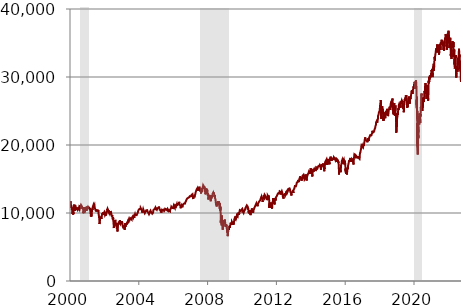
| Category | Series 0 |
|---|---|
| 2000-01-03 | 11357.51 |
| 2000-01-04 | 10997.93 |
| 2000-01-05 | 11122.65 |
| 2000-01-06 | 11253.26 |
| 2000-01-07 | 11522.56 |
| 2000-01-10 | 11572.2 |
| 2000-01-11 | 11511.08 |
| 2000-01-12 | 11551.1 |
| 2000-01-13 | 11582.43 |
| 2000-01-14 | 11722.98 |
| 2000-01-18 | 11560.72 |
| 2000-01-19 | 11489.36 |
| 2000-01-20 | 11351.3 |
| 2000-01-21 | 11251.71 |
| 2000-01-24 | 11008.17 |
| 2000-01-25 | 11029.89 |
| 2000-01-26 | 11032.99 |
| 2000-01-27 | 11028.02 |
| 2000-01-28 | 10738.87 |
| 2000-01-31 | 10940.53 |
| 2000-02-01 | 11041.05 |
| 2000-02-02 | 11003.2 |
| 2000-02-03 | 11013.44 |
| 2000-02-04 | 10963.8 |
| 2000-02-07 | 10905.79 |
| 2000-02-08 | 10957.6 |
| 2000-02-09 | 10699.16 |
| 2000-02-10 | 10643.63 |
| 2000-02-11 | 10425.21 |
| 2000-02-14 | 10519.84 |
| 2000-02-15 | 10718.09 |
| 2000-02-16 | 10561.41 |
| 2000-02-17 | 10514.57 |
| 2000-02-18 | 10219.52 |
| 2000-02-22 | 10304.84 |
| 2000-02-23 | 10225.73 |
| 2000-02-24 | 10092.63 |
| 2000-02-25 | 9862.12 |
| 2000-02-28 | 10038.65 |
| 2000-02-29 | 10128.31 |
| 2000-03-01 | 10137.93 |
| 2000-03-02 | 10164.92 |
| 2000-03-03 | 10367.2 |
| 2000-03-06 | 10170.5 |
| 2000-03-07 | 9796.03 |
| 2000-03-08 | 9856.53 |
| 2000-03-09 | 10010.73 |
| 2000-03-10 | 9928.82 |
| 2000-03-13 | 9947.13 |
| 2000-03-14 | 9811.24 |
| 2000-03-15 | 10131.41 |
| 2000-03-16 | 10630.6 |
| 2000-03-17 | 10595.23 |
| 2000-03-20 | 10680.24 |
| 2000-03-21 | 10907.34 |
| 2000-03-22 | 10866.7 |
| 2000-03-23 | 11119.86 |
| 2000-03-24 | 11112.72 |
| 2000-03-27 | 11025.85 |
| 2000-03-28 | 10936.11 |
| 2000-03-29 | 11018.72 |
| 2000-03-30 | 10980.25 |
| 2000-03-31 | 10921.92 |
| 2000-04-03 | 11221.93 |
| 2000-04-04 | 11164.84 |
| 2000-04-05 | 11033.92 |
| 2000-04-06 | 11114.27 |
| 2000-04-07 | 11111.48 |
| 2000-04-10 | 11186.56 |
| 2000-04-11 | 11287.08 |
| 2000-04-12 | 11125.13 |
| 2000-04-13 | 10923.55 |
| 2000-04-14 | 10305.77 |
| 2000-04-17 | 10582.51 |
| 2000-04-18 | 10767.42 |
| 2000-04-19 | 10674.96 |
| 2000-04-20 | 10844.05 |
| 2000-04-24 | 10906.1 |
| 2000-04-25 | 11124.82 |
| 2000-04-26 | 10945.5 |
| 2000-04-27 | 10888.1 |
| 2000-04-28 | 10733.91 |
| 2000-05-01 | 10811.78 |
| 2000-05-02 | 10731.12 |
| 2000-05-03 | 10480.13 |
| 2000-05-04 | 10412.49 |
| 2000-05-05 | 10577.86 |
| 2000-05-08 | 10603.63 |
| 2000-05-09 | 10536.75 |
| 2000-05-10 | 10367.78 |
| 2000-05-11 | 10545.97 |
| 2000-05-12 | 10609.37 |
| 2000-05-15 | 10807.78 |
| 2000-05-16 | 10934.57 |
| 2000-05-17 | 10769.74 |
| 2000-05-18 | 10777.28 |
| 2000-05-19 | 10626.85 |
| 2000-05-22 | 10542.55 |
| 2000-05-23 | 10422.27 |
| 2000-05-24 | 10535.35 |
| 2000-05-25 | 10323.92 |
| 2000-05-26 | 10299.24 |
| 2000-05-30 | 10527.13 |
| 2000-05-31 | 10522.33 |
| 2000-06-01 | 10652.2 |
| 2000-06-02 | 10794.76 |
| 2000-06-05 | 10815.3 |
| 2000-06-06 | 10735.57 |
| 2000-06-07 | 10812.86 |
| 2000-06-08 | 10668.72 |
| 2000-06-09 | 10614.06 |
| 2000-06-12 | 10564.21 |
| 2000-06-13 | 10621.84 |
| 2000-06-14 | 10687.95 |
| 2000-06-15 | 10714.82 |
| 2000-06-16 | 10449.3 |
| 2000-06-19 | 10557.84 |
| 2000-06-20 | 10435.16 |
| 2000-06-21 | 10497.74 |
| 2000-06-22 | 10376.12 |
| 2000-06-23 | 10404.75 |
| 2000-06-26 | 10542.99 |
| 2000-06-27 | 10504.46 |
| 2000-06-28 | 10527.79 |
| 2000-06-29 | 10398.04 |
| 2000-06-30 | 10447.89 |
| 2000-07-03 | 10560.67 |
| 2000-07-05 | 10483.6 |
| 2000-07-06 | 10481.47 |
| 2000-07-07 | 10635.98 |
| 2000-07-10 | 10646.58 |
| 2000-07-11 | 10727.19 |
| 2000-07-12 | 10783.76 |
| 2000-07-13 | 10788.71 |
| 2000-07-14 | 10812.75 |
| 2000-07-17 | 10804.27 |
| 2000-07-18 | 10739.92 |
| 2000-07-19 | 10696.08 |
| 2000-07-20 | 10843.87 |
| 2000-07-21 | 10733.56 |
| 2000-07-24 | 10682.12 |
| 2000-07-25 | 10699.97 |
| 2000-07-26 | 10516.48 |
| 2000-07-27 | 10586.13 |
| 2000-07-28 | 10511.17 |
| 2000-07-31 | 10521.98 |
| 2000-08-01 | 10606.95 |
| 2000-08-02 | 10687.53 |
| 2000-08-03 | 10706.58 |
| 2000-08-04 | 10767.75 |
| 2000-08-07 | 10867.01 |
| 2000-08-08 | 10976.89 |
| 2000-08-09 | 10905.83 |
| 2000-08-10 | 10908.76 |
| 2000-08-11 | 11027.8 |
| 2000-08-14 | 11176.14 |
| 2000-08-15 | 11067 |
| 2000-08-16 | 11008.39 |
| 2000-08-17 | 11055.64 |
| 2000-08-18 | 11046.48 |
| 2000-08-21 | 11079.81 |
| 2000-08-22 | 11139.15 |
| 2000-08-23 | 11144.65 |
| 2000-08-24 | 11182.74 |
| 2000-08-25 | 11192.63 |
| 2000-08-28 | 11252.84 |
| 2000-08-29 | 11215.1 |
| 2000-08-30 | 11103.01 |
| 2000-08-31 | 11215.1 |
| 2000-09-01 | 11238.78 |
| 2000-09-05 | 11260.61 |
| 2000-09-06 | 11310.64 |
| 2000-09-07 | 11259.87 |
| 2000-09-08 | 11220.65 |
| 2000-09-11 | 11195.49 |
| 2000-09-12 | 11233.23 |
| 2000-09-13 | 11182.18 |
| 2000-09-14 | 11087.47 |
| 2000-09-15 | 10927.06 |
| 2000-09-18 | 10808.52 |
| 2000-09-19 | 10789.29 |
| 2000-09-20 | 10687.92 |
| 2000-09-21 | 10765.52 |
| 2000-09-22 | 10847.37 |
| 2000-09-25 | 10808.15 |
| 2000-09-26 | 10631.32 |
| 2000-09-27 | 10628.36 |
| 2000-09-28 | 10824.06 |
| 2000-09-29 | 10650.92 |
| 2000-10-02 | 10700.13 |
| 2000-10-03 | 10719.74 |
| 2000-10-04 | 10784.48 |
| 2000-10-05 | 10724.92 |
| 2000-10-06 | 10596.54 |
| 2000-10-09 | 10568.43 |
| 2000-10-10 | 10524.4 |
| 2000-10-11 | 10413.79 |
| 2000-10-12 | 10034.58 |
| 2000-10-13 | 10192.18 |
| 2000-10-16 | 10238.8 |
| 2000-10-17 | 10089.71 |
| 2000-10-18 | 9975.02 |
| 2000-10-19 | 10142.98 |
| 2000-10-20 | 10226.59 |
| 2000-10-23 | 10271.72 |
| 2000-10-24 | 10393.07 |
| 2000-10-25 | 10326.48 |
| 2000-10-26 | 10380.12 |
| 2000-10-27 | 10590.62 |
| 2000-10-30 | 10835.77 |
| 2000-10-31 | 10971.14 |
| 2000-11-01 | 10899.47 |
| 2000-11-02 | 10880.51 |
| 2000-11-03 | 10817.95 |
| 2000-11-06 | 10977.21 |
| 2000-11-07 | 10952.18 |
| 2000-11-08 | 10907.06 |
| 2000-11-09 | 10834.25 |
| 2000-11-10 | 10602.95 |
| 2000-11-13 | 10517.25 |
| 2000-11-14 | 10681.06 |
| 2000-11-15 | 10707.6 |
| 2000-11-16 | 10656.03 |
| 2000-11-17 | 10629.87 |
| 2000-11-20 | 10462.65 |
| 2000-11-21 | 10494.5 |
| 2000-11-22 | 10399.32 |
| 2000-11-24 | 10470.23 |
| 2000-11-27 | 10546.07 |
| 2000-11-28 | 10507.58 |
| 2000-11-29 | 10629.11 |
| 2000-11-30 | 10414.49 |
| 2000-12-01 | 10373.54 |
| 2000-12-04 | 10560.1 |
| 2000-12-05 | 10898.72 |
| 2000-12-06 | 10664.38 |
| 2000-12-07 | 10617.36 |
| 2000-12-08 | 10712.91 |
| 2000-12-11 | 10725.8 |
| 2000-12-12 | 10768.27 |
| 2000-12-13 | 10794.44 |
| 2000-12-14 | 10674.99 |
| 2000-12-15 | 10434.96 |
| 2000-12-18 | 10645.42 |
| 2000-12-19 | 10584.37 |
| 2000-12-20 | 10318.93 |
| 2000-12-21 | 10487.29 |
| 2000-12-22 | 10635.56 |
| 2000-12-26 | 10692.44 |
| 2000-12-27 | 10803.16 |
| 2000-12-28 | 10868.76 |
| 2000-12-29 | 10786.85 |
| 2001-01-02 | 10646.15 |
| 2001-01-03 | 10945.75 |
| 2001-01-04 | 10912.41 |
| 2001-01-05 | 10662.01 |
| 2001-01-08 | 10621.35 |
| 2001-01-09 | 10572.55 |
| 2001-01-10 | 10604.27 |
| 2001-01-11 | 10609.55 |
| 2001-01-12 | 10525.38 |
| 2001-01-16 | 10652.66 |
| 2001-01-17 | 10584.34 |
| 2001-01-18 | 10678.28 |
| 2001-01-19 | 10587.59 |
| 2001-01-22 | 10578.24 |
| 2001-01-23 | 10649.81 |
| 2001-01-24 | 10646.97 |
| 2001-01-25 | 10729.52 |
| 2001-01-26 | 10659.98 |
| 2001-01-29 | 10702.19 |
| 2001-01-30 | 10881.2 |
| 2001-01-31 | 10887.36 |
| 2001-02-01 | 10983.63 |
| 2001-02-02 | 10864.1 |
| 2001-02-05 | 10965.85 |
| 2001-02-06 | 10957.42 |
| 2001-02-07 | 10946.72 |
| 2001-02-08 | 10880.55 |
| 2001-02-09 | 10781.45 |
| 2001-02-12 | 10946.77 |
| 2001-02-13 | 10903.32 |
| 2001-02-14 | 10795.41 |
| 2001-02-15 | 10891.02 |
| 2001-02-16 | 10799.82 |
| 2001-02-20 | 10730.88 |
| 2001-02-21 | 10526.58 |
| 2001-02-22 | 10526.81 |
| 2001-02-23 | 10441.9 |
| 2001-02-26 | 10642.53 |
| 2001-02-27 | 10636.88 |
| 2001-02-28 | 10495.28 |
| 2001-03-01 | 10450.14 |
| 2001-03-02 | 10466.31 |
| 2001-03-05 | 10562.3 |
| 2001-03-06 | 10591.22 |
| 2001-03-07 | 10729.6 |
| 2001-03-08 | 10858.25 |
| 2001-03-09 | 10644.62 |
| 2001-03-12 | 10208.25 |
| 2001-03-13 | 10290.8 |
| 2001-03-14 | 9973.46 |
| 2001-03-15 | 10031.28 |
| 2001-03-16 | 9823.41 |
| 2001-03-19 | 9959.11 |
| 2001-03-20 | 9720.76 |
| 2001-03-21 | 9487 |
| 2001-03-22 | 9389.48 |
| 2001-03-23 | 9504.78 |
| 2001-03-26 | 9687.53 |
| 2001-03-27 | 9947.54 |
| 2001-03-28 | 9785.35 |
| 2001-03-29 | 9799.06 |
| 2001-03-30 | 9878.78 |
| 2001-04-02 | 9777.93 |
| 2001-04-03 | 9485.71 |
| 2001-04-04 | 9515.42 |
| 2001-04-05 | 9918.05 |
| 2001-04-06 | 9791.09 |
| 2001-04-09 | 9845.15 |
| 2001-04-10 | 10102.74 |
| 2001-04-11 | 10013.47 |
| 2001-04-12 | 10126.94 |
| 2001-04-16 | 10158.56 |
| 2001-04-17 | 10216.73 |
| 2001-04-18 | 10615.83 |
| 2001-04-19 | 10693.71 |
| 2001-04-20 | 10579.85 |
| 2001-04-23 | 10532.23 |
| 2001-04-24 | 10454.34 |
| 2001-04-25 | 10625.2 |
| 2001-04-26 | 10692.35 |
| 2001-04-27 | 10810.05 |
| 2001-04-30 | 10734.97 |
| 2001-05-01 | 10898.34 |
| 2001-05-02 | 10876.68 |
| 2001-05-03 | 10796.65 |
| 2001-05-04 | 10951.24 |
| 2001-05-07 | 10935.17 |
| 2001-05-08 | 10883.51 |
| 2001-05-09 | 10866.98 |
| 2001-05-10 | 10910.44 |
| 2001-05-11 | 10821.31 |
| 2001-05-14 | 10877.33 |
| 2001-05-15 | 10872.97 |
| 2001-05-16 | 11215.92 |
| 2001-05-17 | 11248.58 |
| 2001-05-18 | 11301.74 |
| 2001-05-21 | 11337.92 |
| 2001-05-22 | 11257.24 |
| 2001-05-23 | 11105.51 |
| 2001-05-24 | 11122.42 |
| 2001-05-25 | 11005.37 |
| 2001-05-29 | 11039.14 |
| 2001-05-30 | 10872.64 |
| 2001-05-31 | 10911.94 |
| 2001-06-01 | 10990.41 |
| 2001-06-04 | 11061.52 |
| 2001-06-05 | 11175.84 |
| 2001-06-06 | 11070.24 |
| 2001-06-07 | 11090.74 |
| 2001-06-08 | 10977 |
| 2001-06-11 | 10922.09 |
| 2001-06-12 | 10948.38 |
| 2001-06-13 | 10871.62 |
| 2001-06-14 | 10690.13 |
| 2001-06-15 | 10623.64 |
| 2001-06-18 | 10645.38 |
| 2001-06-19 | 10596.67 |
| 2001-06-20 | 10647.33 |
| 2001-06-21 | 10715.43 |
| 2001-06-22 | 10604.59 |
| 2001-06-25 | 10504.22 |
| 2001-06-26 | 10472.48 |
| 2001-06-27 | 10434.84 |
| 2001-06-28 | 10566.21 |
| 2001-06-29 | 10502.4 |
| 2001-07-02 | 10593.72 |
| 2001-07-03 | 10571.11 |
| 2001-07-05 | 10479.86 |
| 2001-07-06 | 10252.68 |
| 2001-07-09 | 10299.4 |
| 2001-07-10 | 10175.64 |
| 2001-07-11 | 10241.02 |
| 2001-07-12 | 10478.99 |
| 2001-07-13 | 10539.06 |
| 2001-07-16 | 10472.12 |
| 2001-07-17 | 10606.39 |
| 2001-07-18 | 10569.83 |
| 2001-07-19 | 10610 |
| 2001-07-20 | 10576.65 |
| 2001-07-23 | 10424.42 |
| 2001-07-24 | 10241.12 |
| 2001-07-25 | 10405.67 |
| 2001-07-26 | 10455.63 |
| 2001-07-27 | 10416.67 |
| 2001-07-30 | 10401.72 |
| 2001-07-31 | 10522.81 |
| 2001-08-01 | 10510.01 |
| 2001-08-02 | 10551.18 |
| 2001-08-03 | 10512.78 |
| 2001-08-06 | 10401.31 |
| 2001-08-07 | 10458.74 |
| 2001-08-08 | 10293.5 |
| 2001-08-09 | 10298.56 |
| 2001-08-10 | 10416.25 |
| 2001-08-13 | 10415.91 |
| 2001-08-14 | 10412.17 |
| 2001-08-15 | 10345.95 |
| 2001-08-16 | 10392.52 |
| 2001-08-17 | 10240.78 |
| 2001-08-20 | 10320.07 |
| 2001-08-21 | 10174.14 |
| 2001-08-22 | 10276.9 |
| 2001-08-23 | 10229.15 |
| 2001-08-24 | 10423.17 |
| 2001-08-27 | 10382.35 |
| 2001-08-28 | 10222.03 |
| 2001-08-29 | 10090.9 |
| 2001-08-30 | 9919.58 |
| 2001-08-31 | 9949.75 |
| 2001-09-04 | 9997.49 |
| 2001-09-05 | 10033.27 |
| 2001-09-06 | 9840.84 |
| 2001-09-07 | 9605.85 |
| 2001-09-10 | 9605.51 |
| 2001-09-17 | 8920.7 |
| 2001-09-18 | 8903.4 |
| 2001-09-19 | 8759.13 |
| 2001-09-20 | 8376.21 |
| 2001-09-21 | 8235.81 |
| 2001-09-24 | 8603.86 |
| 2001-09-25 | 8659.97 |
| 2001-09-26 | 8567.39 |
| 2001-09-27 | 8681.42 |
| 2001-09-28 | 8847.56 |
| 2001-10-01 | 8836.83 |
| 2001-10-02 | 8950.59 |
| 2001-10-03 | 9123.78 |
| 2001-10-04 | 9060.88 |
| 2001-10-05 | 9119.77 |
| 2001-10-08 | 9067.94 |
| 2001-10-09 | 9052.44 |
| 2001-10-10 | 9240.86 |
| 2001-10-11 | 9410.45 |
| 2001-10-12 | 9344.16 |
| 2001-10-15 | 9347.62 |
| 2001-10-16 | 9384.23 |
| 2001-10-17 | 9232.97 |
| 2001-10-18 | 9163.22 |
| 2001-10-19 | 9204.11 |
| 2001-10-22 | 9377.03 |
| 2001-10-23 | 9340.08 |
| 2001-10-24 | 9345.62 |
| 2001-10-25 | 9462.9 |
| 2001-10-26 | 9545.17 |
| 2001-10-29 | 9269.5 |
| 2001-10-30 | 9121.98 |
| 2001-10-31 | 9075.14 |
| 2001-11-01 | 9263.9 |
| 2001-11-02 | 9323.54 |
| 2001-11-05 | 9441.03 |
| 2001-11-06 | 9591.12 |
| 2001-11-07 | 9554.37 |
| 2001-11-08 | 9587.52 |
| 2001-11-09 | 9608 |
| 2001-11-12 | 9554.37 |
| 2001-11-13 | 9750.95 |
| 2001-11-14 | 9823.61 |
| 2001-11-15 | 9872.39 |
| 2001-11-16 | 9866.99 |
| 2001-11-19 | 9976.46 |
| 2001-11-20 | 9901.38 |
| 2001-11-21 | 9834.68 |
| 2001-11-23 | 9959.71 |
| 2001-11-26 | 9982.75 |
| 2001-11-27 | 9872.6 |
| 2001-11-28 | 9711.86 |
| 2001-11-29 | 9829.42 |
| 2001-11-30 | 9851.56 |
| 2001-12-03 | 9763.96 |
| 2001-12-04 | 9893.84 |
| 2001-12-05 | 10114.29 |
| 2001-12-06 | 10099.14 |
| 2001-12-07 | 10049.46 |
| 2001-12-10 | 9921.45 |
| 2001-12-11 | 9888.37 |
| 2001-12-12 | 9894.81 |
| 2001-12-13 | 9766.45 |
| 2001-12-14 | 9811.15 |
| 2001-12-17 | 9891.97 |
| 2001-12-18 | 9998.39 |
| 2001-12-19 | 10070.49 |
| 2001-12-20 | 9985.18 |
| 2001-12-21 | 10035.34 |
| 2001-12-24 | 10035.34 |
| 2001-12-26 | 10088.14 |
| 2001-12-27 | 10131.31 |
| 2001-12-28 | 10136.99 |
| 2001-12-31 | 10021.5 |
| 2002-01-02 | 10073.4 |
| 2002-01-03 | 10172.14 |
| 2002-01-04 | 10259.74 |
| 2002-01-07 | 10197.05 |
| 2002-01-08 | 10150.55 |
| 2002-01-09 | 10094.09 |
| 2002-01-10 | 10067.86 |
| 2002-01-11 | 9987.53 |
| 2002-01-14 | 9891.42 |
| 2002-01-15 | 9924.15 |
| 2002-01-16 | 9712.27 |
| 2002-01-17 | 9850.04 |
| 2002-01-18 | 9771.85 |
| 2002-01-22 | 9713.8 |
| 2002-01-23 | 9730.96 |
| 2002-01-24 | 9796.07 |
| 2002-01-25 | 9840.08 |
| 2002-01-28 | 9865.75 |
| 2002-01-29 | 9618.24 |
| 2002-01-30 | 9762.86 |
| 2002-01-31 | 9920 |
| 2002-02-01 | 9907.26 |
| 2002-02-04 | 9687.09 |
| 2002-02-05 | 9685.43 |
| 2002-02-06 | 9653.39 |
| 2002-02-07 | 9625.44 |
| 2002-02-08 | 9744.24 |
| 2002-02-11 | 9884.78 |
| 2002-02-12 | 9863.74 |
| 2002-02-13 | 9989.67 |
| 2002-02-14 | 10001.99 |
| 2002-02-15 | 9903.04 |
| 2002-02-19 | 9745.14 |
| 2002-02-20 | 9941.17 |
| 2002-02-21 | 9834.68 |
| 2002-02-22 | 9968.15 |
| 2002-02-25 | 10145.71 |
| 2002-02-26 | 10115.26 |
| 2002-02-27 | 10127.58 |
| 2002-02-28 | 10106.13 |
| 2002-03-01 | 10368.86 |
| 2002-03-04 | 10586.82 |
| 2002-03-05 | 10433.41 |
| 2002-03-06 | 10574.29 |
| 2002-03-07 | 10525.37 |
| 2002-03-08 | 10572.49 |
| 2002-03-11 | 10611.24 |
| 2002-03-12 | 10632.35 |
| 2002-03-13 | 10501.85 |
| 2002-03-14 | 10517.14 |
| 2002-03-15 | 10607.23 |
| 2002-03-18 | 10577.75 |
| 2002-03-19 | 10635.25 |
| 2002-03-20 | 10501.57 |
| 2002-03-21 | 10479.84 |
| 2002-03-22 | 10427.67 |
| 2002-03-25 | 10281.67 |
| 2002-03-26 | 10353.36 |
| 2002-03-27 | 10426.91 |
| 2002-03-28 | 10403.94 |
| 2002-04-01 | 10362.7 |
| 2002-04-02 | 10313.71 |
| 2002-04-03 | 10198.29 |
| 2002-04-04 | 10235.17 |
| 2002-04-05 | 10271.64 |
| 2002-04-08 | 10249.08 |
| 2002-04-09 | 10208.67 |
| 2002-04-10 | 10381.73 |
| 2002-04-11 | 10176.08 |
| 2002-04-12 | 10190.82 |
| 2002-04-15 | 10093.67 |
| 2002-04-16 | 10301.32 |
| 2002-04-17 | 10220.78 |
| 2002-04-18 | 10205.28 |
| 2002-04-19 | 10257.11 |
| 2002-04-22 | 10136.43 |
| 2002-04-23 | 10089.24 |
| 2002-04-24 | 10030.43 |
| 2002-04-25 | 10035.06 |
| 2002-04-26 | 9910.72 |
| 2002-04-29 | 9819.87 |
| 2002-04-30 | 9946.22 |
| 2002-05-01 | 10059.63 |
| 2002-05-02 | 10091.87 |
| 2002-05-03 | 10006.63 |
| 2002-05-06 | 9808.04 |
| 2002-05-07 | 9836.55 |
| 2002-05-08 | 10141.83 |
| 2002-05-09 | 10037.42 |
| 2002-05-10 | 9939.92 |
| 2002-05-13 | 10109.66 |
| 2002-05-14 | 10298.14 |
| 2002-05-15 | 10243.68 |
| 2002-05-16 | 10289.21 |
| 2002-05-17 | 10353.08 |
| 2002-05-20 | 10229.5 |
| 2002-05-21 | 10105.71 |
| 2002-05-22 | 10157.88 |
| 2002-05-23 | 10216.08 |
| 2002-05-24 | 10104.26 |
| 2002-05-28 | 9981.58 |
| 2002-05-29 | 9923.04 |
| 2002-05-30 | 9911.69 |
| 2002-05-31 | 9925.25 |
| 2002-06-03 | 9709.79 |
| 2002-06-04 | 9687.84 |
| 2002-06-05 | 9796.8 |
| 2002-06-06 | 9624.64 |
| 2002-06-07 | 9589.67 |
| 2002-06-10 | 9645.4 |
| 2002-06-11 | 9517.26 |
| 2002-06-12 | 9617.71 |
| 2002-06-13 | 9502.8 |
| 2002-06-14 | 9474.21 |
| 2002-06-17 | 9687.42 |
| 2002-06-18 | 9706.12 |
| 2002-06-19 | 9561.57 |
| 2002-06-20 | 9431.77 |
| 2002-06-21 | 9253.79 |
| 2002-06-24 | 9281.82 |
| 2002-06-25 | 9126.82 |
| 2002-06-26 | 9120.11 |
| 2002-06-27 | 9269.92 |
| 2002-06-28 | 9243.26 |
| 2002-07-01 | 9109.79 |
| 2002-07-02 | 9007.75 |
| 2002-07-03 | 9054.97 |
| 2002-07-05 | 9379.5 |
| 2002-07-08 | 9274.9 |
| 2002-07-09 | 9096.09 |
| 2002-07-10 | 8813.5 |
| 2002-07-11 | 8801.53 |
| 2002-07-12 | 8684.53 |
| 2002-07-15 | 8639.19 |
| 2002-07-16 | 8473.11 |
| 2002-07-17 | 8542.48 |
| 2002-07-18 | 8409.49 |
| 2002-07-19 | 8019.26 |
| 2002-07-22 | 7784.58 |
| 2002-07-23 | 7702.34 |
| 2002-07-24 | 8191.29 |
| 2002-07-25 | 8186.31 |
| 2002-07-26 | 8264.39 |
| 2002-07-29 | 8711.88 |
| 2002-07-30 | 8680.03 |
| 2002-07-31 | 8736.59 |
| 2002-08-01 | 8506.62 |
| 2002-08-02 | 8313.13 |
| 2002-08-05 | 8043.63 |
| 2002-08-06 | 8274.09 |
| 2002-08-07 | 8456.15 |
| 2002-08-08 | 8712.02 |
| 2002-08-09 | 8745.45 |
| 2002-08-12 | 8688.89 |
| 2002-08-13 | 8482.39 |
| 2002-08-14 | 8743.31 |
| 2002-08-15 | 8818.14 |
| 2002-08-16 | 8778.06 |
| 2002-08-19 | 8990.79 |
| 2002-08-20 | 8872.07 |
| 2002-08-21 | 8957.23 |
| 2002-08-22 | 9053.64 |
| 2002-08-23 | 8872.96 |
| 2002-08-26 | 8919.01 |
| 2002-08-27 | 8824.41 |
| 2002-08-28 | 8694.09 |
| 2002-08-29 | 8670.99 |
| 2002-08-30 | 8663.5 |
| 2002-09-03 | 8308.05 |
| 2002-09-04 | 8425.12 |
| 2002-09-05 | 8283.7 |
| 2002-09-06 | 8427.2 |
| 2002-09-09 | 8519.38 |
| 2002-09-10 | 8602.61 |
| 2002-09-11 | 8581.17 |
| 2002-09-12 | 8379.41 |
| 2002-09-13 | 8312.69 |
| 2002-09-16 | 8380.18 |
| 2002-09-17 | 8207.55 |
| 2002-09-18 | 8172.45 |
| 2002-09-19 | 7942.39 |
| 2002-09-20 | 7986.02 |
| 2002-09-23 | 7872.15 |
| 2002-09-24 | 7683.13 |
| 2002-09-25 | 7841.82 |
| 2002-09-26 | 7997.12 |
| 2002-09-27 | 7701.45 |
| 2002-09-30 | 7591.93 |
| 2002-10-01 | 7938.79 |
| 2002-10-02 | 7755.61 |
| 2002-10-03 | 7717.19 |
| 2002-10-04 | 7528.4 |
| 2002-10-07 | 7422.84 |
| 2002-10-08 | 7501.49 |
| 2002-10-09 | 7286.27 |
| 2002-10-10 | 7533.95 |
| 2002-10-11 | 7850.29 |
| 2002-10-14 | 7877.4 |
| 2002-10-15 | 8255.68 |
| 2002-10-16 | 8036.03 |
| 2002-10-17 | 8275.04 |
| 2002-10-18 | 8322.4 |
| 2002-10-21 | 8538.24 |
| 2002-10-22 | 8450.16 |
| 2002-10-23 | 8494.27 |
| 2002-10-24 | 8317.34 |
| 2002-10-25 | 8443.99 |
| 2002-10-28 | 8368.04 |
| 2002-10-29 | 8368.94 |
| 2002-10-30 | 8427.41 |
| 2002-10-31 | 8397.03 |
| 2002-11-01 | 8517.64 |
| 2002-11-04 | 8571.6 |
| 2002-11-05 | 8678.27 |
| 2002-11-06 | 8771.01 |
| 2002-11-07 | 8586.24 |
| 2002-11-08 | 8537.13 |
| 2002-11-11 | 8358.95 |
| 2002-11-12 | 8386 |
| 2002-11-13 | 8398.49 |
| 2002-11-14 | 8542.13 |
| 2002-11-15 | 8579.09 |
| 2002-11-18 | 8486.57 |
| 2002-11-19 | 8474.78 |
| 2002-11-20 | 8623.01 |
| 2002-11-21 | 8845.15 |
| 2002-11-22 | 8804.84 |
| 2002-11-25 | 8849.4 |
| 2002-11-26 | 8676.42 |
| 2002-11-27 | 8931.68 |
| 2002-11-29 | 8896.09 |
| 2002-12-02 | 8862.57 |
| 2002-12-03 | 8742.93 |
| 2002-12-04 | 8737.85 |
| 2002-12-05 | 8623.28 |
| 2002-12-06 | 8645.77 |
| 2002-12-09 | 8473.41 |
| 2002-12-10 | 8574.26 |
| 2002-12-11 | 8589.14 |
| 2002-12-12 | 8538.4 |
| 2002-12-13 | 8433.71 |
| 2002-12-16 | 8627.4 |
| 2002-12-17 | 8535.39 |
| 2002-12-18 | 8447.35 |
| 2002-12-19 | 8364.8 |
| 2002-12-20 | 8511.32 |
| 2002-12-23 | 8493.29 |
| 2002-12-24 | 8448.11 |
| 2002-12-26 | 8432.61 |
| 2002-12-27 | 8303.78 |
| 2002-12-30 | 8332.85 |
| 2002-12-31 | 8341.63 |
| 2003-01-02 | 8607.52 |
| 2003-01-03 | 8601.69 |
| 2003-01-06 | 8773.57 |
| 2003-01-07 | 8740.59 |
| 2003-01-08 | 8595.31 |
| 2003-01-09 | 8776.18 |
| 2003-01-10 | 8784.89 |
| 2003-01-13 | 8785.98 |
| 2003-01-14 | 8842.62 |
| 2003-01-15 | 8723.18 |
| 2003-01-16 | 8697.87 |
| 2003-01-17 | 8586.74 |
| 2003-01-21 | 8442.9 |
| 2003-01-22 | 8318.73 |
| 2003-01-23 | 8369.47 |
| 2003-01-24 | 8131.01 |
| 2003-01-27 | 7989.56 |
| 2003-01-28 | 8088.84 |
| 2003-01-29 | 8110.71 |
| 2003-01-30 | 7945.13 |
| 2003-01-31 | 8053.81 |
| 2003-02-03 | 8109.82 |
| 2003-02-04 | 8013.29 |
| 2003-02-05 | 7985.18 |
| 2003-02-06 | 7929.3 |
| 2003-02-07 | 7864.23 |
| 2003-02-10 | 7920.11 |
| 2003-02-11 | 7843.11 |
| 2003-02-12 | 7758.17 |
| 2003-02-13 | 7749.87 |
| 2003-02-14 | 7908.8 |
| 2003-02-18 | 8041.15 |
| 2003-02-19 | 8000.6 |
| 2003-02-20 | 7914.96 |
| 2003-02-21 | 8018.11 |
| 2003-02-24 | 7858.24 |
| 2003-02-25 | 7909.5 |
| 2003-02-26 | 7806.98 |
| 2003-02-27 | 7884.99 |
| 2003-02-28 | 7891.08 |
| 2003-03-03 | 7837.86 |
| 2003-03-04 | 7704.87 |
| 2003-03-05 | 7775.6 |
| 2003-03-06 | 7673.99 |
| 2003-03-07 | 7740.03 |
| 2003-03-10 | 7568.18 |
| 2003-03-11 | 7524.06 |
| 2003-03-12 | 7552.07 |
| 2003-03-13 | 7821.75 |
| 2003-03-14 | 7859.71 |
| 2003-03-17 | 8141.92 |
| 2003-03-18 | 8194.23 |
| 2003-03-19 | 8265.45 |
| 2003-03-20 | 8286.6 |
| 2003-03-21 | 8521.97 |
| 2003-03-24 | 8214.68 |
| 2003-03-25 | 8280.23 |
| 2003-03-26 | 8229.88 |
| 2003-03-27 | 8201.45 |
| 2003-03-28 | 8145.77 |
| 2003-03-31 | 7992.13 |
| 2003-04-01 | 8069.86 |
| 2003-04-02 | 8285.06 |
| 2003-04-03 | 8240.38 |
| 2003-04-04 | 8277.15 |
| 2003-04-07 | 8300.41 |
| 2003-04-08 | 8298.92 |
| 2003-04-09 | 8197.94 |
| 2003-04-10 | 8221.33 |
| 2003-04-11 | 8203.41 |
| 2003-04-14 | 8351.1 |
| 2003-04-15 | 8402.36 |
| 2003-04-16 | 8257.61 |
| 2003-04-17 | 8337.65 |
| 2003-04-21 | 8328.9 |
| 2003-04-22 | 8484.99 |
| 2003-04-23 | 8515.66 |
| 2003-04-24 | 8440.04 |
| 2003-04-25 | 8306.35 |
| 2003-04-28 | 8471.61 |
| 2003-04-29 | 8502.99 |
| 2003-04-30 | 8480.09 |
| 2003-05-01 | 8454.25 |
| 2003-05-02 | 8582.68 |
| 2003-05-05 | 8531.57 |
| 2003-05-06 | 8588.36 |
| 2003-05-07 | 8560.63 |
| 2003-05-08 | 8491.22 |
| 2003-05-09 | 8604.6 |
| 2003-05-12 | 8726.73 |
| 2003-05-13 | 8679.25 |
| 2003-05-14 | 8647.82 |
| 2003-05-15 | 8713.14 |
| 2003-05-16 | 8678.97 |
| 2003-05-19 | 8493.39 |
| 2003-05-20 | 8491.36 |
| 2003-05-21 | 8516.43 |
| 2003-05-22 | 8594.02 |
| 2003-05-23 | 8601.38 |
| 2003-05-27 | 8781.35 |
| 2003-05-28 | 8793.12 |
| 2003-05-29 | 8711.18 |
| 2003-05-30 | 8850.26 |
| 2003-06-02 | 8897.81 |
| 2003-06-03 | 8922.95 |
| 2003-06-04 | 9038.98 |
| 2003-06-05 | 9041.3 |
| 2003-06-06 | 9062.79 |
| 2003-06-09 | 8980 |
| 2003-06-10 | 9054.89 |
| 2003-06-11 | 9183.22 |
| 2003-06-12 | 9196.55 |
| 2003-06-13 | 9117.12 |
| 2003-06-16 | 9318.96 |
| 2003-06-17 | 9323.02 |
| 2003-06-18 | 9293.8 |
| 2003-06-19 | 9179.53 |
| 2003-06-20 | 9200.75 |
| 2003-06-23 | 9072.95 |
| 2003-06-24 | 9109.85 |
| 2003-06-25 | 9011.53 |
| 2003-06-26 | 9079.04 |
| 2003-06-27 | 8989.05 |
| 2003-06-30 | 8985.44 |
| 2003-07-01 | 9040.95 |
| 2003-07-02 | 9142.84 |
| 2003-07-03 | 9070.21 |
| 2003-07-07 | 9216.79 |
| 2003-07-08 | 9223.09 |
| 2003-07-09 | 9156.21 |
| 2003-07-10 | 9036.04 |
| 2003-07-11 | 9119.59 |
| 2003-07-14 | 9177.15 |
| 2003-07-15 | 9128.97 |
| 2003-07-16 | 9094.59 |
| 2003-07-17 | 9050.82 |
| 2003-07-18 | 9188.15 |
| 2003-07-21 | 9096.69 |
| 2003-07-22 | 9158.45 |
| 2003-07-23 | 9194.24 |
| 2003-07-24 | 9112.51 |
| 2003-07-25 | 9284.57 |
| 2003-07-28 | 9266.51 |
| 2003-07-29 | 9204.46 |
| 2003-07-30 | 9200.05 |
| 2003-07-31 | 9233.8 |
| 2003-08-01 | 9153.97 |
| 2003-08-04 | 9186.04 |
| 2003-08-05 | 9036.32 |
| 2003-08-06 | 9061.74 |
| 2003-08-07 | 9126.45 |
| 2003-08-08 | 9191.09 |
| 2003-08-11 | 9217.35 |
| 2003-08-12 | 9310.06 |
| 2003-08-13 | 9271.76 |
| 2003-08-14 | 9310.56 |
| 2003-08-15 | 9321.69 |
| 2003-08-18 | 9412.45 |
| 2003-08-19 | 9428.9 |
| 2003-08-20 | 9397.51 |
| 2003-08-21 | 9423.68 |
| 2003-08-22 | 9348.87 |
| 2003-08-25 | 9317.64 |
| 2003-08-26 | 9340.45 |
| 2003-08-27 | 9333.79 |
| 2003-08-28 | 9374.21 |
| 2003-08-29 | 9415.82 |
| 2003-09-02 | 9523.27 |
| 2003-09-03 | 9568.46 |
| 2003-09-04 | 9587.9 |
| 2003-09-05 | 9503.34 |
| 2003-09-08 | 9586.29 |
| 2003-09-09 | 9507.2 |
| 2003-09-10 | 9420.46 |
| 2003-09-11 | 9459.76 |
| 2003-09-12 | 9471.55 |
| 2003-09-15 | 9448.81 |
| 2003-09-16 | 9567.34 |
| 2003-09-17 | 9545.65 |
| 2003-09-18 | 9659.13 |
| 2003-09-19 | 9644.82 |
| 2003-09-22 | 9535.41 |
| 2003-09-23 | 9576.04 |
| 2003-09-24 | 9425.51 |
| 2003-09-25 | 9343.96 |
| 2003-09-26 | 9313.08 |
| 2003-09-29 | 9380.24 |
| 2003-09-30 | 9275.06 |
| 2003-10-01 | 9469.2 |
| 2003-10-02 | 9487.8 |
| 2003-10-03 | 9572.31 |
| 2003-10-06 | 9594.98 |
| 2003-10-07 | 9654.61 |
| 2003-10-08 | 9630.9 |
| 2003-10-09 | 9680.01 |
| 2003-10-10 | 9674.68 |
| 2003-10-13 | 9764.38 |
| 2003-10-14 | 9812.98 |
| 2003-10-15 | 9803.05 |
| 2003-10-16 | 9791.72 |
| 2003-10-17 | 9721.79 |
| 2003-10-20 | 9777.94 |
| 2003-10-21 | 9747.64 |
| 2003-10-22 | 9598.24 |
| 2003-10-23 | 9613.13 |
| 2003-10-24 | 9582.46 |
| 2003-10-27 | 9608.16 |
| 2003-10-28 | 9748.31 |
| 2003-10-29 | 9774.53 |
| 2003-10-30 | 9786.61 |
| 2003-10-31 | 9801.12 |
| 2003-11-03 | 9858.46 |
| 2003-11-04 | 9838.83 |
| 2003-11-05 | 9820.83 |
| 2003-11-06 | 9856.97 |
| 2003-11-07 | 9809.79 |
| 2003-11-10 | 9756.53 |
| 2003-11-11 | 9737.79 |
| 2003-11-12 | 9848.83 |
| 2003-11-13 | 9837.94 |
| 2003-11-14 | 9768.68 |
| 2003-11-17 | 9710.83 |
| 2003-11-18 | 9624.16 |
| 2003-11-19 | 9690.46 |
| 2003-11-20 | 9619.42 |
| 2003-11-21 | 9628.53 |
| 2003-11-24 | 9747.79 |
| 2003-11-25 | 9763.94 |
| 2003-11-26 | 9779.57 |
| 2003-11-28 | 9782.46 |
| 2003-12-01 | 9899.05 |
| 2003-12-02 | 9853.64 |
| 2003-12-03 | 9873.42 |
| 2003-12-04 | 9930.82 |
| 2003-12-05 | 9862.68 |
| 2003-12-08 | 9965.27 |
| 2003-12-09 | 9923.42 |
| 2003-12-10 | 9921.86 |
| 2003-12-11 | 10008.16 |
| 2003-12-12 | 10042.16 |
| 2003-12-15 | 10022.82 |
| 2003-12-16 | 10129.56 |
| 2003-12-17 | 10145.26 |
| 2003-12-18 | 10248.08 |
| 2003-12-19 | 10278.22 |
| 2003-12-22 | 10338 |
| 2003-12-23 | 10341.26 |
| 2003-12-24 | 10305.19 |
| 2003-12-26 | 10324.67 |
| 2003-12-29 | 10450 |
| 2003-12-30 | 10425.04 |
| 2003-12-31 | 10453.92 |
| 2004-01-02 | 10409.85 |
| 2004-01-05 | 10544.07 |
| 2004-01-06 | 10538.66 |
| 2004-01-07 | 10529.03 |
| 2004-01-08 | 10592.44 |
| 2004-01-09 | 10458.89 |
| 2004-01-12 | 10485.18 |
| 2004-01-13 | 10427.18 |
| 2004-01-14 | 10538.37 |
| 2004-01-15 | 10553.85 |
| 2004-01-16 | 10600.51 |
| 2004-01-20 | 10528.66 |
| 2004-01-21 | 10623.62 |
| 2004-01-22 | 10623.18 |
| 2004-01-23 | 10568.29 |
| 2004-01-26 | 10702.51 |
| 2004-01-27 | 10609.92 |
| 2004-01-28 | 10468.37 |
| 2004-01-29 | 10510.29 |
| 2004-01-30 | 10488.07 |
| 2004-02-02 | 10499.18 |
| 2004-02-03 | 10505.18 |
| 2004-02-04 | 10470.74 |
| 2004-02-05 | 10495.55 |
| 2004-02-06 | 10593.03 |
| 2004-02-09 | 10579.03 |
| 2004-02-10 | 10613.85 |
| 2004-02-11 | 10737.7 |
| 2004-02-12 | 10694.07 |
| 2004-02-13 | 10627.85 |
| 2004-02-17 | 10714.88 |
| 2004-02-18 | 10671.99 |
| 2004-02-19 | 10664.73 |
| 2004-02-20 | 10619.03 |
| 2004-02-23 | 10609.62 |
| 2004-02-24 | 10566.37 |
| 2004-02-25 | 10601.62 |
| 2004-02-26 | 10580.14 |
| 2004-02-27 | 10583.92 |
| 2004-03-01 | 10678.14 |
| 2004-03-02 | 10591.48 |
| 2004-03-03 | 10593.11 |
| 2004-03-04 | 10588 |
| 2004-03-05 | 10595.55 |
| 2004-03-08 | 10529.48 |
| 2004-03-09 | 10456.96 |
| 2004-03-10 | 10296.89 |
| 2004-03-11 | 10128.38 |
| 2004-03-12 | 10240.08 |
| 2004-03-15 | 10102.89 |
| 2004-03-16 | 10184.67 |
| 2004-03-17 | 10300.3 |
| 2004-03-18 | 10295.78 |
| 2004-03-19 | 10186.6 |
| 2004-03-22 | 10064.75 |
| 2004-03-23 | 10063.64 |
| 2004-03-24 | 10048.23 |
| 2004-03-25 | 10218.82 |
| 2004-03-26 | 10212.97 |
| 2004-03-29 | 10329.63 |
| 2004-03-30 | 10381.7 |
| 2004-03-31 | 10357.7 |
| 2004-04-01 | 10373.33 |
| 2004-04-02 | 10470.59 |
| 2004-04-05 | 10558.37 |
| 2004-04-06 | 10570.81 |
| 2004-04-07 | 10480.15 |
| 2004-04-08 | 10442.03 |
| 2004-04-12 | 10515.56 |
| 2004-04-13 | 10381.28 |
| 2004-04-14 | 10377.95 |
| 2004-04-15 | 10397.46 |
| 2004-04-16 | 10451.97 |
| 2004-04-19 | 10437.85 |
| 2004-04-20 | 10314.5 |
| 2004-04-21 | 10317.27 |
| 2004-04-22 | 10461.2 |
| 2004-04-23 | 10472.84 |
| 2004-04-26 | 10444.73 |
| 2004-04-27 | 10478.16 |
| 2004-04-28 | 10342.6 |
| 2004-04-29 | 10272.27 |
| 2004-04-30 | 10225.57 |
| 2004-05-03 | 10314 |
| 2004-05-04 | 10317.2 |
| 2004-05-05 | 10310.95 |
| 2004-05-06 | 10241.26 |
| 2004-05-07 | 10117.34 |
| 2004-05-10 | 9990.02 |
| 2004-05-11 | 10019.47 |
| 2004-05-12 | 10045.16 |
| 2004-05-13 | 10010.74 |
| 2004-05-14 | 10012.87 |
| 2004-05-17 | 9906.91 |
| 2004-05-18 | 9968.51 |
| 2004-05-19 | 9937.71 |
| 2004-05-20 | 9937.64 |
| 2004-05-21 | 9966.74 |
| 2004-05-24 | 9958.43 |
| 2004-05-25 | 10117.62 |
| 2004-05-26 | 10109.89 |
| 2004-05-27 | 10205.2 |
| 2004-05-28 | 10188.45 |
| 2004-06-01 | 10202.65 |
| 2004-06-02 | 10262.97 |
| 2004-06-03 | 10195.91 |
| 2004-06-04 | 10242.82 |
| 2004-06-07 | 10391.08 |
| 2004-06-08 | 10432.52 |
| 2004-06-09 | 10368.44 |
| 2004-06-10 | 10410.1 |
| 2004-06-14 | 10334.73 |
| 2004-06-15 | 10380.43 |
| 2004-06-16 | 10379.58 |
| 2004-06-17 | 10377.52 |
| 2004-06-18 | 10416.41 |
| 2004-06-21 | 10371.47 |
| 2004-06-22 | 10395.07 |
| 2004-06-23 | 10479.57 |
| 2004-06-24 | 10443.81 |
| 2004-06-25 | 10371.84 |
| 2004-06-28 | 10357.09 |
| 2004-06-29 | 10413.43 |
| 2004-06-30 | 10435.48 |
| 2004-07-01 | 10334.16 |
| 2004-07-02 | 10282.83 |
| 2004-07-06 | 10219.34 |
| 2004-07-07 | 10240.29 |
| 2004-07-08 | 10171.56 |
| 2004-07-09 | 10213.22 |
| 2004-07-12 | 10238.22 |
| 2004-07-13 | 10247.59 |
| 2004-07-14 | 10208.8 |
| 2004-07-15 | 10163.16 |
| 2004-07-16 | 10139.78 |
| 2004-07-19 | 10094.06 |
| 2004-07-20 | 10149.07 |
| 2004-07-21 | 10046.13 |
| 2004-07-22 | 10050.33 |
| 2004-07-23 | 9962.22 |
| 2004-07-26 | 9961.92 |
| 2004-07-27 | 10085.14 |
| 2004-07-28 | 10117.07 |
| 2004-07-29 | 10129.24 |
| 2004-07-30 | 10139.71 |
| 2004-08-02 | 10179.16 |
| 2004-08-03 | 10120.24 |
| 2004-08-04 | 10126.51 |
| 2004-08-05 | 9963.03 |
| 2004-08-06 | 9815.33 |
| 2004-08-09 | 9814.66 |
| 2004-08-10 | 9944.67 |
| 2004-08-11 | 9938.32 |
| 2004-08-12 | 9814.59 |
| 2004-08-13 | 9825.35 |
| 2004-08-16 | 9954.55 |
| 2004-08-17 | 9972.83 |
| 2004-08-18 | 10083.15 |
| 2004-08-19 | 10040.82 |
| 2004-08-20 | 10110.14 |
| 2004-08-23 | 10073.05 |
| 2004-08-24 | 10098.63 |
| 2004-08-25 | 10181.74 |
| 2004-08-26 | 10173.41 |
| 2004-08-27 | 10195.01 |
| 2004-08-30 | 10122.52 |
| 2004-08-31 | 10173.92 |
| 2004-09-01 | 10168.46 |
| 2004-09-02 | 10290.28 |
| 2004-09-03 | 10260.2 |
| 2004-09-07 | 10342.79 |
| 2004-09-08 | 10313.36 |
| 2004-09-09 | 10289.1 |
| 2004-09-10 | 10313.07 |
| 2004-09-13 | 10314.76 |
| 2004-09-14 | 10318.16 |
| 2004-09-15 | 10231.36 |
| 2004-09-16 | 10244.49 |
| 2004-09-17 | 10284.46 |
| 2004-09-20 | 10204.89 |
| 2004-09-21 | 10244.93 |
| 2004-09-22 | 10109.18 |
| 2004-09-23 | 10038.9 |
| 2004-09-24 | 10047.24 |
| 2004-09-27 | 9988.54 |
| 2004-09-28 | 10077.4 |
| 2004-09-29 | 10136.24 |
| 2004-09-30 | 10080.27 |
| 2004-10-01 | 10192.65 |
| 2004-10-04 | 10216.54 |
| 2004-10-05 | 10177.68 |
| 2004-10-06 | 10239.92 |
| 2004-10-07 | 10125.4 |
| 2004-10-08 | 10055.2 |
| 2004-10-11 | 10081.97 |
| 2004-10-12 | 10077.18 |
| 2004-10-13 | 10002.33 |
| 2004-10-14 | 9894.45 |
| 2004-10-15 | 9933.38 |
| 2004-10-18 | 9956.32 |
| 2004-10-19 | 9897.62 |
| 2004-10-20 | 9886.93 |
| 2004-10-21 | 9865.76 |
| 2004-10-22 | 9757.81 |
| 2004-10-25 | 9749.99 |
| 2004-10-26 | 9888.48 |
| 2004-10-27 | 10002.03 |
| 2004-10-28 | 10004.54 |
| 2004-10-29 | 10027.47 |
| 2004-11-01 | 10054.39 |
| 2004-11-02 | 10035.73 |
| 2004-11-03 | 10137.05 |
| 2004-11-04 | 10314.76 |
| 2004-11-05 | 10387.54 |
| 2004-11-08 | 10391.31 |
| 2004-11-09 | 10386.37 |
| 2004-11-10 | 10385.48 |
| 2004-11-11 | 10469.84 |
| 2004-11-12 | 10539.01 |
| 2004-11-15 | 10550.24 |
| 2004-11-16 | 10487.65 |
| 2004-11-17 | 10549.57 |
| 2004-11-18 | 10572.55 |
| 2004-11-19 | 10456.91 |
| 2004-11-22 | 10489.42 |
| 2004-11-23 | 10492.6 |
| 2004-11-24 | 10520.31 |
| 2004-11-26 | 10522.23 |
| 2004-11-29 | 10475.9 |
| 2004-11-30 | 10428.02 |
| 2004-12-01 | 10590.22 |
| 2004-12-02 | 10585.12 |
| 2004-12-03 | 10592.21 |
| 2004-12-06 | 10547.06 |
| 2004-12-07 | 10440.58 |
| 2004-12-08 | 10494.23 |
| 2004-12-09 | 10552.82 |
| 2004-12-10 | 10543.22 |
| 2004-12-13 | 10638.32 |
| 2004-12-14 | 10676.45 |
| 2004-12-15 | 10691.45 |
| 2004-12-16 | 10705.64 |
| 2004-12-17 | 10649.92 |
| 2004-12-20 | 10661.6 |
| 2004-12-21 | 10759.43 |
| 2004-12-22 | 10815.89 |
| 2004-12-23 | 10827.12 |
| 2004-12-27 | 10776.13 |
| 2004-12-28 | 10854.54 |
| 2004-12-29 | 10829.19 |
| 2004-12-30 | 10800.3 |
| 2004-12-31 | 10783.01 |
| 2005-01-03 | 10729.43 |
| 2005-01-04 | 10630.78 |
| 2005-01-05 | 10597.83 |
| 2005-01-06 | 10622.88 |
| 2005-01-07 | 10603.96 |
| 2005-01-10 | 10621.03 |
| 2005-01-11 | 10556.22 |
| 2005-01-12 | 10617.78 |
| 2005-01-13 | 10505.83 |
| 2005-01-14 | 10558 |
| 2005-01-18 | 10628.79 |
| 2005-01-19 | 10539.97 |
| 2005-01-20 | 10471.47 |
| 2005-01-21 | 10392.99 |
| 2005-01-24 | 10368.61 |
| 2005-01-25 | 10461.56 |
| 2005-01-26 | 10498.59 |
| 2005-01-27 | 10467.4 |
| 2005-01-28 | 10427.2 |
| 2005-01-31 | 10489.94 |
| 2005-02-01 | 10551.94 |
| 2005-02-02 | 10596.79 |
| 2005-02-03 | 10593.1 |
| 2005-02-04 | 10716.13 |
| 2005-02-07 | 10715.76 |
| 2005-02-08 | 10724.63 |
| 2005-02-09 | 10664.11 |
| 2005-02-10 | 10749.61 |
| 2005-02-11 | 10796.01 |
| 2005-02-14 | 10791.13 |
| 2005-02-15 | 10837.32 |
| 2005-02-16 | 10834.88 |
| 2005-02-17 | 10754.26 |
| 2005-02-18 | 10785.22 |
| 2005-02-22 | 10611.2 |
| 2005-02-23 | 10673.79 |
| 2005-02-24 | 10748.79 |
| 2005-02-25 | 10841.6 |
| 2005-02-28 | 10766.23 |
| 2005-03-01 | 10830 |
| 2005-03-02 | 10811.97 |
| 2005-03-03 | 10833.03 |
| 2005-03-04 | 10940.55 |
| 2005-03-07 | 10936.86 |
| 2005-03-08 | 10912.62 |
| 2005-03-09 | 10805.62 |
| 2005-03-10 | 10851.51 |
| 2005-03-11 | 10774.36 |
| 2005-03-14 | 10804.51 |
| 2005-03-15 | 10745.1 |
| 2005-03-16 | 10633.07 |
| 2005-03-17 | 10626.35 |
| 2005-03-18 | 10629.67 |
| 2005-03-21 | 10565.39 |
| 2005-03-22 | 10470.51 |
| 2005-03-23 | 10456.02 |
| 2005-03-24 | 10442.87 |
| 2005-03-28 | 10485.65 |
| 2005-03-29 | 10405.7 |
| 2005-03-30 | 10540.93 |
| 2005-03-31 | 10503.76 |
| 2005-04-01 | 10404.3 |
| 2005-04-04 | 10421.14 |
| 2005-04-05 | 10458.46 |
| 2005-04-06 | 10486.02 |
| 2005-04-07 | 10546.32 |
| 2005-04-08 | 10461.34 |
| 2005-04-11 | 10448.56 |
| 2005-04-12 | 10507.97 |
| 2005-04-13 | 10403.93 |
| 2005-04-14 | 10278.75 |
| 2005-04-15 | 10087.51 |
| 2005-04-18 | 10071.25 |
| 2005-04-19 | 10127.41 |
| 2005-04-20 | 10012.36 |
| 2005-04-21 | 10218.6 |
| 2005-04-22 | 10157.71 |
| 2005-04-25 | 10242.47 |
| 2005-04-26 | 10151.13 |
| 2005-04-27 | 10198.8 |
| 2005-04-28 | 10070.37 |
| 2005-04-29 | 10192.51 |
| 2005-05-02 | 10251.7 |
| 2005-05-03 | 10256.95 |
| 2005-05-04 | 10384.64 |
| 2005-05-05 | 10340.38 |
| 2005-05-06 | 10345.4 |
| 2005-05-09 | 10384.34 |
| 2005-05-10 | 10281.11 |
| 2005-05-11 | 10300.25 |
| 2005-05-12 | 10189.48 |
| 2005-05-13 | 10140.12 |
| 2005-05-16 | 10252.29 |
| 2005-05-17 | 10331.88 |
| 2005-05-18 | 10464.45 |
| 2005-05-19 | 10493.19 |
| 2005-05-20 | 10471.91 |
| 2005-05-23 | 10523.56 |
| 2005-05-24 | 10503.68 |
| 2005-05-25 | 10457.8 |
| 2005-05-26 | 10537.6 |
| 2005-05-27 | 10542.55 |
| 2005-05-31 | 10467.48 |
| 2005-06-01 | 10549.87 |
| 2005-06-02 | 10553.49 |
| 2005-06-03 | 10460.97 |
| 2005-06-06 | 10467.03 |
| 2005-06-07 | 10483.07 |
| 2005-06-08 | 10476.86 |
| 2005-06-09 | 10503.02 |
| 2005-06-10 | 10512.63 |
| 2005-06-13 | 10522.56 |
| 2005-06-14 | 10547.57 |
| 2005-06-15 | 10566.37 |
| 2005-06-16 | 10578.65 |
| 2005-06-17 | 10623.07 |
| 2005-06-20 | 10609.11 |
| 2005-06-21 | 10599.67 |
| 2005-06-22 | 10587.93 |
| 2005-06-23 | 10421.44 |
| 2005-06-24 | 10297.84 |
| 2005-06-27 | 10290.78 |
| 2005-06-28 | 10405.63 |
| 2005-06-29 | 10374.48 |
| 2005-06-30 | 10274.97 |
| 2005-07-01 | 10303.44 |
| 2005-07-05 | 10371.8 |
| 2005-07-06 | 10270.68 |
| 2005-07-07 | 10302.29 |
| 2005-07-08 | 10449.14 |
| 2005-07-11 | 10519.72 |
| 2005-07-12 | 10513.89 |
| 2005-07-13 | 10557.39 |
| 2005-07-14 | 10628.89 |
| 2005-07-15 | 10640.83 |
| 2005-07-18 | 10574.99 |
| 2005-07-19 | 10646.56 |
| 2005-07-20 | 10689.15 |
| 2005-07-21 | 10627.77 |
| 2005-07-22 | 10651.18 |
| 2005-07-25 | 10596.48 |
| 2005-07-26 | 10579.77 |
| 2005-07-27 | 10637.09 |
| 2005-07-28 | 10705.55 |
| 2005-07-29 | 10640.91 |
| 2005-08-01 | 10623.15 |
| 2005-08-02 | 10683.74 |
| 2005-08-03 | 10697.59 |
| 2005-08-04 | 10610.1 |
| 2005-08-05 | 10558.03 |
| 2005-08-08 | 10536.93 |
| 2005-08-09 | 10615.67 |
| 2005-08-10 | 10594.41 |
| 2005-08-11 | 10685.89 |
| 2005-08-12 | 10600.31 |
| 2005-08-15 | 10634.38 |
| 2005-08-16 | 10513.45 |
| 2005-08-17 | 10550.71 |
| 2005-08-18 | 10554.93 |
| 2005-08-19 | 10559.23 |
| 2005-08-22 | 10569.89 |
| 2005-08-23 | 10519.58 |
| 2005-08-24 | 10434.87 |
| 2005-08-25 | 10450.63 |
| 2005-08-26 | 10397.29 |
| 2005-08-29 | 10463.05 |
| 2005-08-30 | 10412.82 |
| 2005-08-31 | 10481.6 |
| 2005-09-01 | 10459.63 |
| 2005-09-02 | 10447.37 |
| 2005-09-06 | 10589.24 |
| 2005-09-07 | 10633.5 |
| 2005-09-08 | 10595.93 |
| 2005-09-09 | 10678.56 |
| 2005-09-12 | 10682.94 |
| 2005-09-13 | 10597.44 |
| 2005-09-14 | 10544.9 |
| 2005-09-15 | 10558.75 |
| 2005-09-16 | 10641.94 |
| 2005-09-19 | 10557.63 |
| 2005-09-20 | 10481.52 |
| 2005-09-21 | 10378.03 |
| 2005-09-22 | 10422.05 |
| 2005-09-23 | 10419.59 |
| 2005-09-26 | 10443.63 |
| 2005-09-27 | 10456.21 |
| 2005-09-28 | 10473.09 |
| 2005-09-29 | 10552.78 |
| 2005-09-30 | 10568.7 |
| 2005-10-03 | 10535.48 |
| 2005-10-04 | 10441.11 |
| 2005-10-05 | 10317.36 |
| 2005-10-06 | 10287.1 |
| 2005-10-07 | 10292.31 |
| 2005-10-10 | 10238.76 |
| 2005-10-11 | 10253.17 |
| 2005-10-12 | 10216.91 |
| 2005-10-13 | 10216.59 |
| 2005-10-14 | 10287.34 |
| 2005-10-17 | 10348.1 |
| 2005-10-18 | 10285.26 |
| 2005-10-19 | 10414.13 |
| 2005-10-20 | 10281.1 |
| 2005-10-21 | 10215.22 |
| 2005-10-24 | 10385 |
| 2005-10-25 | 10377.87 |
| 2005-10-26 | 10344.98 |
| 2005-10-27 | 10229.95 |
| 2005-10-28 | 10402.77 |
| 2005-10-31 | 10440.07 |
| 2005-11-01 | 10406.77 |
| 2005-11-02 | 10472.73 |
| 2005-11-03 | 10522.59 |
| 2005-11-04 | 10530.76 |
| 2005-11-07 | 10586.23 |
| 2005-11-08 | 10539.72 |
| 2005-11-09 | 10546.21 |
| 2005-11-10 | 10640.1 |
| 2005-11-11 | 10686.04 |
| 2005-11-14 | 10697.17 |
| 2005-11-15 | 10686.44 |
| 2005-11-16 | 10674.76 |
| 2005-11-17 | 10720.22 |
| 2005-11-18 | 10766.33 |
| 2005-11-21 | 10820.28 |
| 2005-11-22 | 10871.43 |
| 2005-11-23 | 10916.09 |
| 2005-11-25 | 10931.62 |
| 2005-11-28 | 10890.72 |
| 2005-11-29 | 10888.16 |
| 2005-11-30 | 10805.87 |
| 2005-12-01 | 10912.57 |
| 2005-12-02 | 10877.51 |
| 2005-12-05 | 10835.01 |
| 2005-12-06 | 10856.86 |
| 2005-12-07 | 10810.91 |
| 2005-12-08 | 10755.12 |
| 2005-12-09 | 10778.58 |
| 2005-12-12 | 10767.77 |
| 2005-12-13 | 10823.72 |
| 2005-12-14 | 10883.51 |
| 2005-12-15 | 10881.67 |
| 2005-12-16 | 10875.59 |
| 2005-12-19 | 10836.53 |
| 2005-12-20 | 10805.55 |
| 2005-12-21 | 10833.73 |
| 2005-12-22 | 10889.44 |
| 2005-12-23 | 10883.27 |
| 2005-12-27 | 10777.77 |
| 2005-12-28 | 10796.26 |
| 2005-12-29 | 10784.82 |
| 2005-12-30 | 10717.5 |
| 2006-01-03 | 10847.41 |
| 2006-01-04 | 10880.15 |
| 2006-01-05 | 10882.15 |
| 2006-01-06 | 10959.31 |
| 2006-01-09 | 11011.9 |
| 2006-01-10 | 11011.58 |
| 2006-01-11 | 11043.44 |
| 2006-01-12 | 10962.36 |
| 2006-01-13 | 10959.87 |
| 2006-01-17 | 10896.32 |
| 2006-01-18 | 10854.86 |
| 2006-01-19 | 10880.71 |
| 2006-01-20 | 10667.39 |
| 2006-01-23 | 10688.77 |
| 2006-01-24 | 10712.22 |
| 2006-01-25 | 10709.74 |
| 2006-01-26 | 10809.47 |
| 2006-01-27 | 10907.21 |
| 2006-01-30 | 10899.92 |
| 2006-01-31 | 10864.86 |
| 2006-02-01 | 10953.95 |
| 2006-02-02 | 10851.98 |
| 2006-02-03 | 10793.62 |
| 2006-02-06 | 10798.27 |
| 2006-02-07 | 10749.76 |
| 2006-02-08 | 10858.62 |
| 2006-02-09 | 10883.35 |
| 2006-02-10 | 10919.05 |
| 2006-02-13 | 10892.32 |
| 2006-02-14 | 11028.39 |
| 2006-02-15 | 11058.97 |
| 2006-02-16 | 11120.68 |
| 2006-02-17 | 11115.32 |
| 2006-02-21 | 11069.06 |
| 2006-02-22 | 11137.17 |
| 2006-02-23 | 11069.22 |
| 2006-02-24 | 11061.85 |
| 2006-02-27 | 11097.55 |
| 2006-02-28 | 10993.41 |
| 2006-03-01 | 11053.53 |
| 2006-03-02 | 11025.51 |
| 2006-03-03 | 11021.59 |
| 2006-03-06 | 10958.59 |
| 2006-03-07 | 10980.69 |
| 2006-03-08 | 11005.74 |
| 2006-03-09 | 10972.28 |
| 2006-03-10 | 11076.34 |
| 2006-03-13 | 11076.02 |
| 2006-03-14 | 11151.34 |
| 2006-03-15 | 11209.77 |
| 2006-03-16 | 11253.24 |
| 2006-03-17 | 11279.65 |
| 2006-03-20 | 11274.53 |
| 2006-03-21 | 11235.47 |
| 2006-03-22 | 11317.43 |
| 2006-03-23 | 11270.29 |
| 2006-03-24 | 11279.97 |
| 2006-03-27 | 11250.11 |
| 2006-03-28 | 11154.54 |
| 2006-03-29 | 11215.7 |
| 2006-03-30 | 11150.7 |
| 2006-03-31 | 11109.32 |
| 2006-04-03 | 11144.94 |
| 2006-04-04 | 11203.85 |
| 2006-04-05 | 11239.55 |
| 2006-04-06 | 11216.5 |
| 2006-04-07 | 11120.04 |
| 2006-04-10 | 11141.33 |
| 2006-04-11 | 11089.63 |
| 2006-04-12 | 11129.97 |
| 2006-04-13 | 11137.65 |
| 2006-04-17 | 11073.78 |
| 2006-04-18 | 11268.77 |
| 2006-04-19 | 11278.77 |
| 2006-04-20 | 11342.89 |
| 2006-04-21 | 11347.45 |
| 2006-04-24 | 11336.32 |
| 2006-04-25 | 11283.25 |
| 2006-04-26 | 11354.49 |
| 2006-04-27 | 11382.51 |
| 2006-04-28 | 11367.14 |
| 2006-05-01 | 11343.29 |
| 2006-05-02 | 11416.45 |
| 2006-05-03 | 11400.28 |
| 2006-05-04 | 11438.86 |
| 2006-05-05 | 11577.74 |
| 2006-05-08 | 11584.54 |
| 2006-05-09 | 11639.77 |
| 2006-05-10 | 11642.65 |
| 2006-05-11 | 11500.73 |
| 2006-05-12 | 11380.99 |
| 2006-05-15 | 11428.77 |
| 2006-05-16 | 11419.89 |
| 2006-05-17 | 11205.61 |
| 2006-05-18 | 11128.29 |
| 2006-05-19 | 11144.06 |
| 2006-05-22 | 11125.33 |
| 2006-05-23 | 11098.35 |
| 2006-05-24 | 11117.32 |
| 2006-05-25 | 11211.05 |
| 2006-05-26 | 11278.61 |
| 2006-05-30 | 11094.43 |
| 2006-05-31 | 11168.31 |
| 2006-06-01 | 11260.28 |
| 2006-06-02 | 11247.87 |
| 2006-06-05 | 11048.72 |
| 2006-06-06 | 11002.14 |
| 2006-06-07 | 10930.9 |
| 2006-06-08 | 10938.82 |
| 2006-06-09 | 10891.92 |
| 2006-06-12 | 10792.58 |
| 2006-06-13 | 10706.14 |
| 2006-06-14 | 10816.92 |
| 2006-06-15 | 11015.19 |
| 2006-06-16 | 11014.55 |
| 2006-06-19 | 10942.11 |
| 2006-06-20 | 10974.84 |
| 2006-06-21 | 11079.46 |
| 2006-06-22 | 11019.11 |
| 2006-06-23 | 10989.09 |
| 2006-06-26 | 11045.28 |
| 2006-06-27 | 10924.74 |
| 2006-06-28 | 10973.56 |
| 2006-06-29 | 11190.8 |
| 2006-06-30 | 11150.22 |
| 2006-07-03 | 11228.02 |
| 2006-07-05 | 11151.82 |
| 2006-07-06 | 11225.3 |
| 2006-07-07 | 11090.67 |
| 2006-07-10 | 11103.55 |
| 2006-07-11 | 11134.77 |
| 2006-07-12 | 11013.18 |
| 2006-07-13 | 10846.29 |
| 2006-07-14 | 10739.35 |
| 2006-07-17 | 10747.36 |
| 2006-07-18 | 10799.23 |
| 2006-07-19 | 11011.42 |
| 2006-07-20 | 10928.1 |
| 2006-07-21 | 10868.38 |
| 2006-07-24 | 11051.05 |
| 2006-07-25 | 11103.71 |
| 2006-07-26 | 11102.51 |
| 2006-07-27 | 11100.43 |
| 2006-07-28 | 11219.7 |
| 2006-07-31 | 11185.68 |
| 2006-08-01 | 11125.73 |
| 2006-08-02 | 11199.93 |
| 2006-08-03 | 11242.59 |
| 2006-08-04 | 11240.35 |
| 2006-08-07 | 11219.38 |
| 2006-08-08 | 11173.59 |
| 2006-08-09 | 11076.18 |
| 2006-08-10 | 11124.37 |
| 2006-08-11 | 11088.03 |
| 2006-08-14 | 11097.87 |
| 2006-08-15 | 11230.26 |
| 2006-08-16 | 11327.12 |
| 2006-08-17 | 11334.96 |
| 2006-08-18 | 11381.47 |
| 2006-08-21 | 11345.05 |
| 2006-08-22 | 11339.84 |
| 2006-08-23 | 11297.9 |
| 2006-08-24 | 11304.46 |
| 2006-08-25 | 11284.05 |
| 2006-08-28 | 11352.01 |
| 2006-08-29 | 11369.94 |
| 2006-08-30 | 11382.91 |
| 2006-08-31 | 11381.15 |
| 2006-09-01 | 11464.15 |
| 2006-09-05 | 11469.28 |
| 2006-09-06 | 11406.2 |
| 2006-09-07 | 11331.44 |
| 2006-09-08 | 11392.11 |
| 2006-09-11 | 11396.84 |
| 2006-09-12 | 11498.09 |
| 2006-09-13 | 11543.32 |
| 2006-09-14 | 11527.39 |
| 2006-09-15 | 11560.77 |
| 2006-09-18 | 11555 |
| 2006-09-19 | 11540.91 |
| 2006-09-20 | 11613.19 |
| 2006-09-21 | 11533.23 |
| 2006-09-22 | 11508.1 |
| 2006-09-25 | 11575.81 |
| 2006-09-26 | 11669.39 |
| 2006-09-27 | 11689.24 |
| 2006-09-28 | 11718.45 |
| 2006-09-29 | 11679.07 |
| 2006-10-02 | 11670.35 |
| 2006-10-03 | 11727.34 |
| 2006-10-04 | 11850.61 |
| 2006-10-05 | 11866.69 |
| 2006-10-06 | 11850.21 |
| 2006-10-09 | 11857.81 |
| 2006-10-10 | 11867.17 |
| 2006-10-11 | 11852.13 |
| 2006-10-12 | 11947.7 |
| 2006-10-13 | 11960.51 |
| 2006-10-16 | 11980.6 |
| 2006-10-17 | 11950.02 |
| 2006-10-18 | 11992.68 |
| 2006-10-19 | 12011.73 |
| 2006-10-20 | 12002.37 |
| 2006-10-23 | 12116.91 |
| 2006-10-24 | 12127.88 |
| 2006-10-25 | 12134.68 |
| 2006-10-26 | 12163.66 |
| 2006-10-27 | 12090.26 |
| 2006-10-30 | 12086.5 |
| 2006-10-31 | 12080.73 |
| 2006-11-01 | 12031.02 |
| 2006-11-02 | 12018.54 |
| 2006-11-03 | 11986.04 |
| 2006-11-06 | 12105.55 |
| 2006-11-07 | 12156.77 |
| 2006-11-08 | 12176.54 |
| 2006-11-09 | 12103.3 |
| 2006-11-10 | 12108.43 |
| 2006-11-13 | 12131.88 |
| 2006-11-14 | 12218.01 |
| 2006-11-15 | 12251.71 |
| 2006-11-16 | 12305.82 |
| 2006-11-17 | 12342.56 |
| 2006-11-20 | 12316.54 |
| 2006-11-21 | 12321.59 |
| 2006-11-22 | 12326.95 |
| 2006-11-24 | 12280.17 |
| 2006-11-27 | 12121.71 |
| 2006-11-28 | 12136.45 |
| 2006-11-29 | 12226.73 |
| 2006-11-30 | 12221.93 |
| 2006-12-01 | 12194.13 |
| 2006-12-04 | 12283.85 |
| 2006-12-05 | 12331.6 |
| 2006-12-06 | 12309.25 |
| 2006-12-07 | 12278.41 |
| 2006-12-08 | 12307.49 |
| 2006-12-11 | 12328.48 |
| 2006-12-12 | 12315.58 |
| 2006-12-13 | 12317.5 |
| 2006-12-14 | 12416.76 |
| 2006-12-15 | 12445.52 |
| 2006-12-18 | 12441.27 |
| 2006-12-19 | 12471.32 |
| 2006-12-20 | 12463.87 |
| 2006-12-21 | 12421.25 |
| 2006-12-22 | 12343.22 |
| 2006-12-26 | 12407.63 |
| 2006-12-27 | 12510.57 |
| 2006-12-28 | 12501.52 |
| 2006-12-29 | 12463.15 |
| 2007-01-03 | 12474.52 |
| 2007-01-04 | 12480.69 |
| 2007-01-05 | 12398.01 |
| 2007-01-08 | 12423.49 |
| 2007-01-09 | 12416.6 |
| 2007-01-10 | 12442.16 |
| 2007-01-11 | 12514.98 |
| 2007-01-12 | 12556.08 |
| 2007-01-16 | 12582.59 |
| 2007-01-17 | 12577.15 |
| 2007-01-18 | 12567.93 |
| 2007-01-19 | 12565.53 |
| 2007-01-22 | 12477.16 |
| 2007-01-23 | 12533.8 |
| 2007-01-24 | 12621.77 |
| 2007-01-25 | 12502.56 |
| 2007-01-26 | 12487.02 |
| 2007-01-29 | 12490.78 |
| 2007-01-30 | 12523.31 |
| 2007-01-31 | 12621.69 |
| 2007-02-01 | 12673.68 |
| 2007-02-02 | 12653.49 |
| 2007-02-05 | 12661.74 |
| 2007-02-06 | 12666.31 |
| 2007-02-07 | 12666.87 |
| 2007-02-08 | 12637.63 |
| 2007-02-09 | 12580.83 |
| 2007-02-12 | 12552.55 |
| 2007-02-13 | 12654.85 |
| 2007-02-14 | 12741.86 |
| 2007-02-15 | 12765.01 |
| 2007-02-16 | 12767.57 |
| 2007-02-20 | 12786.64 |
| 2007-02-21 | 12738.41 |
| 2007-02-22 | 12686.02 |
| 2007-02-23 | 12647.48 |
| 2007-02-26 | 12632.26 |
| 2007-02-27 | 12216.24 |
| 2007-02-28 | 12268.63 |
| 2007-03-01 | 12234.34 |
| 2007-03-02 | 12114.1 |
| 2007-03-05 | 12050.41 |
| 2007-03-06 | 12207.59 |
| 2007-03-07 | 12192.45 |
| 2007-03-08 | 12260.7 |
| 2007-03-09 | 12276.32 |
| 2007-03-12 | 12318.62 |
| 2007-03-13 | 12075.96 |
| 2007-03-14 | 12133.4 |
| 2007-03-15 | 12159.68 |
| 2007-03-16 | 12110.41 |
| 2007-03-19 | 12226.17 |
| 2007-03-20 | 12288.1 |
| 2007-03-21 | 12447.52 |
| 2007-03-22 | 12461.14 |
| 2007-03-23 | 12481.01 |
| 2007-03-26 | 12469.07 |
| 2007-03-27 | 12397.29 |
| 2007-03-28 | 12300.36 |
| 2007-03-29 | 12348.75 |
| 2007-03-30 | 12354.35 |
| 2007-04-02 | 12382.3 |
| 2007-04-03 | 12510.3 |
| 2007-04-04 | 12530.05 |
| 2007-04-05 | 12560.2 |
| 2007-04-09 | 12569.14 |
| 2007-04-10 | 12573.85 |
| 2007-04-11 | 12484.62 |
| 2007-04-12 | 12552.96 |
| 2007-04-13 | 12612.13 |
| 2007-04-16 | 12720.46 |
| 2007-04-17 | 12773.04 |
| 2007-04-18 | 12803.84 |
| 2007-04-19 | 12808.63 |
| 2007-04-20 | 12961.98 |
| 2007-04-23 | 12919.4 |
| 2007-04-24 | 12953.94 |
| 2007-04-25 | 13089.89 |
| 2007-04-26 | 13105.5 |
| 2007-04-27 | 13120.94 |
| 2007-04-30 | 13062.91 |
| 2007-05-01 | 13136.14 |
| 2007-05-02 | 13211.88 |
| 2007-05-03 | 13241.38 |
| 2007-05-04 | 13264.62 |
| 2007-05-07 | 13312.97 |
| 2007-05-08 | 13309.07 |
| 2007-05-09 | 13362.87 |
| 2007-05-10 | 13215.13 |
| 2007-05-11 | 13326.22 |
| 2007-05-14 | 13346.78 |
| 2007-05-15 | 13383.84 |
| 2007-05-16 | 13487.53 |
| 2007-05-17 | 13476.72 |
| 2007-05-18 | 13556.53 |
| 2007-05-21 | 13542.88 |
| 2007-05-22 | 13539.95 |
| 2007-05-23 | 13525.65 |
| 2007-05-24 | 13441.13 |
| 2007-05-25 | 13507.28 |
| 2007-05-29 | 13521.34 |
| 2007-05-30 | 13633.08 |
| 2007-05-31 | 13627.64 |
| 2007-06-01 | 13668.11 |
| 2007-06-04 | 13676.32 |
| 2007-06-05 | 13595.46 |
| 2007-06-06 | 13465.67 |
| 2007-06-07 | 13266.73 |
| 2007-06-08 | 13424.39 |
| 2007-06-11 | 13424.96 |
| 2007-06-12 | 13295.01 |
| 2007-06-13 | 13482.35 |
| 2007-06-14 | 13553.72 |
| 2007-06-15 | 13639.48 |
| 2007-06-18 | 13612.98 |
| 2007-06-19 | 13635.42 |
| 2007-06-20 | 13489.42 |
| 2007-06-21 | 13545.84 |
| 2007-06-22 | 13360.26 |
| 2007-06-25 | 13352.05 |
| 2007-06-26 | 13337.66 |
| 2007-06-27 | 13427.73 |
| 2007-06-28 | 13422.28 |
| 2007-06-29 | 13408.62 |
| 2007-07-02 | 13535.43 |
| 2007-07-03 | 13577.3 |
| 2007-07-05 | 13565.84 |
| 2007-07-06 | 13611.68 |
| 2007-07-09 | 13649.97 |
| 2007-07-10 | 13501.7 |
| 2007-07-11 | 13577.87 |
| 2007-07-12 | 13861.73 |
| 2007-07-13 | 13907.25 |
| 2007-07-16 | 13950.98 |
| 2007-07-17 | 13971.55 |
| 2007-07-18 | 13918.22 |
| 2007-07-19 | 14000.41 |
| 2007-07-20 | 13851.08 |
| 2007-07-23 | 13943.42 |
| 2007-07-24 | 13716.95 |
| 2007-07-25 | 13785.07 |
| 2007-07-26 | 13473.57 |
| 2007-07-27 | 13265.47 |
| 2007-07-30 | 13358.31 |
| 2007-07-31 | 13211.99 |
| 2007-08-01 | 13362.37 |
| 2007-08-02 | 13463.33 |
| 2007-08-03 | 13181.91 |
| 2007-08-06 | 13468.78 |
| 2007-08-07 | 13504.3 |
| 2007-08-08 | 13657.86 |
| 2007-08-09 | 13270.68 |
| 2007-08-10 | 13239.54 |
| 2007-08-13 | 13236.53 |
| 2007-08-14 | 13028.92 |
| 2007-08-15 | 12861.47 |
| 2007-08-16 | 12845.78 |
| 2007-08-17 | 13079.08 |
| 2007-08-20 | 13121.35 |
| 2007-08-21 | 13090.86 |
| 2007-08-22 | 13236.13 |
| 2007-08-23 | 13235.88 |
| 2007-08-24 | 13378.87 |
| 2007-08-27 | 13322.13 |
| 2007-08-28 | 13041.85 |
| 2007-08-29 | 13289.29 |
| 2007-08-30 | 13238.73 |
| 2007-08-31 | 13357.74 |
| 2007-09-04 | 13448.86 |
| 2007-09-05 | 13305.47 |
| 2007-09-06 | 13363.35 |
| 2007-09-07 | 13113.38 |
| 2007-09-10 | 13127.85 |
| 2007-09-11 | 13308.39 |
| 2007-09-12 | 13291.65 |
| 2007-09-13 | 13424.88 |
| 2007-09-14 | 13442.52 |
| 2007-09-17 | 13403.42 |
| 2007-09-18 | 13739.39 |
| 2007-09-19 | 13815.56 |
| 2007-09-20 | 13766.7 |
| 2007-09-21 | 13820.19 |
| 2007-09-24 | 13759.06 |
| 2007-09-25 | 13778.65 |
| 2007-09-26 | 13878.15 |
| 2007-09-27 | 13912.94 |
| 2007-09-28 | 13895.63 |
| 2007-10-01 | 14087.55 |
| 2007-10-02 | 14047.31 |
| 2007-10-03 | 13968.05 |
| 2007-10-04 | 13974.31 |
| 2007-10-05 | 14066.01 |
| 2007-10-08 | 14043.73 |
| 2007-10-09 | 14164.53 |
| 2007-10-10 | 14078.69 |
| 2007-10-11 | 14015.12 |
| 2007-10-12 | 14093.08 |
| 2007-10-15 | 13984.8 |
| 2007-10-16 | 13912.94 |
| 2007-10-17 | 13892.54 |
| 2007-10-18 | 13888.96 |
| 2007-10-19 | 13522.02 |
| 2007-10-22 | 13566.97 |
| 2007-10-23 | 13676.23 |
| 2007-10-24 | 13675.25 |
| 2007-10-25 | 13671.92 |
| 2007-10-26 | 13806.7 |
| 2007-10-29 | 13870.26 |
| 2007-10-30 | 13792.47 |
| 2007-10-31 | 13930.01 |
| 2007-11-01 | 13567.87 |
| 2007-11-02 | 13595.1 |
| 2007-11-05 | 13543.4 |
| 2007-11-06 | 13660.94 |
| 2007-11-07 | 13300.02 |
| 2007-11-08 | 13266.29 |
| 2007-11-09 | 13042.74 |
| 2007-11-12 | 12987.55 |
| 2007-11-13 | 13307.09 |
| 2007-11-14 | 13231.01 |
| 2007-11-15 | 13110.05 |
| 2007-11-16 | 13176.79 |
| 2007-11-19 | 12958.44 |
| 2007-11-20 | 13010.14 |
| 2007-11-21 | 12799.04 |
| 2007-11-23 | 12980.88 |
| 2007-11-26 | 12743.44 |
| 2007-11-27 | 12958.44 |
| 2007-11-28 | 13289.45 |
| 2007-11-29 | 13311.73 |
| 2007-11-30 | 13371.72 |
| 2007-12-03 | 13314.57 |
| 2007-12-04 | 13248.73 |
| 2007-12-05 | 13444.96 |
| 2007-12-06 | 13619.89 |
| 2007-12-07 | 13625.58 |
| 2007-12-10 | 13727.03 |
| 2007-12-11 | 13432.77 |
| 2007-12-12 | 13473.9 |
| 2007-12-13 | 13517.96 |
| 2007-12-14 | 13339.85 |
| 2007-12-17 | 13167.2 |
| 2007-12-18 | 13232.47 |
| 2007-12-19 | 13207.27 |
| 2007-12-20 | 13245.64 |
| 2007-12-21 | 13450.65 |
| 2007-12-24 | 13549.33 |
| 2007-12-26 | 13551.69 |
| 2007-12-27 | 13359.61 |
| 2007-12-28 | 13365.87 |
| 2007-12-31 | 13264.82 |
| 2008-01-02 | 13043.96 |
| 2008-01-03 | 13056.72 |
| 2008-01-04 | 12800.18 |
| 2008-01-07 | 12827.49 |
| 2008-01-08 | 12589.07 |
| 2008-01-09 | 12735.31 |
| 2008-01-10 | 12853.09 |
| 2008-01-11 | 12606.3 |
| 2008-01-14 | 12778.15 |
| 2008-01-15 | 12501.11 |
| 2008-01-16 | 12466.16 |
| 2008-01-17 | 12159.21 |
| 2008-01-18 | 12099.3 |
| 2008-01-22 | 11971.19 |
| 2008-01-23 | 12270.17 |
| 2008-01-24 | 12378.61 |
| 2008-01-25 | 12207.17 |
| 2008-01-28 | 12383.89 |
| 2008-01-29 | 12480.3 |
| 2008-01-30 | 12442.83 |
| 2008-01-31 | 12650.36 |
| 2008-02-01 | 12743.19 |
| 2008-02-04 | 12635.16 |
| 2008-02-05 | 12265.13 |
| 2008-02-06 | 12200.1 |
| 2008-02-07 | 12247 |
| 2008-02-08 | 12182.13 |
| 2008-02-11 | 12240.01 |
| 2008-02-12 | 12373.41 |
| 2008-02-13 | 12552.24 |
| 2008-02-14 | 12376.98 |
| 2008-02-15 | 12348.21 |
| 2008-02-19 | 12337.22 |
| 2008-02-20 | 12427.26 |
| 2008-02-21 | 12284.3 |
| 2008-02-22 | 12381.02 |
| 2008-02-25 | 12570.22 |
| 2008-02-26 | 12684.92 |
| 2008-02-27 | 12694.28 |
| 2008-02-28 | 12582.18 |
| 2008-02-29 | 12266.39 |
| 2008-03-03 | 12258.9 |
| 2008-03-04 | 12213.8 |
| 2008-03-05 | 12254.99 |
| 2008-03-06 | 12040.39 |
| 2008-03-07 | 11893.69 |
| 2008-03-10 | 11740.15 |
| 2008-03-11 | 12156.81 |
| 2008-03-12 | 12110.24 |
| 2008-03-13 | 12145.74 |
| 2008-03-14 | 11951.09 |
| 2008-03-17 | 11972.25 |
| 2008-03-18 | 12392.66 |
| 2008-03-19 | 12099.66 |
| 2008-03-20 | 12361.32 |
| 2008-03-24 | 12548.64 |
| 2008-03-25 | 12532.6 |
| 2008-03-26 | 12422.86 |
| 2008-03-27 | 12302.46 |
| 2008-03-28 | 12216.4 |
| 2008-03-31 | 12262.89 |
| 2008-04-01 | 12654.36 |
| 2008-04-02 | 12605.83 |
| 2008-04-03 | 12626.03 |
| 2008-04-04 | 12609.42 |
| 2008-04-07 | 12612.43 |
| 2008-04-08 | 12576.44 |
| 2008-04-09 | 12527.26 |
| 2008-04-10 | 12581.98 |
| 2008-04-11 | 12325.42 |
| 2008-04-14 | 12302.06 |
| 2008-04-15 | 12362.47 |
| 2008-04-16 | 12619.27 |
| 2008-04-17 | 12620.49 |
| 2008-04-18 | 12849.36 |
| 2008-04-21 | 12825.02 |
| 2008-04-22 | 12720.23 |
| 2008-04-23 | 12763.22 |
| 2008-04-24 | 12848.95 |
| 2008-04-25 | 12891.86 |
| 2008-04-28 | 12871.75 |
| 2008-04-29 | 12831.94 |
| 2008-04-30 | 12820.13 |
| 2008-05-01 | 13010 |
| 2008-05-02 | 13058.2 |
| 2008-05-05 | 12969.54 |
| 2008-05-06 | 13020.83 |
| 2008-05-07 | 12814.35 |
| 2008-05-08 | 12866.78 |
| 2008-05-09 | 12745.88 |
| 2008-05-12 | 12876.31 |
| 2008-05-13 | 12832.18 |
| 2008-05-14 | 12898.38 |
| 2008-05-15 | 12992.66 |
| 2008-05-16 | 12986.8 |
| 2008-05-19 | 13028.16 |
| 2008-05-20 | 12828.68 |
| 2008-05-21 | 12601.19 |
| 2008-05-22 | 12625.62 |
| 2008-05-23 | 12479.63 |
| 2008-05-27 | 12548.35 |
| 2008-05-28 | 12594.03 |
| 2008-05-29 | 12646.22 |
| 2008-05-30 | 12638.32 |
| 2008-06-02 | 12503.82 |
| 2008-06-03 | 12402.85 |
| 2008-06-04 | 12390.48 |
| 2008-06-05 | 12604.45 |
| 2008-06-06 | 12209.81 |
| 2008-06-09 | 12280.32 |
| 2008-06-10 | 12289.76 |
| 2008-06-11 | 12083.77 |
| 2008-06-12 | 12141.58 |
| 2008-06-13 | 12307.35 |
| 2008-06-16 | 12269.08 |
| 2008-06-17 | 12160.3 |
| 2008-06-18 | 12029.06 |
| 2008-06-19 | 12063.09 |
| 2008-06-20 | 11842.69 |
| 2008-06-23 | 11842.36 |
| 2008-06-24 | 11807.43 |
| 2008-06-25 | 11811.83 |
| 2008-06-26 | 11453.42 |
| 2008-06-27 | 11346.51 |
| 2008-06-30 | 11350.01 |
| 2008-07-01 | 11382.26 |
| 2008-07-02 | 11215.51 |
| 2008-07-03 | 11288.54 |
| 2008-07-07 | 11231.96 |
| 2008-07-08 | 11384.21 |
| 2008-07-09 | 11147.44 |
| 2008-07-10 | 11229.02 |
| 2008-07-11 | 11100.54 |
| 2008-07-14 | 11055.19 |
| 2008-07-15 | 10962.54 |
| 2008-07-16 | 11239.28 |
| 2008-07-17 | 11446.66 |
| 2008-07-18 | 11496.57 |
| 2008-07-21 | 11467.34 |
| 2008-07-22 | 11602.5 |
| 2008-07-23 | 11632.38 |
| 2008-07-24 | 11349.28 |
| 2008-07-25 | 11370.69 |
| 2008-07-28 | 11131.08 |
| 2008-07-29 | 11397.56 |
| 2008-07-30 | 11583.69 |
| 2008-07-31 | 11378.02 |
| 2008-08-01 | 11326.32 |
| 2008-08-04 | 11284.15 |
| 2008-08-05 | 11615.77 |
| 2008-08-06 | 11656.07 |
| 2008-08-07 | 11431.43 |
| 2008-08-08 | 11734.32 |
| 2008-08-11 | 11782.35 |
| 2008-08-12 | 11642.47 |
| 2008-08-13 | 11532.96 |
| 2008-08-14 | 11615.93 |
| 2008-08-15 | 11659.9 |
| 2008-08-18 | 11479.39 |
| 2008-08-19 | 11348.55 |
| 2008-08-20 | 11417.43 |
| 2008-08-21 | 11430.21 |
| 2008-08-22 | 11628.06 |
| 2008-08-25 | 11386.25 |
| 2008-08-26 | 11412.87 |
| 2008-08-27 | 11502.51 |
| 2008-08-28 | 11715.15 |
| 2008-08-29 | 11543.55 |
| 2008-09-02 | 11516.92 |
| 2008-09-03 | 11532.88 |
| 2008-09-04 | 11188.23 |
| 2008-09-05 | 11220.96 |
| 2008-09-08 | 11510.74 |
| 2008-09-09 | 11230.73 |
| 2008-09-10 | 11268.92 |
| 2008-09-11 | 11433.71 |
| 2008-09-12 | 11421.99 |
| 2008-09-15 | 10917.51 |
| 2008-09-16 | 11059.02 |
| 2008-09-17 | 10609.66 |
| 2008-09-18 | 11019.69 |
| 2008-09-19 | 11388.44 |
| 2008-09-22 | 11015.69 |
| 2008-09-23 | 10854.17 |
| 2008-09-24 | 10825.17 |
| 2008-09-25 | 11022.06 |
| 2008-09-26 | 11143.13 |
| 2008-09-29 | 10365.45 |
| 2008-09-30 | 10850.66 |
| 2008-10-01 | 10831.07 |
| 2008-10-02 | 10482.85 |
| 2008-10-03 | 10325.38 |
| 2008-10-06 | 9955.5 |
| 2008-10-07 | 9447.11 |
| 2008-10-08 | 9258.1 |
| 2008-10-09 | 8579.19 |
| 2008-10-10 | 8451.19 |
| 2008-10-13 | 9387.61 |
| 2008-10-14 | 9310.99 |
| 2008-10-15 | 8577.91 |
| 2008-10-16 | 8979.26 |
| 2008-10-17 | 8852.22 |
| 2008-10-20 | 9265.43 |
| 2008-10-21 | 9033.66 |
| 2008-10-22 | 8519.21 |
| 2008-10-23 | 8691.25 |
| 2008-10-24 | 8378.95 |
| 2008-10-27 | 8175.77 |
| 2008-10-28 | 9065.12 |
| 2008-10-29 | 8990.96 |
| 2008-10-30 | 9180.69 |
| 2008-10-31 | 9325.01 |
| 2008-11-03 | 9319.83 |
| 2008-11-04 | 9625.28 |
| 2008-11-05 | 9139.27 |
| 2008-11-06 | 8695.79 |
| 2008-11-07 | 8943.81 |
| 2008-11-10 | 8870.54 |
| 2008-11-11 | 8693.96 |
| 2008-11-12 | 8282.66 |
| 2008-11-13 | 8835.25 |
| 2008-11-14 | 8497.31 |
| 2008-11-17 | 8273.58 |
| 2008-11-18 | 8424.75 |
| 2008-11-19 | 7997.28 |
| 2008-11-20 | 7552.29 |
| 2008-11-21 | 8046.42 |
| 2008-11-24 | 8443.39 |
| 2008-11-25 | 8479.47 |
| 2008-11-26 | 8726.61 |
| 2008-11-28 | 8829.04 |
| 2008-12-01 | 8149.09 |
| 2008-12-02 | 8419.09 |
| 2008-12-03 | 8591.69 |
| 2008-12-04 | 8376.24 |
| 2008-12-05 | 8635.42 |
| 2008-12-08 | 8934.18 |
| 2008-12-09 | 8691.33 |
| 2008-12-10 | 8761.42 |
| 2008-12-11 | 8565.09 |
| 2008-12-12 | 8629.68 |
| 2008-12-15 | 8564.53 |
| 2008-12-16 | 8924.14 |
| 2008-12-17 | 8824.34 |
| 2008-12-18 | 8604.99 |
| 2008-12-19 | 8579.11 |
| 2008-12-22 | 8519.77 |
| 2008-12-23 | 8419.49 |
| 2008-12-24 | 8468.48 |
| 2008-12-26 | 8515.55 |
| 2008-12-29 | 8483.93 |
| 2008-12-30 | 8668.39 |
| 2008-12-31 | 8776.39 |
| 2009-01-02 | 9034.69 |
| 2009-01-05 | 8952.89 |
| 2009-01-06 | 9015.1 |
| 2009-01-07 | 8769.7 |
| 2009-01-08 | 8742.46 |
| 2009-01-09 | 8599.18 |
| 2009-01-12 | 8473.97 |
| 2009-01-13 | 8448.56 |
| 2009-01-14 | 8200.14 |
| 2009-01-15 | 8212.49 |
| 2009-01-16 | 8281.22 |
| 2009-01-20 | 7949.09 |
| 2009-01-21 | 8228.1 |
| 2009-01-22 | 8122.8 |
| 2009-01-23 | 8077.56 |
| 2009-01-26 | 8116.03 |
| 2009-01-27 | 8174.73 |
| 2009-01-28 | 8375.45 |
| 2009-01-29 | 8149.01 |
| 2009-01-30 | 8000.86 |
| 2009-02-02 | 7936.83 |
| 2009-02-03 | 8078.36 |
| 2009-02-04 | 7956.66 |
| 2009-02-05 | 8063.07 |
| 2009-02-06 | 8280.59 |
| 2009-02-09 | 8270.87 |
| 2009-02-10 | 7888.88 |
| 2009-02-11 | 7939.53 |
| 2009-02-12 | 7932.76 |
| 2009-02-13 | 7850.41 |
| 2009-02-17 | 7552.6 |
| 2009-02-18 | 7555.63 |
| 2009-02-19 | 7465.95 |
| 2009-02-20 | 7365.67 |
| 2009-02-23 | 7114.78 |
| 2009-02-24 | 7350.94 |
| 2009-02-25 | 7270.89 |
| 2009-02-26 | 7182.08 |
| 2009-02-27 | 7062.93 |
| 2009-03-02 | 6763.29 |
| 2009-03-03 | 6726.02 |
| 2009-03-04 | 6875.84 |
| 2009-03-05 | 6594.44 |
| 2009-03-06 | 6626.94 |
| 2009-03-09 | 6547.05 |
| 2009-03-10 | 6926.49 |
| 2009-03-11 | 6930.4 |
| 2009-03-12 | 7170.06 |
| 2009-03-13 | 7223.98 |
| 2009-03-16 | 7216.97 |
| 2009-03-17 | 7395.7 |
| 2009-03-18 | 7486.58 |
| 2009-03-19 | 7400.8 |
| 2009-03-20 | 7278.38 |
| 2009-03-23 | 7775.86 |
| 2009-03-24 | 7659.97 |
| 2009-03-25 | 7749.81 |
| 2009-03-26 | 7924.56 |
| 2009-03-27 | 7776.18 |
| 2009-03-30 | 7522.02 |
| 2009-03-31 | 7608.92 |
| 2009-04-01 | 7761.6 |
| 2009-04-02 | 7978.08 |
| 2009-04-03 | 8017.59 |
| 2009-04-06 | 7975.85 |
| 2009-04-07 | 7789.56 |
| 2009-04-08 | 7837.11 |
| 2009-04-09 | 8083.38 |
| 2009-04-13 | 8057.81 |
| 2009-04-14 | 7920.18 |
| 2009-04-15 | 8029.62 |
| 2009-04-16 | 8125.43 |
| 2009-04-17 | 8131.33 |
| 2009-04-20 | 7841.73 |
| 2009-04-21 | 7969.56 |
| 2009-04-22 | 7886.57 |
| 2009-04-23 | 7957.06 |
| 2009-04-24 | 8076.29 |
| 2009-04-27 | 8025 |
| 2009-04-28 | 8016.95 |
| 2009-04-29 | 8185.73 |
| 2009-04-30 | 8168.12 |
| 2009-05-01 | 8212.41 |
| 2009-05-04 | 8426.74 |
| 2009-05-05 | 8410.65 |
| 2009-05-06 | 8512.28 |
| 2009-05-07 | 8409.85 |
| 2009-05-08 | 8574.65 |
| 2009-05-11 | 8418.77 |
| 2009-05-12 | 8469.11 |
| 2009-05-13 | 8284.89 |
| 2009-05-14 | 8331.32 |
| 2009-05-15 | 8268.64 |
| 2009-05-18 | 8504.08 |
| 2009-05-19 | 8474.85 |
| 2009-05-20 | 8422.04 |
| 2009-05-21 | 8292.13 |
| 2009-05-22 | 8277.32 |
| 2009-05-26 | 8473.49 |
| 2009-05-27 | 8300.02 |
| 2009-05-28 | 8403.8 |
| 2009-05-29 | 8500.33 |
| 2009-06-01 | 8721.44 |
| 2009-06-02 | 8740.87 |
| 2009-06-03 | 8675.28 |
| 2009-06-04 | 8750.24 |
| 2009-06-05 | 8763.13 |
| 2009-06-08 | 8764.49 |
| 2009-06-09 | 8763.06 |
| 2009-06-10 | 8739.02 |
| 2009-06-11 | 8770.92 |
| 2009-06-12 | 8799.26 |
| 2009-06-15 | 8612.13 |
| 2009-06-16 | 8504.67 |
| 2009-06-17 | 8497.18 |
| 2009-06-18 | 8555.6 |
| 2009-06-19 | 8539.73 |
| 2009-06-22 | 8339.01 |
| 2009-06-23 | 8322.91 |
| 2009-06-24 | 8299.86 |
| 2009-06-25 | 8472.4 |
| 2009-06-26 | 8438.39 |
| 2009-06-29 | 8529.38 |
| 2009-06-30 | 8447 |
| 2009-07-01 | 8504.06 |
| 2009-07-02 | 8280.74 |
| 2009-07-06 | 8324.87 |
| 2009-07-07 | 8163.6 |
| 2009-07-08 | 8178.41 |
| 2009-07-09 | 8183.17 |
| 2009-07-10 | 8146.52 |
| 2009-07-13 | 8331.68 |
| 2009-07-14 | 8359.49 |
| 2009-07-15 | 8616.21 |
| 2009-07-16 | 8711.82 |
| 2009-07-17 | 8743.94 |
| 2009-07-20 | 8848.15 |
| 2009-07-21 | 8915.94 |
| 2009-07-22 | 8881.26 |
| 2009-07-23 | 9069.29 |
| 2009-07-24 | 9093.24 |
| 2009-07-27 | 9108.51 |
| 2009-07-28 | 9096.72 |
| 2009-07-29 | 9070.72 |
| 2009-07-30 | 9154.46 |
| 2009-07-31 | 9171.61 |
| 2009-08-03 | 9286.56 |
| 2009-08-04 | 9320.19 |
| 2009-08-05 | 9280.97 |
| 2009-08-06 | 9256.26 |
| 2009-08-07 | 9370.07 |
| 2009-08-10 | 9337.95 |
| 2009-08-11 | 9241.45 |
| 2009-08-12 | 9361.61 |
| 2009-08-13 | 9398.19 |
| 2009-08-14 | 9321.4 |
| 2009-08-17 | 9135.34 |
| 2009-08-18 | 9217.94 |
| 2009-08-19 | 9279.16 |
| 2009-08-20 | 9350.05 |
| 2009-08-21 | 9505.96 |
| 2009-08-24 | 9509.28 |
| 2009-08-25 | 9539.29 |
| 2009-08-26 | 9543.52 |
| 2009-08-27 | 9580.63 |
| 2009-08-28 | 9544.2 |
| 2009-08-31 | 9496.28 |
| 2009-09-01 | 9310.6 |
| 2009-09-02 | 9280.67 |
| 2009-09-03 | 9344.61 |
| 2009-09-04 | 9441.27 |
| 2009-09-08 | 9497.34 |
| 2009-09-09 | 9547.22 |
| 2009-09-10 | 9627.48 |
| 2009-09-11 | 9605.41 |
| 2009-09-14 | 9626.8 |
| 2009-09-15 | 9683.41 |
| 2009-09-16 | 9791.71 |
| 2009-09-17 | 9783.92 |
| 2009-09-18 | 9820.2 |
| 2009-09-21 | 9778.86 |
| 2009-09-22 | 9829.87 |
| 2009-09-23 | 9748.55 |
| 2009-09-24 | 9707.44 |
| 2009-09-25 | 9665.19 |
| 2009-09-28 | 9789.36 |
| 2009-09-29 | 9742.2 |
| 2009-09-30 | 9712.28 |
| 2009-10-01 | 9509.28 |
| 2009-10-02 | 9487.67 |
| 2009-10-05 | 9599.75 |
| 2009-10-06 | 9731.25 |
| 2009-10-07 | 9725.58 |
| 2009-10-08 | 9786.87 |
| 2009-10-09 | 9864.94 |
| 2009-10-12 | 9885.8 |
| 2009-10-13 | 9871.06 |
| 2009-10-14 | 10015.86 |
| 2009-10-15 | 10062.94 |
| 2009-10-16 | 9995.91 |
| 2009-10-19 | 10092.19 |
| 2009-10-20 | 10041.48 |
| 2009-10-21 | 9949.36 |
| 2009-10-22 | 10081.31 |
| 2009-10-23 | 9972.18 |
| 2009-10-26 | 9867.96 |
| 2009-10-27 | 9882.17 |
| 2009-10-28 | 9762.69 |
| 2009-10-29 | 9962.58 |
| 2009-10-30 | 9712.73 |
| 2009-11-02 | 9789.44 |
| 2009-11-03 | 9771.91 |
| 2009-11-04 | 9802.14 |
| 2009-11-05 | 10005.96 |
| 2009-11-06 | 10023.42 |
| 2009-11-09 | 10226.94 |
| 2009-11-10 | 10246.97 |
| 2009-11-11 | 10291.26 |
| 2009-11-12 | 10197.47 |
| 2009-11-13 | 10270.47 |
| 2009-11-16 | 10406.96 |
| 2009-11-17 | 10437.42 |
| 2009-11-18 | 10426.31 |
| 2009-11-19 | 10332.44 |
| 2009-11-20 | 10318.16 |
| 2009-11-23 | 10450.95 |
| 2009-11-24 | 10433.71 |
| 2009-11-25 | 10464.4 |
| 2009-11-27 | 10309.92 |
| 2009-11-30 | 10344.84 |
| 2009-12-01 | 10471.58 |
| 2009-12-02 | 10452.68 |
| 2009-12-03 | 10366.15 |
| 2009-12-04 | 10388.9 |
| 2009-12-07 | 10390.11 |
| 2009-12-08 | 10285.97 |
| 2009-12-09 | 10337.05 |
| 2009-12-10 | 10405.83 |
| 2009-12-11 | 10471.5 |
| 2009-12-14 | 10501.05 |
| 2009-12-15 | 10452 |
| 2009-12-16 | 10441.12 |
| 2009-12-17 | 10308.26 |
| 2009-12-18 | 10328.89 |
| 2009-12-21 | 10414.14 |
| 2009-12-22 | 10464.93 |
| 2009-12-23 | 10466.44 |
| 2009-12-24 | 10520.1 |
| 2009-12-28 | 10547.08 |
| 2009-12-29 | 10545.41 |
| 2009-12-30 | 10548.51 |
| 2009-12-31 | 10428.05 |
| 2010-01-04 | 10583.96 |
| 2010-01-05 | 10572.02 |
| 2010-01-06 | 10573.68 |
| 2010-01-07 | 10606.86 |
| 2010-01-08 | 10618.19 |
| 2010-01-11 | 10663.99 |
| 2010-01-12 | 10627.26 |
| 2010-01-13 | 10680.77 |
| 2010-01-14 | 10710.55 |
| 2010-01-15 | 10609.65 |
| 2010-01-19 | 10725.43 |
| 2010-01-20 | 10603.15 |
| 2010-01-21 | 10389.88 |
| 2010-01-22 | 10172.98 |
| 2010-01-25 | 10196.86 |
| 2010-01-26 | 10194.29 |
| 2010-01-27 | 10236.16 |
| 2010-01-28 | 10120.46 |
| 2010-01-29 | 10067.33 |
| 2010-02-01 | 10185.53 |
| 2010-02-02 | 10296.85 |
| 2010-02-03 | 10270.55 |
| 2010-02-04 | 10002.18 |
| 2010-02-05 | 10012.23 |
| 2010-02-08 | 9908.39 |
| 2010-02-09 | 10058.64 |
| 2010-02-10 | 10038.38 |
| 2010-02-11 | 10144.19 |
| 2010-02-12 | 10099.14 |
| 2010-02-16 | 10268.81 |
| 2010-02-17 | 10309.24 |
| 2010-02-18 | 10392.9 |
| 2010-02-19 | 10402.35 |
| 2010-02-22 | 10383.38 |
| 2010-02-23 | 10282.41 |
| 2010-02-24 | 10374.16 |
| 2010-02-25 | 10321.03 |
| 2010-02-26 | 10325.26 |
| 2010-03-01 | 10403.79 |
| 2010-03-02 | 10405.98 |
| 2010-03-03 | 10396.76 |
| 2010-03-04 | 10444.14 |
| 2010-03-05 | 10566.2 |
| 2010-03-08 | 10552.52 |
| 2010-03-09 | 10564.38 |
| 2010-03-10 | 10567.33 |
| 2010-03-11 | 10611.84 |
| 2010-03-12 | 10624.69 |
| 2010-03-15 | 10642.15 |
| 2010-03-16 | 10685.98 |
| 2010-03-17 | 10733.67 |
| 2010-03-18 | 10779.17 |
| 2010-03-19 | 10741.98 |
| 2010-03-22 | 10785.89 |
| 2010-03-23 | 10888.83 |
| 2010-03-24 | 10836.15 |
| 2010-03-25 | 10841.21 |
| 2010-03-26 | 10850.36 |
| 2010-03-29 | 10895.86 |
| 2010-03-30 | 10907.42 |
| 2010-03-31 | 10856.63 |
| 2010-04-01 | 10927.07 |
| 2010-04-05 | 10973.55 |
| 2010-04-06 | 10969.99 |
| 2010-04-07 | 10897.52 |
| 2010-04-08 | 10927.07 |
| 2010-04-09 | 10997.35 |
| 2010-04-12 | 11005.97 |
| 2010-04-13 | 11019.42 |
| 2010-04-14 | 11123.11 |
| 2010-04-15 | 11144.57 |
| 2010-04-16 | 11018.66 |
| 2010-04-19 | 11092.05 |
| 2010-04-20 | 11117.06 |
| 2010-04-21 | 11124.92 |
| 2010-04-22 | 11134.29 |
| 2010-04-23 | 11204.28 |
| 2010-04-26 | 11205.03 |
| 2010-04-27 | 10991.99 |
| 2010-04-28 | 11045.27 |
| 2010-04-29 | 11167.32 |
| 2010-04-30 | 11008.61 |
| 2010-05-03 | 11151.83 |
| 2010-05-04 | 10926.77 |
| 2010-05-05 | 10868.12 |
| 2010-05-06 | 10520.32 |
| 2010-05-07 | 10380.43 |
| 2010-05-10 | 10785.14 |
| 2010-05-11 | 10748.26 |
| 2010-05-12 | 10896.91 |
| 2010-05-13 | 10782.95 |
| 2010-05-14 | 10620.16 |
| 2010-05-17 | 10625.83 |
| 2010-05-18 | 10510.95 |
| 2010-05-19 | 10444.37 |
| 2010-05-20 | 10068.01 |
| 2010-05-21 | 10193.39 |
| 2010-05-24 | 10066.57 |
| 2010-05-25 | 10043.75 |
| 2010-05-26 | 9974.45 |
| 2010-05-27 | 10258.99 |
| 2010-05-28 | 10136.63 |
| 2010-06-01 | 10024.02 |
| 2010-06-02 | 10249.54 |
| 2010-06-03 | 10255.28 |
| 2010-06-04 | 9931.97 |
| 2010-06-07 | 9816.49 |
| 2010-06-08 | 9939.98 |
| 2010-06-09 | 9899.25 |
| 2010-06-10 | 10172.53 |
| 2010-06-11 | 10211.07 |
| 2010-06-14 | 10190.89 |
| 2010-06-15 | 10404.77 |
| 2010-06-16 | 10409.46 |
| 2010-06-17 | 10434.17 |
| 2010-06-18 | 10450.64 |
| 2010-06-21 | 10442.41 |
| 2010-06-22 | 10293.52 |
| 2010-06-23 | 10298.44 |
| 2010-06-24 | 10152.8 |
| 2010-06-25 | 10143.81 |
| 2010-06-28 | 10138.52 |
| 2010-06-29 | 9870.3 |
| 2010-06-30 | 9774.02 |
| 2010-07-01 | 9732.53 |
| 2010-07-02 | 9686.48 |
| 2010-07-06 | 9743.62 |
| 2010-07-07 | 10018.28 |
| 2010-07-08 | 10138.99 |
| 2010-07-09 | 10198.03 |
| 2010-07-12 | 10216.27 |
| 2010-07-13 | 10363.02 |
| 2010-07-14 | 10366.72 |
| 2010-07-15 | 10359.31 |
| 2010-07-16 | 10097.9 |
| 2010-07-19 | 10154.43 |
| 2010-07-20 | 10229.96 |
| 2010-07-21 | 10120.53 |
| 2010-07-22 | 10322.3 |
| 2010-07-23 | 10424.62 |
| 2010-07-26 | 10525.43 |
| 2010-07-27 | 10537.69 |
| 2010-07-28 | 10497.88 |
| 2010-07-29 | 10467.16 |
| 2010-07-30 | 10465.94 |
| 2010-08-02 | 10674.38 |
| 2010-08-03 | 10636.38 |
| 2010-08-04 | 10680.43 |
| 2010-08-05 | 10674.98 |
| 2010-08-06 | 10653.56 |
| 2010-08-09 | 10698.75 |
| 2010-08-10 | 10644.25 |
| 2010-08-11 | 10378.83 |
| 2010-08-12 | 10319.95 |
| 2010-08-13 | 10303.15 |
| 2010-08-16 | 10302.01 |
| 2010-08-17 | 10405.85 |
| 2010-08-18 | 10415.54 |
| 2010-08-19 | 10271.21 |
| 2010-08-20 | 10213.62 |
| 2010-08-23 | 10174.41 |
| 2010-08-24 | 10040.45 |
| 2010-08-25 | 10060.06 |
| 2010-08-26 | 9985.81 |
| 2010-08-27 | 10150.65 |
| 2010-08-30 | 10009.73 |
| 2010-08-31 | 10014.72 |
| 2010-09-01 | 10269.47 |
| 2010-09-02 | 10320.1 |
| 2010-09-03 | 10447.93 |
| 2010-09-07 | 10340.69 |
| 2010-09-08 | 10387.01 |
| 2010-09-09 | 10415.24 |
| 2010-09-10 | 10462.77 |
| 2010-09-13 | 10544.13 |
| 2010-09-14 | 10526.49 |
| 2010-09-15 | 10572.73 |
| 2010-09-16 | 10594.83 |
| 2010-09-17 | 10607.85 |
| 2010-09-20 | 10753.62 |
| 2010-09-21 | 10761.03 |
| 2010-09-22 | 10739.31 |
| 2010-09-23 | 10662.42 |
| 2010-09-24 | 10860.26 |
| 2010-09-27 | 10812.04 |
| 2010-09-28 | 10858.14 |
| 2010-09-29 | 10835.28 |
| 2010-09-30 | 10788.05 |
| 2010-10-01 | 10829.68 |
| 2010-10-04 | 10751.27 |
| 2010-10-05 | 10944.72 |
| 2010-10-06 | 10967.65 |
| 2010-10-07 | 10948.58 |
| 2010-10-08 | 11006.48 |
| 2010-10-11 | 11010.34 |
| 2010-10-12 | 11020.4 |
| 2010-10-13 | 11096.08 |
| 2010-10-14 | 11094.57 |
| 2010-10-15 | 11062.78 |
| 2010-10-18 | 11143.69 |
| 2010-10-19 | 10978.62 |
| 2010-10-20 | 11107.97 |
| 2010-10-21 | 11146.57 |
| 2010-10-22 | 11132.56 |
| 2010-10-25 | 11164.05 |
| 2010-10-26 | 11169.46 |
| 2010-10-27 | 11126.28 |
| 2010-10-28 | 11113.95 |
| 2010-10-29 | 11118.49 |
| 2010-11-01 | 11124.62 |
| 2010-11-02 | 11188.72 |
| 2010-11-03 | 11215.13 |
| 2010-11-04 | 11434.84 |
| 2010-11-05 | 11444.08 |
| 2010-11-08 | 11406.84 |
| 2010-11-09 | 11346.75 |
| 2010-11-10 | 11357.04 |
| 2010-11-11 | 11283.1 |
| 2010-11-12 | 11192.58 |
| 2010-11-15 | 11201.97 |
| 2010-11-16 | 11023.5 |
| 2010-11-17 | 11007.88 |
| 2010-11-18 | 11181.23 |
| 2010-11-19 | 11203.55 |
| 2010-11-22 | 11178.58 |
| 2010-11-23 | 11036.37 |
| 2010-11-24 | 11187.28 |
| 2010-11-26 | 11092 |
| 2010-11-29 | 11052.49 |
| 2010-11-30 | 11006.02 |
| 2010-12-01 | 11255.78 |
| 2010-12-02 | 11362.41 |
| 2010-12-03 | 11382.09 |
| 2010-12-06 | 11362.19 |
| 2010-12-07 | 11359.16 |
| 2010-12-08 | 11372.48 |
| 2010-12-09 | 11370.06 |
| 2010-12-10 | 11410.32 |
| 2010-12-13 | 11428.56 |
| 2010-12-14 | 11476.54 |
| 2010-12-15 | 11457.47 |
| 2010-12-16 | 11499.25 |
| 2010-12-17 | 11491.91 |
| 2010-12-20 | 11478.13 |
| 2010-12-21 | 11533.16 |
| 2010-12-22 | 11559.49 |
| 2010-12-23 | 11573.49 |
| 2010-12-27 | 11555.03 |
| 2010-12-28 | 11575.54 |
| 2010-12-29 | 11585.38 |
| 2010-12-30 | 11569.71 |
| 2010-12-31 | 11577.51 |
| 2011-01-03 | 11670.75 |
| 2011-01-04 | 11691.18 |
| 2011-01-05 | 11722.89 |
| 2011-01-06 | 11697.31 |
| 2011-01-07 | 11674.76 |
| 2011-01-10 | 11637.45 |
| 2011-01-11 | 11671.88 |
| 2011-01-12 | 11755.44 |
| 2011-01-13 | 11731.9 |
| 2011-01-14 | 11787.38 |
| 2011-01-18 | 11837.93 |
| 2011-01-19 | 11825.29 |
| 2011-01-20 | 11822.8 |
| 2011-01-21 | 11871.84 |
| 2011-01-24 | 11980.52 |
| 2011-01-25 | 11977.19 |
| 2011-01-26 | 11985.44 |
| 2011-01-27 | 11989.83 |
| 2011-01-28 | 11823.7 |
| 2011-01-31 | 11891.93 |
| 2011-02-01 | 12040.16 |
| 2011-02-02 | 12041.97 |
| 2011-02-03 | 12062.26 |
| 2011-02-04 | 12092.15 |
| 2011-02-07 | 12161.63 |
| 2011-02-08 | 12233.15 |
| 2011-02-09 | 12239.89 |
| 2011-02-10 | 12229.29 |
| 2011-02-11 | 12273.26 |
| 2011-02-14 | 12268.19 |
| 2011-02-15 | 12226.64 |
| 2011-02-16 | 12288.17 |
| 2011-02-17 | 12318.14 |
| 2011-02-18 | 12391.25 |
| 2011-02-22 | 12212.79 |
| 2011-02-23 | 12105.78 |
| 2011-02-24 | 12068.5 |
| 2011-02-25 | 12130.45 |
| 2011-02-28 | 12226.34 |
| 2011-03-01 | 12058.02 |
| 2011-03-02 | 12066.8 |
| 2011-03-03 | 12258.2 |
| 2011-03-04 | 12169.88 |
| 2011-03-07 | 12090.03 |
| 2011-03-08 | 12214.38 |
| 2011-03-09 | 12213.09 |
| 2011-03-10 | 11984.61 |
| 2011-03-11 | 12044.4 |
| 2011-03-14 | 11993.16 |
| 2011-03-15 | 11855.42 |
| 2011-03-16 | 11613.3 |
| 2011-03-17 | 11774.59 |
| 2011-03-18 | 11858.52 |
| 2011-03-21 | 12036.53 |
| 2011-03-22 | 12018.63 |
| 2011-03-23 | 12086.02 |
| 2011-03-24 | 12170.56 |
| 2011-03-25 | 12220.59 |
| 2011-03-28 | 12197.88 |
| 2011-03-29 | 12279.01 |
| 2011-03-30 | 12350.61 |
| 2011-03-31 | 12319.73 |
| 2011-04-01 | 12376.72 |
| 2011-04-04 | 12400.03 |
| 2011-04-05 | 12393.9 |
| 2011-04-06 | 12426.75 |
| 2011-04-07 | 12409.49 |
| 2011-04-08 | 12380.05 |
| 2011-04-11 | 12381.11 |
| 2011-04-12 | 12263.58 |
| 2011-04-13 | 12270.99 |
| 2011-04-14 | 12285.15 |
| 2011-04-15 | 12341.83 |
| 2011-04-18 | 12201.59 |
| 2011-04-19 | 12266.75 |
| 2011-04-20 | 12453.54 |
| 2011-04-21 | 12505.99 |
| 2011-04-25 | 12479.88 |
| 2011-04-26 | 12595.37 |
| 2011-04-27 | 12690.96 |
| 2011-04-28 | 12763.31 |
| 2011-04-29 | 12810.54 |
| 2011-05-02 | 12807.36 |
| 2011-05-03 | 12807.51 |
| 2011-05-04 | 12723.58 |
| 2011-05-05 | 12584.17 |
| 2011-05-06 | 12638.74 |
| 2011-05-09 | 12684.68 |
| 2011-05-10 | 12760.36 |
| 2011-05-11 | 12630.03 |
| 2011-05-12 | 12695.92 |
| 2011-05-13 | 12595.75 |
| 2011-05-16 | 12548.37 |
| 2011-05-17 | 12479.58 |
| 2011-05-18 | 12560.18 |
| 2011-05-19 | 12605.32 |
| 2011-05-20 | 12512.04 |
| 2011-05-23 | 12381.26 |
| 2011-05-24 | 12356.21 |
| 2011-05-25 | 12394.66 |
| 2011-05-26 | 12402.76 |
| 2011-05-27 | 12441.58 |
| 2011-05-31 | 12569.79 |
| 2011-06-01 | 12290.14 |
| 2011-06-02 | 12248.55 |
| 2011-06-03 | 12151.26 |
| 2011-06-06 | 12089.96 |
| 2011-06-07 | 12070.81 |
| 2011-06-08 | 12048.94 |
| 2011-06-09 | 12124.36 |
| 2011-06-10 | 11951.91 |
| 2011-06-13 | 11952.97 |
| 2011-06-14 | 12076.11 |
| 2011-06-15 | 11897.27 |
| 2011-06-16 | 11961.52 |
| 2011-06-17 | 12004.36 |
| 2011-06-20 | 12080.38 |
| 2011-06-21 | 12190.01 |
| 2011-06-22 | 12109.67 |
| 2011-06-23 | 12050 |
| 2011-06-24 | 11934.58 |
| 2011-06-27 | 12043.56 |
| 2011-06-28 | 12188.69 |
| 2011-06-29 | 12261.42 |
| 2011-06-30 | 12414.34 |
| 2011-07-01 | 12582.77 |
| 2011-07-05 | 12569.87 |
| 2011-07-06 | 12626.02 |
| 2011-07-07 | 12719.49 |
| 2011-07-08 | 12657.2 |
| 2011-07-11 | 12505.76 |
| 2011-07-12 | 12446.88 |
| 2011-07-13 | 12491.61 |
| 2011-07-14 | 12437.12 |
| 2011-07-15 | 12479.73 |
| 2011-07-18 | 12385.16 |
| 2011-07-19 | 12587.42 |
| 2011-07-20 | 12571.91 |
| 2011-07-21 | 12724.41 |
| 2011-07-22 | 12681.16 |
| 2011-07-25 | 12592.8 |
| 2011-07-26 | 12501.3 |
| 2011-07-27 | 12302.55 |
| 2011-07-28 | 12240.11 |
| 2011-07-29 | 12143.24 |
| 2011-08-01 | 12132.49 |
| 2011-08-02 | 11866.62 |
| 2011-08-03 | 11896.44 |
| 2011-08-04 | 11383.68 |
| 2011-08-05 | 11444.61 |
| 2011-08-08 | 10809.85 |
| 2011-08-09 | 11239.77 |
| 2011-08-10 | 10719.94 |
| 2011-08-11 | 11143.31 |
| 2011-08-12 | 11269.02 |
| 2011-08-15 | 11482.9 |
| 2011-08-16 | 11405.93 |
| 2011-08-17 | 11410.21 |
| 2011-08-18 | 10990.58 |
| 2011-08-19 | 10817.65 |
| 2011-08-22 | 10854.65 |
| 2011-08-23 | 11176.76 |
| 2011-08-24 | 11320.71 |
| 2011-08-25 | 11149.82 |
| 2011-08-26 | 11284.54 |
| 2011-08-29 | 11539.25 |
| 2011-08-30 | 11559.95 |
| 2011-08-31 | 11613.53 |
| 2011-09-01 | 11493.57 |
| 2011-09-02 | 11240.26 |
| 2011-09-06 | 11139.3 |
| 2011-09-07 | 11414.86 |
| 2011-09-08 | 11295.81 |
| 2011-09-09 | 10992.13 |
| 2011-09-12 | 11061.12 |
| 2011-09-13 | 11105.85 |
| 2011-09-14 | 11246.73 |
| 2011-09-15 | 11433.18 |
| 2011-09-16 | 11509.09 |
| 2011-09-19 | 11401.01 |
| 2011-09-20 | 11408.66 |
| 2011-09-21 | 11124.84 |
| 2011-09-22 | 10733.83 |
| 2011-09-23 | 10771.48 |
| 2011-09-26 | 11043.86 |
| 2011-09-27 | 11190.69 |
| 2011-09-28 | 11010.9 |
| 2011-09-29 | 11153.98 |
| 2011-09-30 | 10913.38 |
| 2011-10-03 | 10655.3 |
| 2011-10-04 | 10808.71 |
| 2011-10-05 | 10939.95 |
| 2011-10-06 | 11123.33 |
| 2011-10-07 | 11103.12 |
| 2011-10-10 | 11433.18 |
| 2011-10-11 | 11416.3 |
| 2011-10-12 | 11518.85 |
| 2011-10-13 | 11478.13 |
| 2011-10-14 | 11644.49 |
| 2011-10-17 | 11397 |
| 2011-10-18 | 11577.05 |
| 2011-10-19 | 11504.62 |
| 2011-10-20 | 11541.78 |
| 2011-10-21 | 11808.79 |
| 2011-10-24 | 11913.62 |
| 2011-10-25 | 11706.62 |
| 2011-10-26 | 11869.04 |
| 2011-10-27 | 12208.55 |
| 2011-10-28 | 12231.11 |
| 2011-10-31 | 11955.01 |
| 2011-11-01 | 11657.96 |
| 2011-11-02 | 11836.04 |
| 2011-11-03 | 12044.47 |
| 2011-11-04 | 11983.24 |
| 2011-11-07 | 12068.39 |
| 2011-11-08 | 12170.18 |
| 2011-11-09 | 11780.94 |
| 2011-11-10 | 11893.79 |
| 2011-11-11 | 12153.68 |
| 2011-11-14 | 12078.98 |
| 2011-11-15 | 12096.16 |
| 2011-11-16 | 11905.59 |
| 2011-11-17 | 11770.73 |
| 2011-11-18 | 11796.16 |
| 2011-11-21 | 11547.31 |
| 2011-11-22 | 11493.72 |
| 2011-11-23 | 11257.55 |
| 2011-11-25 | 11231.78 |
| 2011-11-28 | 11523.01 |
| 2011-11-29 | 11555.63 |
| 2011-11-30 | 12045.68 |
| 2011-12-01 | 12020.03 |
| 2011-12-02 | 12019.42 |
| 2011-12-05 | 12097.83 |
| 2011-12-06 | 12150.13 |
| 2011-12-07 | 12196.37 |
| 2011-12-08 | 11997.7 |
| 2011-12-09 | 12184.26 |
| 2011-12-12 | 12021.39 |
| 2011-12-13 | 11954.94 |
| 2011-12-14 | 11823.48 |
| 2011-12-15 | 11868.81 |
| 2011-12-16 | 11866.39 |
| 2011-12-19 | 11766.26 |
| 2011-12-20 | 12103.58 |
| 2011-12-21 | 12107.74 |
| 2011-12-22 | 12169.65 |
| 2011-12-23 | 12294 |
| 2011-12-27 | 12291.35 |
| 2011-12-28 | 12151.41 |
| 2011-12-29 | 12287.04 |
| 2011-12-30 | 12217.56 |
| 2012-01-03 | 12397.38 |
| 2012-01-04 | 12418.42 |
| 2012-01-05 | 12415.7 |
| 2012-01-06 | 12359.92 |
| 2012-01-09 | 12392.69 |
| 2012-01-10 | 12462.47 |
| 2012-01-11 | 12449.45 |
| 2012-01-12 | 12471.02 |
| 2012-01-13 | 12422.06 |
| 2012-01-17 | 12482.07 |
| 2012-01-18 | 12578.95 |
| 2012-01-19 | 12623.98 |
| 2012-01-20 | 12720.48 |
| 2012-01-23 | 12708.82 |
| 2012-01-24 | 12675.75 |
| 2012-01-25 | 12756.96 |
| 2012-01-26 | 12734.63 |
| 2012-01-27 | 12660.46 |
| 2012-01-30 | 12653.72 |
| 2012-01-31 | 12632.91 |
| 2012-02-01 | 12716.46 |
| 2012-02-02 | 12705.41 |
| 2012-02-03 | 12862.23 |
| 2012-02-06 | 12845.13 |
| 2012-02-07 | 12878.2 |
| 2012-02-08 | 12883.95 |
| 2012-02-09 | 12890.46 |
| 2012-02-10 | 12801.23 |
| 2012-02-13 | 12874.04 |
| 2012-02-14 | 12878.28 |
| 2012-02-15 | 12780.95 |
| 2012-02-16 | 12904.08 |
| 2012-02-17 | 12949.87 |
| 2012-02-21 | 12965.69 |
| 2012-02-22 | 12938.67 |
| 2012-02-23 | 12984.69 |
| 2012-02-24 | 12982.95 |
| 2012-02-27 | 12981.51 |
| 2012-02-28 | 13005.12 |
| 2012-02-29 | 12952.07 |
| 2012-03-01 | 12980.3 |
| 2012-03-02 | 12977.57 |
| 2012-03-05 | 12962.81 |
| 2012-03-06 | 12759.15 |
| 2012-03-07 | 12837.33 |
| 2012-03-08 | 12907.94 |
| 2012-03-09 | 12922.02 |
| 2012-03-12 | 12959.71 |
| 2012-03-13 | 13177.68 |
| 2012-03-14 | 13194.1 |
| 2012-03-15 | 13252.76 |
| 2012-03-16 | 13232.62 |
| 2012-03-19 | 13239.13 |
| 2012-03-20 | 13170.19 |
| 2012-03-21 | 13124.62 |
| 2012-03-22 | 13046.14 |
| 2012-03-23 | 13080.73 |
| 2012-03-26 | 13241.63 |
| 2012-03-27 | 13197.73 |
| 2012-03-28 | 13126.21 |
| 2012-03-29 | 13145.82 |
| 2012-03-30 | 13212.04 |
| 2012-04-02 | 13264.49 |
| 2012-04-03 | 13199.55 |
| 2012-04-04 | 13074.75 |
| 2012-04-05 | 13060.14 |
| 2012-04-09 | 12929.59 |
| 2012-04-10 | 12715.93 |
| 2012-04-11 | 12805.39 |
| 2012-04-12 | 12986.58 |
| 2012-04-13 | 12849.59 |
| 2012-04-16 | 12921.41 |
| 2012-04-17 | 13115.54 |
| 2012-04-18 | 13032.75 |
| 2012-04-19 | 12964.1 |
| 2012-04-20 | 13029.26 |
| 2012-04-23 | 12927.17 |
| 2012-04-24 | 13001.56 |
| 2012-04-25 | 13090.72 |
| 2012-04-26 | 13204.62 |
| 2012-04-27 | 13228.31 |
| 2012-04-30 | 13213.63 |
| 2012-05-01 | 13279.32 |
| 2012-05-02 | 13268.57 |
| 2012-05-03 | 13206.59 |
| 2012-05-04 | 13038.27 |
| 2012-05-07 | 13008.53 |
| 2012-05-08 | 12932.09 |
| 2012-05-09 | 12835.06 |
| 2012-05-10 | 12855.04 |
| 2012-05-11 | 12820.6 |
| 2012-05-14 | 12695.35 |
| 2012-05-15 | 12632 |
| 2012-05-16 | 12598.55 |
| 2012-05-17 | 12442.49 |
| 2012-05-18 | 12369.38 |
| 2012-05-21 | 12504.48 |
| 2012-05-22 | 12502.81 |
| 2012-05-23 | 12496.15 |
| 2012-05-24 | 12529.75 |
| 2012-05-25 | 12454.83 |
| 2012-05-29 | 12580.69 |
| 2012-05-30 | 12419.86 |
| 2012-05-31 | 12393.45 |
| 2012-06-01 | 12118.57 |
| 2012-06-04 | 12101.46 |
| 2012-06-05 | 12127.95 |
| 2012-06-06 | 12414.79 |
| 2012-06-07 | 12460.96 |
| 2012-06-08 | 12554.2 |
| 2012-06-11 | 12411.23 |
| 2012-06-12 | 12573.8 |
| 2012-06-13 | 12496.38 |
| 2012-06-14 | 12651.91 |
| 2012-06-15 | 12767.17 |
| 2012-06-18 | 12741.82 |
| 2012-06-19 | 12837.33 |
| 2012-06-20 | 12824.39 |
| 2012-06-21 | 12573.57 |
| 2012-06-22 | 12640.78 |
| 2012-06-25 | 12502.66 |
| 2012-06-26 | 12534.67 |
| 2012-06-27 | 12627.01 |
| 2012-06-28 | 12602.26 |
| 2012-06-29 | 12880.09 |
| 2012-07-02 | 12871.39 |
| 2012-07-03 | 12943.82 |
| 2012-07-05 | 12896.67 |
| 2012-07-06 | 12772.47 |
| 2012-07-09 | 12736.29 |
| 2012-07-10 | 12653.12 |
| 2012-07-11 | 12604.53 |
| 2012-07-12 | 12573.27 |
| 2012-07-13 | 12777.09 |
| 2012-07-16 | 12727.21 |
| 2012-07-17 | 12805.54 |
| 2012-07-18 | 12908.7 |
| 2012-07-19 | 12943.36 |
| 2012-07-20 | 12822.57 |
| 2012-07-23 | 12721.46 |
| 2012-07-24 | 12617.32 |
| 2012-07-25 | 12676.05 |
| 2012-07-26 | 12887.93 |
| 2012-07-27 | 13075.66 |
| 2012-07-30 | 13073.01 |
| 2012-07-31 | 13008.68 |
| 2012-08-01 | 12971.06 |
| 2012-08-02 | 12878.88 |
| 2012-08-03 | 13096.17 |
| 2012-08-06 | 13117.51 |
| 2012-08-07 | 13168.6 |
| 2012-08-08 | 13175.64 |
| 2012-08-09 | 13165.19 |
| 2012-08-10 | 13207.95 |
| 2012-08-13 | 13169.43 |
| 2012-08-14 | 13172.14 |
| 2012-08-15 | 13164.78 |
| 2012-08-16 | 13250.11 |
| 2012-08-17 | 13275.2 |
| 2012-08-20 | 13271.64 |
| 2012-08-21 | 13203.58 |
| 2012-08-22 | 13172.76 |
| 2012-08-23 | 13057.46 |
| 2012-08-24 | 13157.97 |
| 2012-08-27 | 13124.67 |
| 2012-08-28 | 13102.99 |
| 2012-08-29 | 13107.48 |
| 2012-08-30 | 13000.71 |
| 2012-08-31 | 13090.84 |
| 2012-09-04 | 13035.94 |
| 2012-09-05 | 13047.48 |
| 2012-09-06 | 13292 |
| 2012-09-07 | 13306.64 |
| 2012-09-10 | 13254.29 |
| 2012-09-11 | 13323.36 |
| 2012-09-12 | 13333.35 |
| 2012-09-13 | 13539.86 |
| 2012-09-14 | 13593.37 |
| 2012-09-17 | 13553.1 |
| 2012-09-18 | 13564.64 |
| 2012-09-19 | 13577.96 |
| 2012-09-20 | 13596.93 |
| 2012-09-21 | 13579.47 |
| 2012-09-24 | 13558.92 |
| 2012-09-25 | 13457.55 |
| 2012-09-26 | 13413.51 |
| 2012-09-27 | 13485.97 |
| 2012-09-28 | 13437.13 |
| 2012-10-01 | 13515.11 |
| 2012-10-02 | 13482.36 |
| 2012-10-03 | 13494.61 |
| 2012-10-04 | 13575.36 |
| 2012-10-05 | 13610.15 |
| 2012-10-08 | 13583.65 |
| 2012-10-09 | 13473.53 |
| 2012-10-10 | 13344.97 |
| 2012-10-11 | 13326.39 |
| 2012-10-12 | 13328.85 |
| 2012-10-15 | 13424.23 |
| 2012-10-16 | 13551.78 |
| 2012-10-17 | 13557 |
| 2012-10-18 | 13548.94 |
| 2012-10-19 | 13343.51 |
| 2012-10-22 | 13345.89 |
| 2012-10-23 | 13102.53 |
| 2012-10-24 | 13077.34 |
| 2012-10-25 | 13103.68 |
| 2012-10-26 | 13107.21 |
| 2012-10-31 | 13096.46 |
| 2012-11-01 | 13232.62 |
| 2012-11-02 | 13093.16 |
| 2012-11-05 | 13112.44 |
| 2012-11-06 | 13245.68 |
| 2012-11-07 | 12932.73 |
| 2012-11-08 | 12811.32 |
| 2012-11-09 | 12815.39 |
| 2012-11-12 | 12815.08 |
| 2012-11-13 | 12756.18 |
| 2012-11-14 | 12570.95 |
| 2012-11-15 | 12542.38 |
| 2012-11-16 | 12588.31 |
| 2012-11-19 | 12795.96 |
| 2012-11-20 | 12788.51 |
| 2012-11-21 | 12836.89 |
| 2012-11-23 | 13009.68 |
| 2012-11-26 | 12967.37 |
| 2012-11-27 | 12878.13 |
| 2012-11-28 | 12985.11 |
| 2012-11-29 | 13021.82 |
| 2012-11-30 | 13025.58 |
| 2012-12-03 | 12965.6 |
| 2012-12-04 | 12951.78 |
| 2012-12-05 | 13034.49 |
| 2012-12-06 | 13074.04 |
| 2012-12-07 | 13155.13 |
| 2012-12-10 | 13169.88 |
| 2012-12-11 | 13248.44 |
| 2012-12-12 | 13245.45 |
| 2012-12-13 | 13170.72 |
| 2012-12-14 | 13135.01 |
| 2012-12-17 | 13235.39 |
| 2012-12-18 | 13350.96 |
| 2012-12-19 | 13251.97 |
| 2012-12-20 | 13311.72 |
| 2012-12-21 | 13190.84 |
| 2012-12-24 | 13139.08 |
| 2012-12-26 | 13114.59 |
| 2012-12-27 | 13096.31 |
| 2012-12-28 | 12938.11 |
| 2012-12-31 | 13104.14 |
| 2013-01-02 | 13412.55 |
| 2013-01-03 | 13391.36 |
| 2013-01-04 | 13435.21 |
| 2013-01-07 | 13384.29 |
| 2013-01-08 | 13328.85 |
| 2013-01-09 | 13390.51 |
| 2013-01-10 | 13471.22 |
| 2013-01-11 | 13488.43 |
| 2013-01-14 | 13507.32 |
| 2013-01-15 | 13534.89 |
| 2013-01-16 | 13511.23 |
| 2013-01-17 | 13596.02 |
| 2013-01-18 | 13649.7 |
| 2013-01-22 | 13712.21 |
| 2013-01-23 | 13779.33 |
| 2013-01-24 | 13825.33 |
| 2013-01-25 | 13895.98 |
| 2013-01-28 | 13881.93 |
| 2013-01-29 | 13954.42 |
| 2013-01-30 | 13910.42 |
| 2013-01-31 | 13860.58 |
| 2013-02-01 | 14009.79 |
| 2013-02-04 | 13880.08 |
| 2013-02-05 | 13979.3 |
| 2013-02-06 | 13986.52 |
| 2013-02-07 | 13944.05 |
| 2013-02-08 | 13992.97 |
| 2013-02-11 | 13971.24 |
| 2013-02-12 | 14018.7 |
| 2013-02-13 | 13982.91 |
| 2013-02-14 | 13973.39 |
| 2013-02-15 | 13981.76 |
| 2013-02-19 | 14035.67 |
| 2013-02-20 | 13927.54 |
| 2013-02-21 | 13880.62 |
| 2013-02-22 | 14000.57 |
| 2013-02-25 | 13784.17 |
| 2013-02-26 | 13900.13 |
| 2013-02-27 | 14075.37 |
| 2013-02-28 | 14054.49 |
| 2013-03-01 | 14089.66 |
| 2013-03-04 | 14127.82 |
| 2013-03-05 | 14253.77 |
| 2013-03-06 | 14296.24 |
| 2013-03-07 | 14329.49 |
| 2013-03-08 | 14397.07 |
| 2013-03-11 | 14447.29 |
| 2013-03-12 | 14450.06 |
| 2013-03-13 | 14455.28 |
| 2013-03-14 | 14539.14 |
| 2013-03-15 | 14514.11 |
| 2013-03-18 | 14452.06 |
| 2013-03-19 | 14455.82 |
| 2013-03-20 | 14511.73 |
| 2013-03-21 | 14421.49 |
| 2013-03-22 | 14512.03 |
| 2013-03-25 | 14447.75 |
| 2013-03-26 | 14559.65 |
| 2013-03-27 | 14526.16 |
| 2013-03-28 | 14578.54 |
| 2013-04-01 | 14572.85 |
| 2013-04-02 | 14662.01 |
| 2013-04-03 | 14550.35 |
| 2013-04-04 | 14606.11 |
| 2013-04-05 | 14565.25 |
| 2013-04-08 | 14613.48 |
| 2013-04-09 | 14673.46 |
| 2013-04-10 | 14802.24 |
| 2013-04-11 | 14865.14 |
| 2013-04-12 | 14865.06 |
| 2013-04-15 | 14599.2 |
| 2013-04-16 | 14756.78 |
| 2013-04-17 | 14618.59 |
| 2013-04-18 | 14537.14 |
| 2013-04-19 | 14547.51 |
| 2013-04-22 | 14567.17 |
| 2013-04-23 | 14719.46 |
| 2013-04-24 | 14676.3 |
| 2013-04-25 | 14700.8 |
| 2013-04-26 | 14712.55 |
| 2013-04-29 | 14818.75 |
| 2013-04-30 | 14839.8 |
| 2013-05-01 | 14700.95 |
| 2013-05-02 | 14831.58 |
| 2013-05-03 | 14973.96 |
| 2013-05-06 | 14968.89 |
| 2013-05-07 | 15056.2 |
| 2013-05-08 | 15105.12 |
| 2013-05-09 | 15082.62 |
| 2013-05-10 | 15118.49 |
| 2013-05-13 | 15091.68 |
| 2013-05-14 | 15215.25 |
| 2013-05-15 | 15275.69 |
| 2013-05-16 | 15233.22 |
| 2013-05-17 | 15354.4 |
| 2013-05-20 | 15335.28 |
| 2013-05-21 | 15387.58 |
| 2013-05-22 | 15307.17 |
| 2013-05-23 | 15294.5 |
| 2013-05-24 | 15303.1 |
| 2013-05-28 | 15409.39 |
| 2013-05-29 | 15302.8 |
| 2013-05-30 | 15324.53 |
| 2013-05-31 | 15115.57 |
| 2013-06-03 | 15254.03 |
| 2013-06-04 | 15177.54 |
| 2013-06-05 | 14960.59 |
| 2013-06-06 | 15040.62 |
| 2013-06-07 | 15248.12 |
| 2013-06-10 | 15238.59 |
| 2013-06-11 | 15122.02 |
| 2013-06-12 | 14995.23 |
| 2013-06-13 | 15176.08 |
| 2013-06-14 | 15070.18 |
| 2013-06-17 | 15179.85 |
| 2013-06-18 | 15318.23 |
| 2013-06-19 | 15112.19 |
| 2013-06-20 | 14758.32 |
| 2013-06-21 | 14799.4 |
| 2013-06-24 | 14659.56 |
| 2013-06-25 | 14760.31 |
| 2013-06-26 | 14910.14 |
| 2013-06-27 | 15024.49 |
| 2013-06-28 | 14909.6 |
| 2013-07-01 | 14974.96 |
| 2013-07-02 | 14932.41 |
| 2013-07-03 | 14988.55 |
| 2013-07-05 | 15135.84 |
| 2013-07-08 | 15224.69 |
| 2013-07-09 | 15300.34 |
| 2013-07-10 | 15291.66 |
| 2013-07-11 | 15460.92 |
| 2013-07-12 | 15464.3 |
| 2013-07-15 | 15484.26 |
| 2013-07-16 | 15451.85 |
| 2013-07-17 | 15470.52 |
| 2013-07-18 | 15548.54 |
| 2013-07-19 | 15543.74 |
| 2013-07-22 | 15545.55 |
| 2013-07-23 | 15567.74 |
| 2013-07-24 | 15542.24 |
| 2013-07-25 | 15555.61 |
| 2013-07-26 | 15558.83 |
| 2013-07-29 | 15521.97 |
| 2013-07-30 | 15520.59 |
| 2013-07-31 | 15499.54 |
| 2013-08-01 | 15628.02 |
| 2013-08-02 | 15658.36 |
| 2013-08-05 | 15612.13 |
| 2013-08-06 | 15518.74 |
| 2013-08-07 | 15470.67 |
| 2013-08-08 | 15498.32 |
| 2013-08-09 | 15425.51 |
| 2013-08-12 | 15419.68 |
| 2013-08-13 | 15451.01 |
| 2013-08-14 | 15337.66 |
| 2013-08-15 | 15112.19 |
| 2013-08-16 | 15081.47 |
| 2013-08-19 | 15010.74 |
| 2013-08-20 | 15002.99 |
| 2013-08-21 | 14897.55 |
| 2013-08-22 | 14963.74 |
| 2013-08-23 | 15010.51 |
| 2013-08-26 | 14946.46 |
| 2013-08-27 | 14776.13 |
| 2013-08-28 | 14824.51 |
| 2013-08-29 | 14840.95 |
| 2013-08-30 | 14810.31 |
| 2013-09-03 | 14833.96 |
| 2013-09-04 | 14930.87 |
| 2013-09-05 | 14937.48 |
| 2013-09-06 | 14922.5 |
| 2013-09-09 | 15063.12 |
| 2013-09-10 | 15191.06 |
| 2013-09-11 | 15326.6 |
| 2013-09-12 | 15300.64 |
| 2013-09-13 | 15376.06 |
| 2013-09-16 | 15494.78 |
| 2013-09-17 | 15529.73 |
| 2013-09-18 | 15676.94 |
| 2013-09-19 | 15636.55 |
| 2013-09-20 | 15451.09 |
| 2013-09-23 | 15401.38 |
| 2013-09-24 | 15334.59 |
| 2013-09-25 | 15273.26 |
| 2013-09-26 | 15328.3 |
| 2013-09-27 | 15258.24 |
| 2013-09-30 | 15129.67 |
| 2013-10-01 | 15191.7 |
| 2013-10-02 | 15133.14 |
| 2013-10-03 | 14996.48 |
| 2013-10-04 | 15072.58 |
| 2013-10-07 | 14936.24 |
| 2013-10-08 | 14776.53 |
| 2013-10-09 | 14802.98 |
| 2013-10-10 | 15126.07 |
| 2013-10-11 | 15237.11 |
| 2013-10-14 | 15301.26 |
| 2013-10-15 | 15168.01 |
| 2013-10-16 | 15373.83 |
| 2013-10-17 | 15371.65 |
| 2013-10-18 | 15399.65 |
| 2013-10-21 | 15392.2 |
| 2013-10-22 | 15467.66 |
| 2013-10-23 | 15413.33 |
| 2013-10-24 | 15509.21 |
| 2013-10-25 | 15570.28 |
| 2013-10-28 | 15568.93 |
| 2013-10-29 | 15680.35 |
| 2013-10-30 | 15618.76 |
| 2013-10-31 | 15545.75 |
| 2013-11-01 | 15615.55 |
| 2013-11-04 | 15639.12 |
| 2013-11-05 | 15618.22 |
| 2013-11-06 | 15746.88 |
| 2013-11-07 | 15593.98 |
| 2013-11-08 | 15761.78 |
| 2013-11-11 | 15783.1 |
| 2013-11-12 | 15750.67 |
| 2013-11-13 | 15821.63 |
| 2013-11-14 | 15876.22 |
| 2013-11-15 | 15961.7 |
| 2013-11-18 | 15976.02 |
| 2013-11-19 | 15967.03 |
| 2013-11-20 | 15900.82 |
| 2013-11-21 | 16009.99 |
| 2013-11-22 | 16064.77 |
| 2013-11-25 | 16072.54 |
| 2013-11-26 | 16072.8 |
| 2013-11-27 | 16097.33 |
| 2013-11-29 | 16086.41 |
| 2013-12-02 | 16008.77 |
| 2013-12-03 | 15914.62 |
| 2013-12-04 | 15889.77 |
| 2013-12-05 | 15821.51 |
| 2013-12-06 | 16020.2 |
| 2013-12-09 | 16025.53 |
| 2013-12-10 | 15973.13 |
| 2013-12-11 | 15843.53 |
| 2013-12-12 | 15739.43 |
| 2013-12-13 | 15755.36 |
| 2013-12-16 | 15884.57 |
| 2013-12-17 | 15875.26 |
| 2013-12-18 | 16167.97 |
| 2013-12-19 | 16179.08 |
| 2013-12-20 | 16221.14 |
| 2013-12-23 | 16294.61 |
| 2013-12-24 | 16357.55 |
| 2013-12-26 | 16479.88 |
| 2013-12-27 | 16478.41 |
| 2013-12-30 | 16504.29 |
| 2013-12-31 | 16576.66 |
| 2014-01-02 | 16441.35 |
| 2014-01-03 | 16469.99 |
| 2014-01-06 | 16425.1 |
| 2014-01-07 | 16530.94 |
| 2014-01-08 | 16462.74 |
| 2014-01-09 | 16444.76 |
| 2014-01-10 | 16437.05 |
| 2014-01-13 | 16257.94 |
| 2014-01-14 | 16373.86 |
| 2014-01-15 | 16481.94 |
| 2014-01-16 | 16417.01 |
| 2014-01-17 | 16458.56 |
| 2014-01-21 | 16414.44 |
| 2014-01-22 | 16373.34 |
| 2014-01-23 | 16197.35 |
| 2014-01-24 | 15879.11 |
| 2014-01-27 | 15837.88 |
| 2014-01-28 | 15928.56 |
| 2014-01-29 | 15738.79 |
| 2014-01-30 | 15848.61 |
| 2014-01-31 | 15698.85 |
| 2014-02-03 | 15372.8 |
| 2014-02-04 | 15445.24 |
| 2014-02-05 | 15440.23 |
| 2014-02-06 | 15628.53 |
| 2014-02-07 | 15794.08 |
| 2014-02-10 | 15801.79 |
| 2014-02-11 | 15994.77 |
| 2014-02-12 | 15963.94 |
| 2014-02-13 | 16027.59 |
| 2014-02-14 | 16154.39 |
| 2014-02-18 | 16130.4 |
| 2014-02-19 | 16040.56 |
| 2014-02-20 | 16133.23 |
| 2014-02-21 | 16103.3 |
| 2014-02-24 | 16207.14 |
| 2014-02-25 | 16179.66 |
| 2014-02-26 | 16198.41 |
| 2014-02-27 | 16272.65 |
| 2014-02-28 | 16321.71 |
| 2014-03-03 | 16168.03 |
| 2014-03-04 | 16395.88 |
| 2014-03-05 | 16360.18 |
| 2014-03-06 | 16421.89 |
| 2014-03-07 | 16452.72 |
| 2014-03-10 | 16418.68 |
| 2014-03-11 | 16351.25 |
| 2014-03-12 | 16340.08 |
| 2014-03-13 | 16108.89 |
| 2014-03-14 | 16065.67 |
| 2014-03-17 | 16247.22 |
| 2014-03-18 | 16336.19 |
| 2014-03-19 | 16222.17 |
| 2014-03-20 | 16331.05 |
| 2014-03-21 | 16302.77 |
| 2014-03-24 | 16276.69 |
| 2014-03-25 | 16367.88 |
| 2014-03-26 | 16268.99 |
| 2014-03-27 | 16264.23 |
| 2014-03-28 | 16323.06 |
| 2014-03-31 | 16457.66 |
| 2014-04-01 | 16532.61 |
| 2014-04-02 | 16573 |
| 2014-04-03 | 16572.55 |
| 2014-04-04 | 16412.71 |
| 2014-04-07 | 16245.87 |
| 2014-04-08 | 16256.14 |
| 2014-04-09 | 16437.18 |
| 2014-04-10 | 16170.22 |
| 2014-04-11 | 16026.75 |
| 2014-04-14 | 16173.24 |
| 2014-04-15 | 16262.56 |
| 2014-04-16 | 16424.85 |
| 2014-04-17 | 16408.54 |
| 2014-04-21 | 16449.25 |
| 2014-04-22 | 16514.37 |
| 2014-04-23 | 16501.65 |
| 2014-04-24 | 16501.65 |
| 2014-04-25 | 16361.46 |
| 2014-04-28 | 16448.74 |
| 2014-04-29 | 16535.37 |
| 2014-04-30 | 16580.84 |
| 2014-05-01 | 16558.87 |
| 2014-05-02 | 16512.89 |
| 2014-05-05 | 16530.55 |
| 2014-05-06 | 16401.02 |
| 2014-05-07 | 16518.54 |
| 2014-05-08 | 16550.97 |
| 2014-05-09 | 16583.34 |
| 2014-05-12 | 16695.47 |
| 2014-05-13 | 16715.44 |
| 2014-05-14 | 16613.97 |
| 2014-05-15 | 16446.81 |
| 2014-05-16 | 16491.31 |
| 2014-05-19 | 16511.86 |
| 2014-05-20 | 16374.31 |
| 2014-05-21 | 16533.06 |
| 2014-05-22 | 16543.08 |
| 2014-05-23 | 16606.27 |
| 2014-05-27 | 16675.5 |
| 2014-05-28 | 16633.18 |
| 2014-05-29 | 16698.74 |
| 2014-05-30 | 16717.17 |
| 2014-06-02 | 16743.63 |
| 2014-06-03 | 16722.34 |
| 2014-06-04 | 16737.53 |
| 2014-06-05 | 16836.11 |
| 2014-06-06 | 16924.28 |
| 2014-06-09 | 16943.1 |
| 2014-06-10 | 16945.92 |
| 2014-06-11 | 16843.88 |
| 2014-06-12 | 16734.19 |
| 2014-06-13 | 16775.74 |
| 2014-06-16 | 16781.01 |
| 2014-06-17 | 16808.49 |
| 2014-06-18 | 16906.62 |
| 2014-06-19 | 16921.46 |
| 2014-06-20 | 16947.08 |
| 2014-06-23 | 16937.26 |
| 2014-06-24 | 16818.13 |
| 2014-06-25 | 16867.51 |
| 2014-06-26 | 16846.13 |
| 2014-06-27 | 16851.84 |
| 2014-06-30 | 16826.6 |
| 2014-07-01 | 16956.07 |
| 2014-07-02 | 16976.24 |
| 2014-07-03 | 17068.26 |
| 2014-07-07 | 17024.21 |
| 2014-07-08 | 16906.62 |
| 2014-07-09 | 16985.61 |
| 2014-07-10 | 16915.07 |
| 2014-07-11 | 16943.81 |
| 2014-07-14 | 17055.42 |
| 2014-07-15 | 17060.68 |
| 2014-07-16 | 17138.2 |
| 2014-07-17 | 16976.81 |
| 2014-07-18 | 17100.18 |
| 2014-07-21 | 17051.73 |
| 2014-07-22 | 17113.54 |
| 2014-07-23 | 17086.63 |
| 2014-07-24 | 17083.8 |
| 2014-07-25 | 16960.57 |
| 2014-07-28 | 16982.59 |
| 2014-07-29 | 16912.11 |
| 2014-07-30 | 16880.36 |
| 2014-07-31 | 16563.3 |
| 2014-08-01 | 16493.37 |
| 2014-08-04 | 16569.28 |
| 2014-08-05 | 16429.47 |
| 2014-08-06 | 16443.34 |
| 2014-08-07 | 16368.27 |
| 2014-08-08 | 16553.93 |
| 2014-08-11 | 16569.98 |
| 2014-08-12 | 16560.54 |
| 2014-08-13 | 16651.8 |
| 2014-08-14 | 16713.58 |
| 2014-08-15 | 16662.91 |
| 2014-08-18 | 16838.74 |
| 2014-08-19 | 16919.59 |
| 2014-08-20 | 16979.13 |
| 2014-08-21 | 17039.49 |
| 2014-08-22 | 17001.22 |
| 2014-08-25 | 17076.87 |
| 2014-08-26 | 17106.7 |
| 2014-08-27 | 17122.01 |
| 2014-08-28 | 17079.57 |
| 2014-08-29 | 17098.45 |
| 2014-09-02 | 17067.56 |
| 2014-09-03 | 17078.28 |
| 2014-09-04 | 17069.58 |
| 2014-09-05 | 17137.36 |
| 2014-09-08 | 17111.42 |
| 2014-09-09 | 17013.87 |
| 2014-09-10 | 17068.71 |
| 2014-09-11 | 17049 |
| 2014-09-12 | 16987.51 |
| 2014-09-15 | 17031.14 |
| 2014-09-16 | 17131.97 |
| 2014-09-17 | 17156.85 |
| 2014-09-18 | 17265.99 |
| 2014-09-19 | 17279.74 |
| 2014-09-22 | 17172.68 |
| 2014-09-23 | 17055.87 |
| 2014-09-24 | 17210.06 |
| 2014-09-25 | 16945.8 |
| 2014-09-26 | 17113.15 |
| 2014-09-29 | 17071.22 |
| 2014-09-30 | 17042.9 |
| 2014-10-01 | 16804.71 |
| 2014-10-02 | 16801.05 |
| 2014-10-03 | 17009.69 |
| 2014-10-06 | 16991.91 |
| 2014-10-07 | 16719.39 |
| 2014-10-08 | 16994.22 |
| 2014-10-09 | 16659.25 |
| 2014-10-10 | 16544.1 |
| 2014-10-13 | 16321.07 |
| 2014-10-14 | 16315.19 |
| 2014-10-15 | 16141.74 |
| 2014-10-16 | 16117.24 |
| 2014-10-17 | 16380.41 |
| 2014-10-20 | 16399.67 |
| 2014-10-21 | 16614.81 |
| 2014-10-22 | 16461.32 |
| 2014-10-23 | 16677.9 |
| 2014-10-24 | 16805.41 |
| 2014-10-27 | 16817.94 |
| 2014-10-28 | 17005.75 |
| 2014-10-29 | 16974.31 |
| 2014-10-30 | 17195.42 |
| 2014-10-31 | 17390.52 |
| 2014-11-03 | 17366.24 |
| 2014-11-04 | 17383.84 |
| 2014-11-05 | 17484.53 |
| 2014-11-06 | 17554.47 |
| 2014-11-07 | 17573.93 |
| 2014-11-10 | 17613.74 |
| 2014-11-11 | 17614.9 |
| 2014-11-12 | 17612.2 |
| 2014-11-13 | 17652.79 |
| 2014-11-14 | 17634.74 |
| 2014-11-17 | 17647.75 |
| 2014-11-18 | 17687.82 |
| 2014-11-19 | 17685.73 |
| 2014-11-20 | 17719 |
| 2014-11-21 | 17810.06 |
| 2014-11-24 | 17817.9 |
| 2014-11-25 | 17814.94 |
| 2014-11-26 | 17827.75 |
| 2014-11-28 | 17828.24 |
| 2014-12-01 | 17776.8 |
| 2014-12-02 | 17879.55 |
| 2014-12-03 | 17912.62 |
| 2014-12-04 | 17900.1 |
| 2014-12-05 | 17958.79 |
| 2014-12-08 | 17852.48 |
| 2014-12-09 | 17801.2 |
| 2014-12-10 | 17533.15 |
| 2014-12-11 | 17596.34 |
| 2014-12-12 | 17280.83 |
| 2014-12-15 | 17180.84 |
| 2014-12-16 | 17068.87 |
| 2014-12-17 | 17356.87 |
| 2014-12-18 | 17778.15 |
| 2014-12-19 | 17804.8 |
| 2014-12-22 | 17959.44 |
| 2014-12-23 | 18024.17 |
| 2014-12-24 | 18030.21 |
| 2014-12-26 | 18053.71 |
| 2014-12-29 | 18038.23 |
| 2014-12-30 | 17983.07 |
| 2014-12-31 | 17823.07 |
| 2015-01-02 | 17832.99 |
| 2015-01-05 | 17501.65 |
| 2015-01-06 | 17371.64 |
| 2015-01-07 | 17584.52 |
| 2015-01-08 | 17907.87 |
| 2015-01-09 | 17737.37 |
| 2015-01-12 | 17640.84 |
| 2015-01-13 | 17613.68 |
| 2015-01-14 | 17427.09 |
| 2015-01-15 | 17320.71 |
| 2015-01-16 | 17511.57 |
| 2015-01-20 | 17515.23 |
| 2015-01-21 | 17554.28 |
| 2015-01-22 | 17813.98 |
| 2015-01-23 | 17672.6 |
| 2015-01-26 | 17678.7 |
| 2015-01-27 | 17387.21 |
| 2015-01-28 | 17191.37 |
| 2015-01-29 | 17416.85 |
| 2015-01-30 | 17164.95 |
| 2015-02-02 | 17361.04 |
| 2015-02-03 | 17666.4 |
| 2015-02-04 | 17673.02 |
| 2015-02-05 | 17884.88 |
| 2015-02-06 | 17824.29 |
| 2015-02-09 | 17729.21 |
| 2015-02-10 | 17868.76 |
| 2015-02-11 | 17862.14 |
| 2015-02-12 | 17972.38 |
| 2015-02-13 | 18019.35 |
| 2015-02-17 | 18047.58 |
| 2015-02-18 | 18029.85 |
| 2015-02-19 | 17985.77 |
| 2015-02-20 | 18140.44 |
| 2015-02-23 | 18116.84 |
| 2015-02-24 | 18209.19 |
| 2015-02-25 | 18224.57 |
| 2015-02-26 | 18214.42 |
| 2015-02-27 | 18132.7 |
| 2015-03-02 | 18288.63 |
| 2015-03-03 | 18203.37 |
| 2015-03-04 | 18096.9 |
| 2015-03-05 | 18135.72 |
| 2015-03-06 | 17856.78 |
| 2015-03-09 | 17995.72 |
| 2015-03-10 | 17662.94 |
| 2015-03-11 | 17635.39 |
| 2015-03-12 | 17895.22 |
| 2015-03-13 | 17749.31 |
| 2015-03-16 | 17977.42 |
| 2015-03-17 | 17849.08 |
| 2015-03-18 | 18076.19 |
| 2015-03-19 | 17959.03 |
| 2015-03-20 | 18127.65 |
| 2015-03-23 | 18116.04 |
| 2015-03-24 | 18011.14 |
| 2015-03-25 | 17718.54 |
| 2015-03-26 | 17678.23 |
| 2015-03-27 | 17712.66 |
| 2015-03-30 | 17976.31 |
| 2015-03-31 | 17776.12 |
| 2015-04-01 | 17698.18 |
| 2015-04-02 | 17763.24 |
| 2015-04-06 | 17880.85 |
| 2015-04-07 | 17875.42 |
| 2015-04-08 | 17902.51 |
| 2015-04-09 | 17958.73 |
| 2015-04-10 | 18057.65 |
| 2015-04-13 | 17977.04 |
| 2015-04-14 | 18036.7 |
| 2015-04-15 | 18112.61 |
| 2015-04-16 | 18105.77 |
| 2015-04-17 | 17826.3 |
| 2015-04-20 | 18034.93 |
| 2015-04-21 | 17949.59 |
| 2015-04-22 | 18038.27 |
| 2015-04-23 | 18058.69 |
| 2015-04-24 | 18080.14 |
| 2015-04-27 | 18037.97 |
| 2015-04-28 | 18110.14 |
| 2015-04-29 | 18035.53 |
| 2015-04-30 | 17840.52 |
| 2015-05-01 | 18024.06 |
| 2015-05-04 | 18070.4 |
| 2015-05-05 | 17928.2 |
| 2015-05-06 | 17841.98 |
| 2015-05-07 | 17924.06 |
| 2015-05-08 | 18191.11 |
| 2015-05-11 | 18105.17 |
| 2015-05-12 | 18068.23 |
| 2015-05-13 | 18060.49 |
| 2015-05-14 | 18252.24 |
| 2015-05-15 | 18272.56 |
| 2015-05-18 | 18298.88 |
| 2015-05-19 | 18312.39 |
| 2015-05-20 | 18285.4 |
| 2015-05-21 | 18285.74 |
| 2015-05-22 | 18232.02 |
| 2015-05-26 | 18041.54 |
| 2015-05-27 | 18162.99 |
| 2015-05-28 | 18126.12 |
| 2015-05-29 | 18010.68 |
| 2015-06-01 | 18040.37 |
| 2015-06-02 | 18011.94 |
| 2015-06-03 | 18076.27 |
| 2015-06-04 | 17905.58 |
| 2015-06-05 | 17849.46 |
| 2015-06-08 | 17766.55 |
| 2015-06-09 | 17764.04 |
| 2015-06-10 | 18000.4 |
| 2015-06-11 | 18039.37 |
| 2015-06-12 | 17898.84 |
| 2015-06-15 | 17791.17 |
| 2015-06-16 | 17904.48 |
| 2015-06-17 | 17935.74 |
| 2015-06-18 | 18115.84 |
| 2015-06-19 | 18015.95 |
| 2015-06-22 | 18119.78 |
| 2015-06-23 | 18144.07 |
| 2015-06-24 | 17966.07 |
| 2015-06-25 | 17890.36 |
| 2015-06-26 | 17946.68 |
| 2015-06-29 | 17596.35 |
| 2015-06-30 | 17619.51 |
| 2015-07-01 | 17757.91 |
| 2015-07-02 | 17730.11 |
| 2015-07-06 | 17683.58 |
| 2015-07-07 | 17776.91 |
| 2015-07-08 | 17515.42 |
| 2015-07-09 | 17548.62 |
| 2015-07-10 | 17760.41 |
| 2015-07-13 | 17977.68 |
| 2015-07-14 | 18053.58 |
| 2015-07-15 | 18050.17 |
| 2015-07-16 | 18120.25 |
| 2015-07-17 | 18086.45 |
| 2015-07-20 | 18100.41 |
| 2015-07-21 | 17919.29 |
| 2015-07-22 | 17851.04 |
| 2015-07-23 | 17731.92 |
| 2015-07-24 | 17568.53 |
| 2015-07-27 | 17440.59 |
| 2015-07-28 | 17630.27 |
| 2015-07-29 | 17751.39 |
| 2015-07-30 | 17745.98 |
| 2015-07-31 | 17689.86 |
| 2015-08-03 | 17598.2 |
| 2015-08-04 | 17550.69 |
| 2015-08-05 | 17540.47 |
| 2015-08-06 | 17419.75 |
| 2015-08-07 | 17373.38 |
| 2015-08-10 | 17615.17 |
| 2015-08-11 | 17402.84 |
| 2015-08-12 | 17402.51 |
| 2015-08-13 | 17408.25 |
| 2015-08-14 | 17477.4 |
| 2015-08-17 | 17545.18 |
| 2015-08-18 | 17511.34 |
| 2015-08-19 | 17348.73 |
| 2015-08-20 | 16990.69 |
| 2015-08-21 | 16459.75 |
| 2015-08-24 | 15871.35 |
| 2015-08-25 | 15666.44 |
| 2015-08-26 | 16285.51 |
| 2015-08-27 | 16654.77 |
| 2015-08-28 | 16643.01 |
| 2015-08-31 | 16528.03 |
| 2015-09-01 | 16058.35 |
| 2015-09-02 | 16351.38 |
| 2015-09-03 | 16374.76 |
| 2015-09-04 | 16102.38 |
| 2015-09-08 | 16492.68 |
| 2015-09-09 | 16253.57 |
| 2015-09-10 | 16330.4 |
| 2015-09-11 | 16433.09 |
| 2015-09-14 | 16370.96 |
| 2015-09-15 | 16599.85 |
| 2015-09-16 | 16739.95 |
| 2015-09-17 | 16674.74 |
| 2015-09-18 | 16384.58 |
| 2015-09-21 | 16510.19 |
| 2015-09-22 | 16330.47 |
| 2015-09-23 | 16279.89 |
| 2015-09-24 | 16201.32 |
| 2015-09-25 | 16314.67 |
| 2015-09-28 | 16001.89 |
| 2015-09-29 | 16049.13 |
| 2015-09-30 | 16284.7 |
| 2015-10-01 | 16272.01 |
| 2015-10-02 | 16472.37 |
| 2015-10-05 | 16776.43 |
| 2015-10-06 | 16790.19 |
| 2015-10-07 | 16912.29 |
| 2015-10-08 | 17050.75 |
| 2015-10-09 | 17084.49 |
| 2015-10-12 | 17131.86 |
| 2015-10-13 | 17081.89 |
| 2015-10-14 | 16924.75 |
| 2015-10-15 | 17141.75 |
| 2015-10-16 | 17215.97 |
| 2015-10-19 | 17230.54 |
| 2015-10-20 | 17217.11 |
| 2015-10-21 | 17168.61 |
| 2015-10-22 | 17489.16 |
| 2015-10-23 | 17646.7 |
| 2015-10-26 | 17623.05 |
| 2015-10-27 | 17581.43 |
| 2015-10-28 | 17779.52 |
| 2015-10-29 | 17755.8 |
| 2015-10-30 | 17663.54 |
| 2015-11-02 | 17828.76 |
| 2015-11-03 | 17918.15 |
| 2015-11-04 | 17867.58 |
| 2015-11-05 | 17863.43 |
| 2015-11-06 | 17910.33 |
| 2015-11-09 | 17730.48 |
| 2015-11-10 | 17758.21 |
| 2015-11-11 | 17702.22 |
| 2015-11-12 | 17448.07 |
| 2015-11-13 | 17245.24 |
| 2015-11-16 | 17483.01 |
| 2015-11-17 | 17489.5 |
| 2015-11-18 | 17737.16 |
| 2015-11-19 | 17732.75 |
| 2015-11-20 | 17823.81 |
| 2015-11-23 | 17792.68 |
| 2015-11-24 | 17812.19 |
| 2015-11-25 | 17813.39 |
| 2015-11-27 | 17798.49 |
| 2015-11-30 | 17719.92 |
| 2015-12-01 | 17888.35 |
| 2015-12-02 | 17729.68 |
| 2015-12-03 | 17477.67 |
| 2015-12-04 | 17847.63 |
| 2015-12-07 | 17730.51 |
| 2015-12-08 | 17568 |
| 2015-12-09 | 17492.3 |
| 2015-12-10 | 17574.75 |
| 2015-12-11 | 17265.21 |
| 2015-12-14 | 17368.5 |
| 2015-12-15 | 17524.91 |
| 2015-12-16 | 17749.09 |
| 2015-12-17 | 17495.84 |
| 2015-12-18 | 17128.55 |
| 2015-12-21 | 17251.62 |
| 2015-12-22 | 17417.27 |
| 2015-12-23 | 17602.61 |
| 2015-12-24 | 17552.17 |
| 2015-12-28 | 17528.27 |
| 2015-12-29 | 17720.98 |
| 2015-12-30 | 17603.87 |
| 2015-12-31 | 17425.03 |
| 2016-01-04 | 17148.94 |
| 2016-01-05 | 17158.66 |
| 2016-01-06 | 16906.51 |
| 2016-01-07 | 16514.1 |
| 2016-01-08 | 16346.45 |
| 2016-01-11 | 16398.57 |
| 2016-01-12 | 16516.22 |
| 2016-01-13 | 16151.41 |
| 2016-01-14 | 16379.05 |
| 2016-01-15 | 15988.08 |
| 2016-01-19 | 16016.02 |
| 2016-01-20 | 15766.74 |
| 2016-01-21 | 15882.68 |
| 2016-01-22 | 16093.51 |
| 2016-01-25 | 15885.22 |
| 2016-01-26 | 16167.23 |
| 2016-01-27 | 15944.46 |
| 2016-01-28 | 16069.64 |
| 2016-01-29 | 16466.3 |
| 2016-02-01 | 16449.18 |
| 2016-02-02 | 16153.54 |
| 2016-02-03 | 16336.66 |
| 2016-02-04 | 16416.58 |
| 2016-02-05 | 16204.97 |
| 2016-02-08 | 16027.05 |
| 2016-02-09 | 16014.38 |
| 2016-02-10 | 15914.74 |
| 2016-02-11 | 15660.18 |
| 2016-02-12 | 15973.84 |
| 2016-02-16 | 16196.41 |
| 2016-02-17 | 16453.83 |
| 2016-02-18 | 16413.43 |
| 2016-02-19 | 16391.99 |
| 2016-02-22 | 16620.66 |
| 2016-02-23 | 16431.78 |
| 2016-02-24 | 16484.99 |
| 2016-02-25 | 16697.29 |
| 2016-02-26 | 16639.97 |
| 2016-02-29 | 16516.5 |
| 2016-03-01 | 16865.08 |
| 2016-03-02 | 16899.32 |
| 2016-03-03 | 16943.9 |
| 2016-03-04 | 17006.77 |
| 2016-03-07 | 17073.95 |
| 2016-03-08 | 16964.1 |
| 2016-03-09 | 17000.36 |
| 2016-03-10 | 16995.13 |
| 2016-03-11 | 17213.31 |
| 2016-03-14 | 17229.13 |
| 2016-03-15 | 17251.53 |
| 2016-03-16 | 17325.76 |
| 2016-03-17 | 17481.49 |
| 2016-03-18 | 17602.3 |
| 2016-03-21 | 17623.87 |
| 2016-03-22 | 17582.57 |
| 2016-03-23 | 17502.59 |
| 2016-03-24 | 17515.73 |
| 2016-03-28 | 17535.39 |
| 2016-03-29 | 17633.11 |
| 2016-03-30 | 17716.66 |
| 2016-03-31 | 17685.09 |
| 2016-04-01 | 17792.75 |
| 2016-04-04 | 17737 |
| 2016-04-05 | 17603.32 |
| 2016-04-06 | 17716.05 |
| 2016-04-07 | 17541.96 |
| 2016-04-08 | 17576.96 |
| 2016-04-11 | 17556.41 |
| 2016-04-12 | 17721.25 |
| 2016-04-13 | 17908.28 |
| 2016-04-14 | 17926.43 |
| 2016-04-15 | 17897.46 |
| 2016-04-18 | 18004.16 |
| 2016-04-19 | 18053.6 |
| 2016-04-20 | 18096.27 |
| 2016-04-21 | 17982.52 |
| 2016-04-22 | 18003.75 |
| 2016-04-25 | 17977.24 |
| 2016-04-26 | 17990.32 |
| 2016-04-27 | 18041.55 |
| 2016-04-28 | 17830.76 |
| 2016-04-29 | 17773.64 |
| 2016-05-02 | 17891.16 |
| 2016-05-03 | 17750.91 |
| 2016-05-04 | 17651.26 |
| 2016-05-05 | 17660.71 |
| 2016-05-06 | 17740.63 |
| 2016-05-09 | 17705.91 |
| 2016-05-10 | 17928.35 |
| 2016-05-11 | 17711.12 |
| 2016-05-12 | 17720.5 |
| 2016-05-13 | 17535.32 |
| 2016-05-16 | 17710.71 |
| 2016-05-17 | 17529.98 |
| 2016-05-18 | 17526.62 |
| 2016-05-19 | 17435.4 |
| 2016-05-20 | 17500.94 |
| 2016-05-23 | 17492.93 |
| 2016-05-24 | 17706.05 |
| 2016-05-25 | 17851.51 |
| 2016-05-26 | 17828.29 |
| 2016-05-27 | 17873.22 |
| 2016-05-31 | 17787.2 |
| 2016-06-01 | 17789.67 |
| 2016-06-02 | 17838.56 |
| 2016-06-03 | 17807.06 |
| 2016-06-06 | 17920.33 |
| 2016-06-07 | 17938.28 |
| 2016-06-08 | 18005.05 |
| 2016-06-09 | 17985.19 |
| 2016-06-10 | 17865.34 |
| 2016-06-13 | 17732.48 |
| 2016-06-14 | 17674.82 |
| 2016-06-15 | 17640.17 |
| 2016-06-16 | 17733.1 |
| 2016-06-17 | 17675.16 |
| 2016-06-20 | 17804.87 |
| 2016-06-21 | 17829.73 |
| 2016-06-22 | 17780.83 |
| 2016-06-23 | 18011.07 |
| 2016-06-24 | 17400.75 |
| 2016-06-27 | 17140.24 |
| 2016-06-28 | 17409.72 |
| 2016-06-29 | 17694.68 |
| 2016-06-30 | 17929.99 |
| 2016-07-01 | 17949.37 |
| 2016-07-05 | 17840.62 |
| 2016-07-06 | 17918.62 |
| 2016-07-07 | 17895.88 |
| 2016-07-08 | 18146.74 |
| 2016-07-11 | 18226.93 |
| 2016-07-12 | 18347.67 |
| 2016-07-13 | 18372.12 |
| 2016-07-14 | 18506.41 |
| 2016-07-15 | 18516.55 |
| 2016-07-18 | 18533.05 |
| 2016-07-19 | 18559.01 |
| 2016-07-20 | 18595.03 |
| 2016-07-21 | 18517.23 |
| 2016-07-22 | 18570.85 |
| 2016-07-25 | 18493.06 |
| 2016-07-26 | 18473.75 |
| 2016-07-27 | 18472.17 |
| 2016-07-28 | 18456.35 |
| 2016-07-29 | 18432.24 |
| 2016-08-01 | 18404.51 |
| 2016-08-02 | 18313.77 |
| 2016-08-03 | 18355 |
| 2016-08-04 | 18352.05 |
| 2016-08-05 | 18543.53 |
| 2016-08-08 | 18529.29 |
| 2016-08-09 | 18533.05 |
| 2016-08-10 | 18495.66 |
| 2016-08-11 | 18613.52 |
| 2016-08-12 | 18576.47 |
| 2016-08-15 | 18636.05 |
| 2016-08-16 | 18552.02 |
| 2016-08-17 | 18573.94 |
| 2016-08-18 | 18597.7 |
| 2016-08-19 | 18552.57 |
| 2016-08-22 | 18529.42 |
| 2016-08-23 | 18547.3 |
| 2016-08-24 | 18481.48 |
| 2016-08-25 | 18448.41 |
| 2016-08-26 | 18395.4 |
| 2016-08-29 | 18502.99 |
| 2016-08-30 | 18454.3 |
| 2016-08-31 | 18400.88 |
| 2016-09-01 | 18419.3 |
| 2016-09-02 | 18491.96 |
| 2016-09-06 | 18538.12 |
| 2016-09-07 | 18526.14 |
| 2016-09-08 | 18479.91 |
| 2016-09-09 | 18085.45 |
| 2016-09-12 | 18325.07 |
| 2016-09-13 | 18066.75 |
| 2016-09-14 | 18034.77 |
| 2016-09-15 | 18212.48 |
| 2016-09-16 | 18123.8 |
| 2016-09-19 | 18120.17 |
| 2016-09-20 | 18129.96 |
| 2016-09-21 | 18293.7 |
| 2016-09-22 | 18392.46 |
| 2016-09-23 | 18261.45 |
| 2016-09-26 | 18094.83 |
| 2016-09-27 | 18228.3 |
| 2016-09-28 | 18339.24 |
| 2016-09-29 | 18143.45 |
| 2016-09-30 | 18308.15 |
| 2016-10-03 | 18253.85 |
| 2016-10-04 | 18168.45 |
| 2016-10-05 | 18281.03 |
| 2016-10-06 | 18268.5 |
| 2016-10-07 | 18240.49 |
| 2016-10-10 | 18329.04 |
| 2016-10-11 | 18128.66 |
| 2016-10-12 | 18144.2 |
| 2016-10-13 | 18098.94 |
| 2016-10-14 | 18138.38 |
| 2016-10-17 | 18086.4 |
| 2016-10-18 | 18161.94 |
| 2016-10-19 | 18202.62 |
| 2016-10-20 | 18162.35 |
| 2016-10-21 | 18145.71 |
| 2016-10-24 | 18223.03 |
| 2016-10-25 | 18169.27 |
| 2016-10-26 | 18199.33 |
| 2016-10-27 | 18169.68 |
| 2016-10-28 | 18161.19 |
| 2016-10-31 | 18142.42 |
| 2016-11-01 | 18037.1 |
| 2016-11-02 | 17959.64 |
| 2016-11-03 | 17930.67 |
| 2016-11-04 | 17888.28 |
| 2016-11-07 | 18259.6 |
| 2016-11-08 | 18332.74 |
| 2016-11-09 | 18589.69 |
| 2016-11-10 | 18807.88 |
| 2016-11-11 | 18847.66 |
| 2016-11-14 | 18868.69 |
| 2016-11-15 | 18923.06 |
| 2016-11-16 | 18868.14 |
| 2016-11-17 | 18903.82 |
| 2016-11-18 | 18867.93 |
| 2016-11-21 | 18956.69 |
| 2016-11-22 | 19023.87 |
| 2016-11-23 | 19083.18 |
| 2016-11-25 | 19152.14 |
| 2016-11-28 | 19097.9 |
| 2016-11-29 | 19121.6 |
| 2016-11-30 | 19123.58 |
| 2016-12-01 | 19191.93 |
| 2016-12-02 | 19170.42 |
| 2016-12-05 | 19216.24 |
| 2016-12-06 | 19251.78 |
| 2016-12-07 | 19549.62 |
| 2016-12-08 | 19614.81 |
| 2016-12-09 | 19756.85 |
| 2016-12-12 | 19796.43 |
| 2016-12-13 | 19911.21 |
| 2016-12-14 | 19792.53 |
| 2016-12-15 | 19852.24 |
| 2016-12-16 | 19843.41 |
| 2016-12-19 | 19883.06 |
| 2016-12-20 | 19974.62 |
| 2016-12-21 | 19941.96 |
| 2016-12-22 | 19918.88 |
| 2016-12-23 | 19933.81 |
| 2016-12-27 | 19945.04 |
| 2016-12-28 | 19833.68 |
| 2016-12-29 | 19819.78 |
| 2016-12-30 | 19762.6 |
| 2017-01-03 | 19881.76 |
| 2017-01-04 | 19942.16 |
| 2017-01-05 | 19899.29 |
| 2017-01-06 | 19963.8 |
| 2017-01-09 | 19887.38 |
| 2017-01-10 | 19855.53 |
| 2017-01-11 | 19954.28 |
| 2017-01-12 | 19891 |
| 2017-01-13 | 19885.73 |
| 2017-01-17 | 19826.77 |
| 2017-01-18 | 19804.72 |
| 2017-01-19 | 19732.4 |
| 2017-01-20 | 19827.25 |
| 2017-01-23 | 19799.85 |
| 2017-01-24 | 19912.71 |
| 2017-01-25 | 20068.51 |
| 2017-01-26 | 20100.91 |
| 2017-01-27 | 20093.78 |
| 2017-01-30 | 19971.13 |
| 2017-01-31 | 19864.09 |
| 2017-02-01 | 19890.94 |
| 2017-02-02 | 19884.91 |
| 2017-02-03 | 20071.46 |
| 2017-02-06 | 20052.42 |
| 2017-02-07 | 20090.29 |
| 2017-02-08 | 20054.34 |
| 2017-02-09 | 20172.4 |
| 2017-02-10 | 20269.37 |
| 2017-02-13 | 20412.16 |
| 2017-02-14 | 20504.41 |
| 2017-02-15 | 20611.86 |
| 2017-02-16 | 20619.77 |
| 2017-02-17 | 20624.05 |
| 2017-02-21 | 20743 |
| 2017-02-22 | 20775.6 |
| 2017-02-23 | 20810.32 |
| 2017-02-24 | 20821.76 |
| 2017-02-27 | 20837.44 |
| 2017-02-28 | 20812.24 |
| 2017-03-01 | 21115.55 |
| 2017-03-02 | 21002.97 |
| 2017-03-03 | 21005.71 |
| 2017-03-06 | 20954.34 |
| 2017-03-07 | 20924.76 |
| 2017-03-08 | 20855.73 |
| 2017-03-09 | 20858.19 |
| 2017-03-10 | 20902.98 |
| 2017-03-13 | 20881.48 |
| 2017-03-14 | 20837.37 |
| 2017-03-15 | 20950.1 |
| 2017-03-16 | 20934.55 |
| 2017-03-17 | 20914.62 |
| 2017-03-20 | 20905.86 |
| 2017-03-21 | 20668.01 |
| 2017-03-22 | 20661.3 |
| 2017-03-23 | 20656.58 |
| 2017-03-24 | 20596.72 |
| 2017-03-27 | 20550.98 |
| 2017-03-28 | 20701.5 |
| 2017-03-29 | 20659.32 |
| 2017-03-30 | 20728.49 |
| 2017-03-31 | 20663.22 |
| 2017-04-03 | 20650.21 |
| 2017-04-04 | 20689.24 |
| 2017-04-05 | 20648.15 |
| 2017-04-06 | 20662.95 |
| 2017-04-07 | 20656.1 |
| 2017-04-10 | 20658.02 |
| 2017-04-11 | 20651.3 |
| 2017-04-12 | 20591.86 |
| 2017-04-13 | 20453.25 |
| 2017-04-17 | 20636.92 |
| 2017-04-18 | 20523.28 |
| 2017-04-19 | 20404.49 |
| 2017-04-20 | 20578.71 |
| 2017-04-21 | 20547.76 |
| 2017-04-24 | 20763.89 |
| 2017-04-25 | 20996.12 |
| 2017-04-26 | 20975.09 |
| 2017-04-27 | 20981.33 |
| 2017-04-28 | 20940.51 |
| 2017-05-01 | 20913.46 |
| 2017-05-02 | 20949.89 |
| 2017-05-03 | 20957.9 |
| 2017-05-04 | 20951.47 |
| 2017-05-05 | 21006.94 |
| 2017-05-08 | 21012.28 |
| 2017-05-09 | 20975.78 |
| 2017-05-10 | 20943.11 |
| 2017-05-11 | 20919.42 |
| 2017-05-12 | 20896.61 |
| 2017-05-15 | 20981.94 |
| 2017-05-16 | 20979.75 |
| 2017-05-17 | 20606.93 |
| 2017-05-18 | 20663.02 |
| 2017-05-19 | 20804.84 |
| 2017-05-22 | 20894.83 |
| 2017-05-23 | 20937.91 |
| 2017-05-24 | 21012.42 |
| 2017-05-25 | 21082.95 |
| 2017-05-26 | 21080.28 |
| 2017-05-30 | 21029.47 |
| 2017-05-31 | 21008.65 |
| 2017-06-01 | 21144.18 |
| 2017-06-02 | 21206.29 |
| 2017-06-05 | 21184.04 |
| 2017-06-06 | 21136.23 |
| 2017-06-07 | 21173.69 |
| 2017-06-08 | 21182.53 |
| 2017-06-09 | 21271.97 |
| 2017-06-12 | 21235.67 |
| 2017-06-13 | 21328.47 |
| 2017-06-14 | 21374.56 |
| 2017-06-15 | 21359.9 |
| 2017-06-16 | 21384.28 |
| 2017-06-19 | 21528.99 |
| 2017-06-20 | 21467.14 |
| 2017-06-21 | 21410.03 |
| 2017-06-22 | 21397.29 |
| 2017-06-23 | 21394.76 |
| 2017-06-26 | 21409.55 |
| 2017-06-27 | 21310.66 |
| 2017-06-28 | 21454.61 |
| 2017-06-29 | 21287.03 |
| 2017-06-30 | 21349.63 |
| 2017-07-03 | 21479.27 |
| 2017-07-05 | 21478.17 |
| 2017-07-06 | 21320.04 |
| 2017-07-07 | 21414.34 |
| 2017-07-10 | 21408.52 |
| 2017-07-11 | 21409.07 |
| 2017-07-12 | 21532.14 |
| 2017-07-13 | 21553.09 |
| 2017-07-14 | 21637.74 |
| 2017-07-17 | 21629.72 |
| 2017-07-18 | 21574.73 |
| 2017-07-19 | 21640.75 |
| 2017-07-20 | 21611.78 |
| 2017-07-21 | 21580.07 |
| 2017-07-24 | 21513.17 |
| 2017-07-25 | 21613.43 |
| 2017-07-26 | 21711.01 |
| 2017-07-27 | 21796.55 |
| 2017-07-28 | 21830.31 |
| 2017-07-31 | 21891.12 |
| 2017-08-01 | 21963.92 |
| 2017-08-02 | 22016.24 |
| 2017-08-03 | 22026.1 |
| 2017-08-04 | 22092.81 |
| 2017-08-07 | 22118.42 |
| 2017-08-08 | 22085.34 |
| 2017-08-09 | 22048.7 |
| 2017-08-10 | 21844.01 |
| 2017-08-11 | 21858.32 |
| 2017-08-14 | 21993.71 |
| 2017-08-15 | 21998.99 |
| 2017-08-16 | 22024.87 |
| 2017-08-17 | 21750.73 |
| 2017-08-18 | 21674.51 |
| 2017-08-21 | 21703.75 |
| 2017-08-22 | 21899.89 |
| 2017-08-23 | 21812.09 |
| 2017-08-24 | 21783.4 |
| 2017-08-25 | 21813.67 |
| 2017-08-28 | 21808.4 |
| 2017-08-29 | 21865.37 |
| 2017-08-30 | 21892.43 |
| 2017-08-31 | 21948.1 |
| 2017-09-01 | 21987.56 |
| 2017-09-05 | 21753.31 |
| 2017-09-06 | 21807.64 |
| 2017-09-07 | 21784.78 |
| 2017-09-08 | 21797.79 |
| 2017-09-11 | 22057.37 |
| 2017-09-12 | 22118.86 |
| 2017-09-13 | 22158.18 |
| 2017-09-14 | 22203.48 |
| 2017-09-15 | 22268.34 |
| 2017-09-18 | 22331.35 |
| 2017-09-19 | 22370.8 |
| 2017-09-20 | 22412.59 |
| 2017-09-21 | 22359.23 |
| 2017-09-22 | 22349.59 |
| 2017-09-25 | 22296.09 |
| 2017-09-26 | 22284.32 |
| 2017-09-27 | 22340.71 |
| 2017-09-28 | 22381.2 |
| 2017-09-29 | 22405.09 |
| 2017-10-02 | 22557.6 |
| 2017-10-03 | 22641.67 |
| 2017-10-04 | 22661.64 |
| 2017-10-05 | 22775.39 |
| 2017-10-06 | 22773.67 |
| 2017-10-09 | 22761.07 |
| 2017-10-10 | 22830.68 |
| 2017-10-11 | 22872.89 |
| 2017-10-12 | 22841.01 |
| 2017-10-13 | 22871.72 |
| 2017-10-16 | 22956.96 |
| 2017-10-17 | 22997.44 |
| 2017-10-18 | 23157.6 |
| 2017-10-19 | 23163.04 |
| 2017-10-20 | 23328.63 |
| 2017-10-23 | 23273.96 |
| 2017-10-24 | 23441.76 |
| 2017-10-25 | 23329.46 |
| 2017-10-26 | 23400.86 |
| 2017-10-27 | 23434.19 |
| 2017-10-30 | 23348.74 |
| 2017-10-31 | 23377.24 |
| 2017-11-01 | 23435.01 |
| 2017-11-02 | 23516.26 |
| 2017-11-03 | 23539.19 |
| 2017-11-06 | 23548.42 |
| 2017-11-07 | 23557.23 |
| 2017-11-08 | 23563.36 |
| 2017-11-09 | 23461.94 |
| 2017-11-10 | 23422.21 |
| 2017-11-13 | 23439.7 |
| 2017-11-14 | 23409.47 |
| 2017-11-15 | 23271.28 |
| 2017-11-16 | 23458.36 |
| 2017-11-17 | 23358.24 |
| 2017-11-20 | 23430.33 |
| 2017-11-21 | 23590.83 |
| 2017-11-22 | 23526.18 |
| 2017-11-24 | 23557.99 |
| 2017-11-27 | 23580.78 |
| 2017-11-28 | 23836.71 |
| 2017-11-29 | 23940.68 |
| 2017-11-30 | 24272.35 |
| 2017-12-01 | 24231.59 |
| 2017-12-04 | 24290.05 |
| 2017-12-05 | 24180.64 |
| 2017-12-06 | 24140.91 |
| 2017-12-07 | 24211.48 |
| 2017-12-08 | 24329.16 |
| 2017-12-11 | 24386.03 |
| 2017-12-12 | 24504.8 |
| 2017-12-13 | 24585.43 |
| 2017-12-14 | 24508.66 |
| 2017-12-15 | 24651.74 |
| 2017-12-18 | 24792.2 |
| 2017-12-19 | 24754.75 |
| 2017-12-20 | 24726.65 |
| 2017-12-21 | 24782.29 |
| 2017-12-22 | 24754.06 |
| 2017-12-26 | 24746.21 |
| 2017-12-27 | 24774.3 |
| 2017-12-28 | 24837.51 |
| 2017-12-29 | 24719.22 |
| 2018-01-02 | 24824.01 |
| 2018-01-03 | 24922.68 |
| 2018-01-04 | 25075.13 |
| 2018-01-05 | 25295.87 |
| 2018-01-08 | 25283 |
| 2018-01-09 | 25385.8 |
| 2018-01-10 | 25369.13 |
| 2018-01-11 | 25574.73 |
| 2018-01-12 | 25803.19 |
| 2018-01-16 | 25792.86 |
| 2018-01-17 | 26115.65 |
| 2018-01-18 | 26017.81 |
| 2018-01-19 | 26071.72 |
| 2018-01-22 | 26214.6 |
| 2018-01-23 | 26210.81 |
| 2018-01-24 | 26252.12 |
| 2018-01-25 | 26392.79 |
| 2018-01-26 | 26616.71 |
| 2018-01-29 | 26439.48 |
| 2018-01-30 | 26076.89 |
| 2018-01-31 | 26149.39 |
| 2018-02-01 | 26186.71 |
| 2018-02-02 | 25520.96 |
| 2018-02-05 | 24345.75 |
| 2018-02-06 | 24912.77 |
| 2018-02-07 | 24893.35 |
| 2018-02-08 | 23860.46 |
| 2018-02-09 | 24190.9 |
| 2018-02-12 | 24601.27 |
| 2018-02-13 | 24640.45 |
| 2018-02-14 | 24893.49 |
| 2018-02-15 | 25200.37 |
| 2018-02-16 | 25219.38 |
| 2018-02-19 | 25219.38 |
| 2018-02-20 | 24964.75 |
| 2018-02-21 | 24797.78 |
| 2018-02-22 | 24962.48 |
| 2018-02-23 | 25309.99 |
| 2018-02-26 | 25709.27 |
| 2018-02-27 | 25410.03 |
| 2018-02-28 | 25029.2 |
| 2018-03-01 | 24608.98 |
| 2018-03-02 | 24538.06 |
| 2018-03-05 | 24874.76 |
| 2018-03-06 | 24884.12 |
| 2018-03-07 | 24801.36 |
| 2018-03-08 | 24895.21 |
| 2018-03-09 | 25335.74 |
| 2018-03-12 | 25178.61 |
| 2018-03-13 | 25007.03 |
| 2018-03-14 | 24758.12 |
| 2018-03-15 | 24873.66 |
| 2018-03-16 | 24946.51 |
| 2018-03-19 | 24610.91 |
| 2018-03-20 | 24727.27 |
| 2018-03-21 | 24682.31 |
| 2018-03-22 | 23957.89 |
| 2018-03-23 | 23533.2 |
| 2018-03-26 | 24202.6 |
| 2018-03-27 | 23857.71 |
| 2018-03-28 | 23848.42 |
| 2018-03-29 | 24103.11 |
| 2018-04-02 | 23644.19 |
| 2018-04-03 | 24033.36 |
| 2018-04-04 | 24264.3 |
| 2018-04-05 | 24505.22 |
| 2018-04-06 | 23932.76 |
| 2018-04-09 | 23979.1 |
| 2018-04-10 | 24408 |
| 2018-04-11 | 24189.45 |
| 2018-04-12 | 24483.05 |
| 2018-04-13 | 24360.14 |
| 2018-04-16 | 24573.04 |
| 2018-04-17 | 24786.63 |
| 2018-04-18 | 24748.07 |
| 2018-04-19 | 24664.89 |
| 2018-04-20 | 24462.94 |
| 2018-04-23 | 24448.69 |
| 2018-04-24 | 24024.13 |
| 2018-04-25 | 24083.83 |
| 2018-04-26 | 24322.34 |
| 2018-04-27 | 24311.19 |
| 2018-04-30 | 24163.15 |
| 2018-05-01 | 24099.05 |
| 2018-05-02 | 23924.98 |
| 2018-05-03 | 23930.15 |
| 2018-05-04 | 24262.51 |
| 2018-05-07 | 24357.32 |
| 2018-05-08 | 24360.21 |
| 2018-05-09 | 24542.54 |
| 2018-05-10 | 24739.53 |
| 2018-05-11 | 24831.17 |
| 2018-05-14 | 24899.41 |
| 2018-05-15 | 24706.41 |
| 2018-05-16 | 24768.93 |
| 2018-05-17 | 24713.98 |
| 2018-05-18 | 24715.09 |
| 2018-05-21 | 25013.29 |
| 2018-05-22 | 24834.41 |
| 2018-05-23 | 24886.81 |
| 2018-05-24 | 24811.76 |
| 2018-05-25 | 24753.09 |
| 2018-05-29 | 24361.45 |
| 2018-05-30 | 24667.78 |
| 2018-05-31 | 24415.84 |
| 2018-06-01 | 24635.21 |
| 2018-06-04 | 24813.69 |
| 2018-06-05 | 24799.98 |
| 2018-06-06 | 25146.39 |
| 2018-06-07 | 25241.41 |
| 2018-06-08 | 25316.53 |
| 2018-06-11 | 25322.31 |
| 2018-06-12 | 25320.73 |
| 2018-06-13 | 25201.2 |
| 2018-06-14 | 25175.31 |
| 2018-06-15 | 25090.48 |
| 2018-06-18 | 24987.47 |
| 2018-06-19 | 24700.21 |
| 2018-06-20 | 24657.8 |
| 2018-06-21 | 24461.7 |
| 2018-06-22 | 24580.89 |
| 2018-06-25 | 24252.8 |
| 2018-06-26 | 24283.11 |
| 2018-06-27 | 24117.59 |
| 2018-06-28 | 24216.05 |
| 2018-06-29 | 24271.41 |
| 2018-07-02 | 24307.18 |
| 2018-07-03 | 24174.82 |
| 2018-07-05 | 24356.74 |
| 2018-07-06 | 24456.48 |
| 2018-07-09 | 24776.59 |
| 2018-07-10 | 24919.66 |
| 2018-07-11 | 24700.45 |
| 2018-07-12 | 24924.89 |
| 2018-07-13 | 25019.41 |
| 2018-07-16 | 25064.36 |
| 2018-07-17 | 25119.89 |
| 2018-07-18 | 25199.29 |
| 2018-07-19 | 25064.5 |
| 2018-07-20 | 25058.12 |
| 2018-07-23 | 25044.29 |
| 2018-07-24 | 25241.94 |
| 2018-07-25 | 25414.1 |
| 2018-07-26 | 25527.07 |
| 2018-07-27 | 25451.06 |
| 2018-07-30 | 25306.83 |
| 2018-07-31 | 25415.19 |
| 2018-08-01 | 25333.82 |
| 2018-08-02 | 25326.16 |
| 2018-08-03 | 25462.58 |
| 2018-08-06 | 25502.18 |
| 2018-08-07 | 25628.91 |
| 2018-08-08 | 25583.75 |
| 2018-08-09 | 25509.23 |
| 2018-08-10 | 25313.14 |
| 2018-08-13 | 25187.7 |
| 2018-08-14 | 25299.92 |
| 2018-08-15 | 25162.41 |
| 2018-08-16 | 25558.73 |
| 2018-08-17 | 25669.32 |
| 2018-08-20 | 25758.69 |
| 2018-08-21 | 25822.29 |
| 2018-08-22 | 25733.6 |
| 2018-08-23 | 25656.98 |
| 2018-08-24 | 25790.35 |
| 2018-08-27 | 26049.64 |
| 2018-08-28 | 26064.02 |
| 2018-08-29 | 26124.57 |
| 2018-08-30 | 25986.92 |
| 2018-08-31 | 25964.82 |
| 2018-09-04 | 25952.48 |
| 2018-09-05 | 25974.99 |
| 2018-09-06 | 25995.87 |
| 2018-09-07 | 25916.54 |
| 2018-09-10 | 25857.07 |
| 2018-09-11 | 25971.06 |
| 2018-09-12 | 25998.92 |
| 2018-09-13 | 26145.99 |
| 2018-09-14 | 26154.67 |
| 2018-09-17 | 26062.12 |
| 2018-09-18 | 26246.96 |
| 2018-09-19 | 26405.76 |
| 2018-09-20 | 26656.98 |
| 2018-09-21 | 26743.5 |
| 2018-09-24 | 26562.05 |
| 2018-09-25 | 26492.21 |
| 2018-09-26 | 26385.28 |
| 2018-09-27 | 26439.93 |
| 2018-09-28 | 26458.31 |
| 2018-10-01 | 26651.21 |
| 2018-10-02 | 26773.94 |
| 2018-10-03 | 26828.39 |
| 2018-10-04 | 26627.48 |
| 2018-10-05 | 26447.05 |
| 2018-10-08 | 26486.78 |
| 2018-10-09 | 26430.57 |
| 2018-10-10 | 25598.74 |
| 2018-10-11 | 25052.83 |
| 2018-10-12 | 25339.99 |
| 2018-10-15 | 25250.55 |
| 2018-10-16 | 25798.42 |
| 2018-10-17 | 25706.68 |
| 2018-10-18 | 25379.45 |
| 2018-10-19 | 25444.34 |
| 2018-10-22 | 25317.41 |
| 2018-10-23 | 25191.43 |
| 2018-10-24 | 24583.42 |
| 2018-10-25 | 24984.55 |
| 2018-10-26 | 24688.31 |
| 2018-10-29 | 24442.92 |
| 2018-10-30 | 24874.64 |
| 2018-10-31 | 25115.76 |
| 2018-11-01 | 25380.74 |
| 2018-11-02 | 25270.83 |
| 2018-11-05 | 25461.7 |
| 2018-11-06 | 25635.01 |
| 2018-11-07 | 26180.3 |
| 2018-11-08 | 26191.22 |
| 2018-11-09 | 25989.3 |
| 2018-11-12 | 25387.18 |
| 2018-11-13 | 25286.49 |
| 2018-11-14 | 25080.5 |
| 2018-11-15 | 25289.27 |
| 2018-11-16 | 25413.22 |
| 2018-11-19 | 25017.44 |
| 2018-11-20 | 24465.64 |
| 2018-11-21 | 24464.69 |
| 2018-11-23 | 24285.95 |
| 2018-11-26 | 24640.24 |
| 2018-11-27 | 24748.73 |
| 2018-11-28 | 25366.43 |
| 2018-11-29 | 25338.84 |
| 2018-11-30 | 25538.46 |
| 2018-12-03 | 25826.43 |
| 2018-12-04 | 25027.07 |
| 2018-12-06 | 24947.67 |
| 2018-12-07 | 24388.95 |
| 2018-12-10 | 24423.26 |
| 2018-12-11 | 24370.24 |
| 2018-12-12 | 24527.27 |
| 2018-12-13 | 24597.38 |
| 2018-12-14 | 24100.51 |
| 2018-12-17 | 23592.98 |
| 2018-12-18 | 23675.64 |
| 2018-12-19 | 23323.66 |
| 2018-12-20 | 22859.6 |
| 2018-12-21 | 22445.37 |
| 2018-12-24 | 21792.2 |
| 2018-12-26 | 22878.45 |
| 2018-12-27 | 23138.82 |
| 2018-12-28 | 23062.4 |
| 2018-12-31 | 23327.46 |
| 2019-01-02 | 23346.24 |
| 2019-01-03 | 22686.22 |
| 2019-01-04 | 23433.16 |
| 2019-01-07 | 23531.35 |
| 2019-01-08 | 23787.45 |
| 2019-01-09 | 23879.12 |
| 2019-01-10 | 24001.92 |
| 2019-01-11 | 23995.95 |
| 2019-01-14 | 23909.84 |
| 2019-01-15 | 24065.59 |
| 2019-01-16 | 24207.16 |
| 2019-01-17 | 24370.1 |
| 2019-01-18 | 24706.35 |
| 2019-01-22 | 24404.48 |
| 2019-01-23 | 24575.62 |
| 2019-01-24 | 24553.24 |
| 2019-01-25 | 24737.2 |
| 2019-01-28 | 24528.22 |
| 2019-01-29 | 24579.96 |
| 2019-01-30 | 25014.86 |
| 2019-01-31 | 24999.67 |
| 2019-02-01 | 25063.89 |
| 2019-02-04 | 25239.37 |
| 2019-02-05 | 25411.52 |
| 2019-02-06 | 25390.3 |
| 2019-02-07 | 25169.53 |
| 2019-02-08 | 25106.33 |
| 2019-02-11 | 25053.11 |
| 2019-02-12 | 25425.76 |
| 2019-02-13 | 25543.27 |
| 2019-02-14 | 25439.39 |
| 2019-02-15 | 25883.25 |
| 2019-02-19 | 25891.32 |
| 2019-02-20 | 25954.44 |
| 2019-02-21 | 25850.63 |
| 2019-02-22 | 26031.81 |
| 2019-02-25 | 26091.95 |
| 2019-02-26 | 26057.98 |
| 2019-02-27 | 25985.16 |
| 2019-02-28 | 25916 |
| 2019-03-01 | 26026.32 |
| 2019-03-04 | 25819.65 |
| 2019-03-05 | 25806.63 |
| 2019-03-06 | 25673.46 |
| 2019-03-07 | 25473.23 |
| 2019-03-08 | 25450.24 |
| 2019-03-11 | 25650.88 |
| 2019-03-12 | 25554.66 |
| 2019-03-13 | 25702.89 |
| 2019-03-14 | 25709.94 |
| 2019-03-15 | 25848.87 |
| 2019-03-18 | 25914.1 |
| 2019-03-19 | 25887.38 |
| 2019-03-20 | 25745.67 |
| 2019-03-21 | 25962.51 |
| 2019-03-22 | 25502.32 |
| 2019-03-25 | 25516.83 |
| 2019-03-26 | 25657.73 |
| 2019-03-27 | 25625.59 |
| 2019-03-28 | 25717.46 |
| 2019-03-29 | 25928.68 |
| 2019-04-01 | 26258.42 |
| 2019-04-02 | 26179.13 |
| 2019-04-03 | 26218.13 |
| 2019-04-04 | 26384.63 |
| 2019-04-05 | 26424.99 |
| 2019-04-08 | 26341.02 |
| 2019-04-09 | 26150.58 |
| 2019-04-10 | 26157.16 |
| 2019-04-11 | 26143.05 |
| 2019-04-12 | 26412.3 |
| 2019-04-15 | 26384.77 |
| 2019-04-16 | 26452.66 |
| 2019-04-17 | 26449.54 |
| 2019-04-18 | 26559.54 |
| 2019-04-22 | 26511.05 |
| 2019-04-23 | 26656.39 |
| 2019-04-24 | 26597.05 |
| 2019-04-25 | 26462.08 |
| 2019-04-26 | 26543.33 |
| 2019-04-29 | 26554.39 |
| 2019-04-30 | 26592.91 |
| 2019-05-01 | 26430.14 |
| 2019-05-02 | 26307.79 |
| 2019-05-03 | 26504.95 |
| 2019-05-06 | 26438.48 |
| 2019-05-07 | 25965.09 |
| 2019-05-08 | 25967.33 |
| 2019-05-09 | 25828.36 |
| 2019-05-10 | 25942.37 |
| 2019-05-13 | 25324.99 |
| 2019-05-14 | 25532.05 |
| 2019-05-15 | 25648.02 |
| 2019-05-16 | 25862.68 |
| 2019-05-17 | 25764 |
| 2019-05-20 | 25679.9 |
| 2019-05-21 | 25877.33 |
| 2019-05-22 | 25776.61 |
| 2019-05-23 | 25490.47 |
| 2019-05-24 | 25585.69 |
| 2019-05-28 | 25347.77 |
| 2019-05-29 | 25126.41 |
| 2019-05-30 | 25169.88 |
| 2019-05-31 | 24815.04 |
| 2019-06-03 | 24819.78 |
| 2019-06-04 | 25332.18 |
| 2019-06-05 | 25539.57 |
| 2019-06-06 | 25720.66 |
| 2019-06-07 | 25983.94 |
| 2019-06-10 | 26062.68 |
| 2019-06-11 | 26048.51 |
| 2019-06-12 | 26004.83 |
| 2019-06-13 | 26106.77 |
| 2019-06-14 | 26089.61 |
| 2019-06-17 | 26112.53 |
| 2019-06-18 | 26465.54 |
| 2019-06-19 | 26504 |
| 2019-06-20 | 26753.17 |
| 2019-06-21 | 26719.13 |
| 2019-06-24 | 26727.54 |
| 2019-06-25 | 26548.22 |
| 2019-06-26 | 26536.82 |
| 2019-06-27 | 26526.58 |
| 2019-06-28 | 26599.96 |
| 2019-07-01 | 26717.43 |
| 2019-07-02 | 26786.68 |
| 2019-07-03 | 26966 |
| 2019-07-05 | 26922.12 |
| 2019-07-08 | 26806.14 |
| 2019-07-09 | 26783.49 |
| 2019-07-10 | 26860.2 |
| 2019-07-11 | 27088.08 |
| 2019-07-12 | 27332.03 |
| 2019-07-15 | 27359.16 |
| 2019-07-16 | 27335.63 |
| 2019-07-17 | 27219.85 |
| 2019-07-18 | 27222.97 |
| 2019-07-19 | 27154.2 |
| 2019-07-22 | 27171.9 |
| 2019-07-23 | 27349.19 |
| 2019-07-24 | 27269.97 |
| 2019-07-25 | 27140.98 |
| 2019-07-26 | 27192.45 |
| 2019-07-29 | 27221.35 |
| 2019-07-30 | 27198.02 |
| 2019-07-31 | 26864.27 |
| 2019-08-01 | 26583.42 |
| 2019-08-02 | 26485.01 |
| 2019-08-05 | 25717.74 |
| 2019-08-06 | 26029.52 |
| 2019-08-07 | 26007.07 |
| 2019-08-08 | 26378.19 |
| 2019-08-09 | 26287.44 |
| 2019-08-12 | 25907.37 |
| 2019-08-13 | 26279.91 |
| 2019-08-14 | 25479.42 |
| 2019-08-15 | 25579.39 |
| 2019-08-16 | 25886.01 |
| 2019-08-19 | 26135.79 |
| 2019-08-20 | 25962.44 |
| 2019-08-21 | 26202.73 |
| 2019-08-22 | 26252.24 |
| 2019-08-23 | 25628.9 |
| 2019-08-26 | 25898.83 |
| 2019-08-27 | 25777.9 |
| 2019-08-28 | 26036.1 |
| 2019-08-29 | 26362.25 |
| 2019-08-30 | 26403.28 |
| 2019-09-03 | 26118.02 |
| 2019-09-04 | 26355.47 |
| 2019-09-05 | 26728.15 |
| 2019-09-06 | 26797.46 |
| 2019-09-09 | 26835.51 |
| 2019-09-10 | 26909.43 |
| 2019-09-11 | 27137.04 |
| 2019-09-12 | 27182.45 |
| 2019-09-13 | 27219.52 |
| 2019-09-16 | 27076.82 |
| 2019-09-17 | 27110.8 |
| 2019-09-18 | 27147.08 |
| 2019-09-19 | 27094.79 |
| 2019-09-20 | 26935.07 |
| 2019-09-23 | 26949.99 |
| 2019-09-24 | 26807.77 |
| 2019-09-25 | 26970.71 |
| 2019-09-26 | 26891.12 |
| 2019-09-27 | 26820.25 |
| 2019-09-30 | 26916.83 |
| 2019-10-01 | 26573.04 |
| 2019-10-02 | 26078.62 |
| 2019-10-03 | 26201.04 |
| 2019-10-04 | 26573.72 |
| 2019-10-07 | 26478.02 |
| 2019-10-08 | 26164.04 |
| 2019-10-09 | 26346.01 |
| 2019-10-10 | 26496.67 |
| 2019-10-11 | 26816.59 |
| 2019-10-14 | 26787.36 |
| 2019-10-15 | 27024.8 |
| 2019-10-16 | 27001.98 |
| 2019-10-17 | 27025.88 |
| 2019-10-18 | 26770.2 |
| 2019-10-21 | 26827.64 |
| 2019-10-22 | 26788.1 |
| 2019-10-23 | 26833.95 |
| 2019-10-24 | 26805.53 |
| 2019-10-25 | 26958.06 |
| 2019-10-28 | 27090.72 |
| 2019-10-29 | 27071.42 |
| 2019-10-30 | 27186.69 |
| 2019-10-31 | 27046.23 |
| 2019-11-01 | 27347.36 |
| 2019-11-04 | 27462.11 |
| 2019-11-05 | 27492.63 |
| 2019-11-06 | 27492.56 |
| 2019-11-07 | 27674.8 |
| 2019-11-08 | 27681.24 |
| 2019-11-11 | 27691.49 |
| 2019-11-12 | 27691.49 |
| 2019-11-13 | 27783.59 |
| 2019-11-14 | 27781.96 |
| 2019-11-15 | 28004.89 |
| 2019-11-18 | 28036.22 |
| 2019-11-19 | 27934.02 |
| 2019-11-20 | 27821.09 |
| 2019-11-21 | 27766.29 |
| 2019-11-22 | 27875.62 |
| 2019-11-25 | 28066.47 |
| 2019-11-26 | 28121.68 |
| 2019-11-27 | 28164 |
| 2019-11-29 | 28051.41 |
| 2019-12-02 | 27783.04 |
| 2019-12-03 | 27502.81 |
| 2019-12-04 | 27649.78 |
| 2019-12-05 | 27677.79 |
| 2019-12-06 | 28015.06 |
| 2019-12-09 | 27909.6 |
| 2019-12-10 | 27881.72 |
| 2019-12-11 | 27911.3 |
| 2019-12-12 | 28132.05 |
| 2019-12-13 | 28135.38 |
| 2019-12-16 | 28235.89 |
| 2019-12-17 | 28267.16 |
| 2019-12-18 | 28239.28 |
| 2019-12-19 | 28376.96 |
| 2019-12-20 | 28455.09 |
| 2019-12-23 | 28551.53 |
| 2019-12-24 | 28515.45 |
| 2019-12-26 | 28621.39 |
| 2019-12-27 | 28645.26 |
| 2019-12-30 | 28462.14 |
| 2019-12-31 | 28538.44 |
| 2020-01-02 | 28868.8 |
| 2020-01-03 | 28634.88 |
| 2020-01-06 | 28703.38 |
| 2020-01-07 | 28583.68 |
| 2020-01-08 | 28745.09 |
| 2020-01-09 | 28956.9 |
| 2020-01-10 | 28823.77 |
| 2020-01-13 | 28907.05 |
| 2020-01-14 | 28939.67 |
| 2020-01-15 | 29030.22 |
| 2020-01-16 | 29297.64 |
| 2020-01-17 | 29348.1 |
| 2020-01-21 | 29196.04 |
| 2020-01-22 | 29186.27 |
| 2020-01-23 | 29160.09 |
| 2020-01-24 | 28989.73 |
| 2020-01-27 | 28535.8 |
| 2020-01-28 | 28722.85 |
| 2020-01-29 | 28734.45 |
| 2020-01-30 | 28859.44 |
| 2020-01-31 | 28256.03 |
| 2020-02-03 | 28399.81 |
| 2020-02-04 | 28807.63 |
| 2020-02-05 | 29290.85 |
| 2020-02-06 | 29379.77 |
| 2020-02-07 | 29102.51 |
| 2020-02-10 | 29276.82 |
| 2020-02-11 | 29276.34 |
| 2020-02-12 | 29551.42 |
| 2020-02-13 | 29423.31 |
| 2020-02-14 | 29398.08 |
| 2020-02-17 | 29398.08 |
| 2020-02-18 | 29232.19 |
| 2020-02-19 | 29348.03 |
| 2020-02-20 | 29219.98 |
| 2020-02-21 | 28992.41 |
| 2020-02-24 | 27960.8 |
| 2020-02-25 | 27081.36 |
| 2020-02-26 | 26957.59 |
| 2020-02-27 | 25766.64 |
| 2020-02-28 | 25409.36 |
| 2020-03-02 | 26703.32 |
| 2020-03-03 | 25917.41 |
| 2020-03-04 | 27090.86 |
| 2020-03-05 | 26121.28 |
| 2020-03-06 | 25864.78 |
| 2020-03-09 | 23851.02 |
| 2020-03-10 | 25018.16 |
| 2020-03-11 | 23553.22 |
| 2020-03-12 | 21200.62 |
| 2020-03-13 | 23185.62 |
| 2020-03-16 | 20188.52 |
| 2020-03-17 | 21237.38 |
| 2020-03-18 | 19898.92 |
| 2020-03-19 | 20087.19 |
| 2020-03-20 | 19173.98 |
| 2020-03-23 | 18591.93 |
| 2020-03-24 | 20704.91 |
| 2020-03-25 | 21200.55 |
| 2020-03-26 | 22552.17 |
| 2020-03-27 | 21636.78 |
| 2020-03-30 | 22327.48 |
| 2020-03-31 | 21917.16 |
| 2020-04-01 | 20943.51 |
| 2020-04-02 | 21413.44 |
| 2020-04-03 | 21052.53 |
| 2020-04-06 | 22679.99 |
| 2020-04-07 | 22653.86 |
| 2020-04-08 | 23433.57 |
| 2020-04-09 | 23719.37 |
| 2020-04-13 | 23390.77 |
| 2020-04-14 | 23949.76 |
| 2020-04-15 | 23504.35 |
| 2020-04-16 | 23537.68 |
| 2020-04-17 | 24242.49 |
| 2020-04-20 | 23650.44 |
| 2020-04-21 | 23018.88 |
| 2020-04-22 | 23475.82 |
| 2020-04-23 | 23515.26 |
| 2020-04-24 | 23775.27 |
| 2020-04-27 | 24133.78 |
| 2020-04-28 | 24101.55 |
| 2020-04-29 | 24633.86 |
| 2020-04-30 | 24345.72 |
| 2020-05-01 | 23723.69 |
| 2020-05-04 | 23749.76 |
| 2020-05-05 | 23883.09 |
| 2020-05-06 | 23664.64 |
| 2020-05-07 | 23875.89 |
| 2020-05-08 | 24331.32 |
| 2020-05-11 | 24221.99 |
| 2020-05-12 | 23764.78 |
| 2020-05-13 | 23247.97 |
| 2020-05-14 | 23625.34 |
| 2020-05-15 | 23685.42 |
| 2020-05-18 | 24597.37 |
| 2020-05-19 | 24206.86 |
| 2020-05-20 | 24575.9 |
| 2020-05-21 | 24474.12 |
| 2020-05-22 | 24465.16 |
| 2020-05-26 | 24995.11 |
| 2020-05-27 | 25548.27 |
| 2020-05-28 | 25400.64 |
| 2020-05-29 | 25383.11 |
| 2020-06-01 | 25475.02 |
| 2020-06-02 | 25742.65 |
| 2020-06-03 | 26269.89 |
| 2020-06-04 | 26281.82 |
| 2020-06-05 | 27110.98 |
| 2020-06-08 | 27572.44 |
| 2020-06-09 | 27272.3 |
| 2020-06-10 | 26989.99 |
| 2020-06-11 | 25128.17 |
| 2020-06-12 | 25605.54 |
| 2020-06-15 | 25763.16 |
| 2020-06-16 | 26289.98 |
| 2020-06-17 | 26119.61 |
| 2020-06-18 | 26080.1 |
| 2020-06-19 | 25871.46 |
| 2020-06-22 | 26024.96 |
| 2020-06-23 | 26156.1 |
| 2020-06-24 | 25445.94 |
| 2020-06-25 | 25745.6 |
| 2020-06-26 | 25015.55 |
| 2020-06-29 | 25595.8 |
| 2020-06-30 | 25812.88 |
| 2020-07-01 | 25734.97 |
| 2020-07-02 | 25827.36 |
| 2020-07-06 | 26287.03 |
| 2020-07-07 | 25890.18 |
| 2020-07-08 | 26067.28 |
| 2020-07-09 | 25706.09 |
| 2020-07-10 | 26075.3 |
| 2020-07-13 | 26085.8 |
| 2020-07-14 | 26642.59 |
| 2020-07-15 | 26870.1 |
| 2020-07-16 | 26734.71 |
| 2020-07-17 | 26671.95 |
| 2020-07-20 | 26680.87 |
| 2020-07-21 | 26840.4 |
| 2020-07-22 | 27005.84 |
| 2020-07-23 | 26652.33 |
| 2020-07-24 | 26469.89 |
| 2020-07-27 | 26584.77 |
| 2020-07-28 | 26379.28 |
| 2020-07-29 | 26539.57 |
| 2020-07-30 | 26313.65 |
| 2020-07-31 | 26428.32 |
| 2020-08-03 | 26664.4 |
| 2020-08-04 | 26828.47 |
| 2020-08-05 | 27201.52 |
| 2020-08-06 | 27386.98 |
| 2020-08-07 | 27433.48 |
| 2020-08-10 | 27791.44 |
| 2020-08-11 | 27686.91 |
| 2020-08-12 | 27976.84 |
| 2020-08-13 | 27896.72 |
| 2020-08-14 | 27931.02 |
| 2020-08-17 | 27844.91 |
| 2020-08-18 | 27778.07 |
| 2020-08-19 | 27692.88 |
| 2020-08-20 | 27739.73 |
| 2020-08-21 | 27930.33 |
| 2020-08-24 | 28308.46 |
| 2020-08-25 | 28248.44 |
| 2020-08-26 | 28331.92 |
| 2020-08-27 | 28492.27 |
| 2020-08-28 | 28653.87 |
| 2020-08-31 | 28430.05 |
| 2020-09-01 | 28645.66 |
| 2020-09-02 | 29100.5 |
| 2020-09-03 | 28292.73 |
| 2020-09-04 | 28133.31 |
| 2020-09-08 | 27500.89 |
| 2020-09-09 | 27940.47 |
| 2020-09-10 | 27534.58 |
| 2020-09-11 | 27665.64 |
| 2020-09-14 | 27993.33 |
| 2020-09-15 | 27995.6 |
| 2020-09-16 | 28032.38 |
| 2020-09-17 | 27901.98 |
| 2020-09-18 | 27657.42 |
| 2020-09-21 | 27147.7 |
| 2020-09-22 | 27288.18 |
| 2020-09-23 | 26763.13 |
| 2020-09-24 | 26815.44 |
| 2020-09-25 | 27173.96 |
| 2020-09-28 | 27584.06 |
| 2020-09-29 | 27452.66 |
| 2020-09-30 | 27781.7 |
| 2020-10-01 | 27816.9 |
| 2020-10-02 | 27682.81 |
| 2020-10-05 | 28148.64 |
| 2020-10-06 | 27772.76 |
| 2020-10-07 | 28303.46 |
| 2020-10-08 | 28425.51 |
| 2020-10-09 | 28586.9 |
| 2020-10-12 | 28837.52 |
| 2020-10-13 | 28679.81 |
| 2020-10-14 | 28514 |
| 2020-10-15 | 28494.2 |
| 2020-10-16 | 28606.31 |
| 2020-10-19 | 28195.42 |
| 2020-10-20 | 28308.79 |
| 2020-10-21 | 28210.82 |
| 2020-10-22 | 28363.66 |
| 2020-10-23 | 28335.57 |
| 2020-10-26 | 27685.38 |
| 2020-10-27 | 27463.19 |
| 2020-10-28 | 26519.95 |
| 2020-10-29 | 26659.11 |
| 2020-10-30 | 26501.6 |
| 2020-11-02 | 26925.05 |
| 2020-11-03 | 27480.03 |
| 2020-11-04 | 27847.66 |
| 2020-11-05 | 28390.18 |
| 2020-11-06 | 28323.4 |
| 2020-11-09 | 29157.97 |
| 2020-11-10 | 29420.92 |
| 2020-11-11 | 29397.63 |
| 2020-11-12 | 29080.17 |
| 2020-11-13 | 29479.81 |
| 2020-11-16 | 29950.44 |
| 2020-11-17 | 29783.35 |
| 2020-11-18 | 29438.42 |
| 2020-11-19 | 29483.23 |
| 2020-11-20 | 29263.48 |
| 2020-11-23 | 29591.27 |
| 2020-11-24 | 30046.24 |
| 2020-11-25 | 29872.47 |
| 2020-11-27 | 29910.37 |
| 2020-11-30 | 29638.64 |
| 2020-12-01 | 29823.92 |
| 2020-12-02 | 29883.79 |
| 2020-12-03 | 29969.52 |
| 2020-12-04 | 30218.26 |
| 2020-12-07 | 30069.79 |
| 2020-12-08 | 30173.88 |
| 2020-12-09 | 30068.81 |
| 2020-12-10 | 29999.26 |
| 2020-12-11 | 30046.37 |
| 2020-12-14 | 29861.55 |
| 2020-12-15 | 30199.31 |
| 2020-12-16 | 30154.54 |
| 2020-12-17 | 30303.37 |
| 2020-12-18 | 30179.05 |
| 2020-12-21 | 30216.45 |
| 2020-12-22 | 30015.51 |
| 2020-12-23 | 30129.83 |
| 2020-12-24 | 30199.87 |
| 2020-12-28 | 30403.97 |
| 2020-12-29 | 30335.67 |
| 2020-12-30 | 30409.56 |
| 2020-12-31 | 30606.48 |
| 2021-01-04 | 30223.89 |
| 2021-01-05 | 30391.6 |
| 2021-01-06 | 30829.4 |
| 2021-01-07 | 31041.13 |
| 2021-01-08 | 31097.97 |
| 2021-01-11 | 31008.69 |
| 2021-01-12 | 31068.69 |
| 2021-01-13 | 31060.47 |
| 2021-01-14 | 30991.52 |
| 2021-01-15 | 30814.26 |
| 2021-01-19 | 30930.52 |
| 2021-01-20 | 31188.38 |
| 2021-01-21 | 31176.01 |
| 2021-01-22 | 30996.98 |
| 2021-01-25 | 30960 |
| 2021-01-26 | 30937.04 |
| 2021-01-27 | 30303.17 |
| 2021-01-28 | 30603.36 |
| 2021-01-29 | 29982.62 |
| 2021-02-01 | 30211.91 |
| 2021-02-02 | 30687.48 |
| 2021-02-03 | 30723.6 |
| 2021-02-04 | 31055.86 |
| 2021-02-05 | 31148.24 |
| 2021-02-08 | 31385.76 |
| 2021-02-09 | 31375.83 |
| 2021-02-10 | 31437.8 |
| 2021-02-11 | 31430.7 |
| 2021-02-12 | 31458.4 |
| 2021-02-16 | 31522.75 |
| 2021-02-17 | 31613.02 |
| 2021-02-18 | 31493.34 |
| 2021-02-19 | 31494.32 |
| 2021-02-22 | 31521.69 |
| 2021-02-23 | 31537.35 |
| 2021-02-24 | 31961.86 |
| 2021-02-25 | 31402.01 |
| 2021-02-26 | 30932.37 |
| 2021-03-01 | 31535.51 |
| 2021-03-02 | 31391.52 |
| 2021-03-03 | 31270.09 |
| 2021-03-04 | 30924.14 |
| 2021-03-05 | 31496.3 |
| 2021-03-08 | 31802.44 |
| 2021-03-09 | 31832.74 |
| 2021-03-10 | 32297.02 |
| 2021-03-11 | 32485.59 |
| 2021-03-12 | 32778.64 |
| 2021-03-15 | 32953.46 |
| 2021-03-16 | 32825.95 |
| 2021-03-17 | 33015.37 |
| 2021-03-18 | 32862.3 |
| 2021-03-19 | 32627.97 |
| 2021-03-22 | 32731.2 |
| 2021-03-23 | 32423.15 |
| 2021-03-24 | 32420.06 |
| 2021-03-25 | 32619.48 |
| 2021-03-26 | 33072.88 |
| 2021-03-29 | 33171.37 |
| 2021-03-30 | 33066.96 |
| 2021-03-31 | 32981.55 |
| 2021-04-01 | 33153.21 |
| 2021-04-05 | 33527.19 |
| 2021-04-06 | 33430.24 |
| 2021-04-07 | 33446.26 |
| 2021-04-08 | 33503.57 |
| 2021-04-09 | 33800.6 |
| 2021-04-12 | 33745.4 |
| 2021-04-13 | 33677.27 |
| 2021-04-14 | 33730.89 |
| 2021-04-15 | 34035.99 |
| 2021-04-16 | 34200.67 |
| 2021-04-19 | 34077.63 |
| 2021-04-20 | 33821.3 |
| 2021-04-21 | 34137.31 |
| 2021-04-22 | 33815.9 |
| 2021-04-23 | 34043.49 |
| 2021-04-26 | 33981.57 |
| 2021-04-27 | 33984.93 |
| 2021-04-28 | 33820.38 |
| 2021-04-29 | 34060.36 |
| 2021-04-30 | 33874.85 |
| 2021-05-03 | 34113.23 |
| 2021-05-04 | 34133.03 |
| 2021-05-05 | 34230.34 |
| 2021-05-06 | 34548.53 |
| 2021-05-07 | 34777.76 |
| 2021-05-10 | 34742.82 |
| 2021-05-11 | 34269.16 |
| 2021-05-12 | 33587.66 |
| 2021-05-13 | 34021.45 |
| 2021-05-14 | 34382.13 |
| 2021-05-17 | 34327.79 |
| 2021-05-18 | 34060.66 |
| 2021-05-19 | 33896.04 |
| 2021-05-20 | 34084.15 |
| 2021-05-21 | 34207.84 |
| 2021-05-24 | 34393.98 |
| 2021-05-25 | 34312.46 |
| 2021-05-26 | 34323.05 |
| 2021-05-27 | 34464.64 |
| 2021-05-28 | 34529.45 |
| 2021-06-01 | 34575.31 |
| 2021-06-02 | 34600.38 |
| 2021-06-03 | 34577.04 |
| 2021-06-04 | 34756.39 |
| 2021-06-07 | 34630.24 |
| 2021-06-08 | 34599.82 |
| 2021-06-09 | 34447.14 |
| 2021-06-10 | 34466.24 |
| 2021-06-11 | 34479.6 |
| 2021-06-14 | 34393.75 |
| 2021-06-15 | 34299.33 |
| 2021-06-16 | 34033.67 |
| 2021-06-17 | 33823.45 |
| 2021-06-18 | 33290.08 |
| 2021-06-21 | 33876.97 |
| 2021-06-22 | 33945.58 |
| 2021-06-23 | 33874.24 |
| 2021-06-24 | 34196.82 |
| 2021-06-25 | 34433.84 |
| 2021-06-28 | 34283.27 |
| 2021-06-29 | 34292.29 |
| 2021-06-30 | 34502.51 |
| 2021-07-01 | 34633.53 |
| 2021-07-02 | 34786.35 |
| 2021-07-06 | 34577.37 |
| 2021-07-07 | 34681.79 |
| 2021-07-08 | 34421.93 |
| 2021-07-09 | 34870.16 |
| 2021-07-12 | 34996.18 |
| 2021-07-13 | 34888.79 |
| 2021-07-14 | 34933.23 |
| 2021-07-15 | 34987.02 |
| 2021-07-16 | 34687.85 |
| 2021-07-19 | 33962.04 |
| 2021-07-20 | 34511.99 |
| 2021-07-21 | 34798 |
| 2021-07-22 | 34823.35 |
| 2021-07-23 | 35061.55 |
| 2021-07-26 | 35144.31 |
| 2021-07-27 | 35058.52 |
| 2021-07-28 | 34930.93 |
| 2021-07-29 | 35084.53 |
| 2021-07-30 | 34935.47 |
| 2021-08-02 | 34838.16 |
| 2021-08-03 | 35116.4 |
| 2021-08-04 | 34792.67 |
| 2021-08-05 | 35064.25 |
| 2021-08-06 | 35208.51 |
| 2021-08-09 | 35101.85 |
| 2021-08-10 | 35264.67 |
| 2021-08-11 | 35484.97 |
| 2021-08-12 | 35499.85 |
| 2021-08-13 | 35515.38 |
| 2021-08-16 | 35625.4 |
| 2021-08-17 | 35343.28 |
| 2021-08-18 | 34960.69 |
| 2021-08-19 | 34894.12 |
| 2021-08-20 | 35120.08 |
| 2021-08-23 | 35335.71 |
| 2021-08-24 | 35366.26 |
| 2021-08-25 | 35405.5 |
| 2021-08-26 | 35213.12 |
| 2021-08-27 | 35455.8 |
| 2021-08-30 | 35399.84 |
| 2021-08-31 | 35360.73 |
| 2021-09-01 | 35312.53 |
| 2021-09-02 | 35443.82 |
| 2021-09-03 | 35369.09 |
| 2021-09-07 | 35100 |
| 2021-09-08 | 35031.07 |
| 2021-09-09 | 34879.38 |
| 2021-09-10 | 34607.72 |
| 2021-09-13 | 34869.63 |
| 2021-09-14 | 34577.57 |
| 2021-09-15 | 34814.39 |
| 2021-09-16 | 34751.32 |
| 2021-09-17 | 34584.88 |
| 2021-09-20 | 33970.47 |
| 2021-09-21 | 33919.84 |
| 2021-09-22 | 34258.32 |
| 2021-09-23 | 34764.82 |
| 2021-09-24 | 34798 |
| 2021-09-27 | 34869.37 |
| 2021-09-28 | 34299.99 |
| 2021-09-29 | 34390.72 |
| 2021-09-30 | 33843.92 |
| 2021-10-01 | 34326.46 |
| 2021-10-04 | 34002.92 |
| 2021-10-05 | 34314.67 |
| 2021-10-06 | 34416.99 |
| 2021-10-07 | 34754.94 |
| 2021-10-08 | 34746.25 |
| 2021-10-11 | 34496.06 |
| 2021-10-12 | 34378.34 |
| 2021-10-13 | 34377.81 |
| 2021-10-14 | 34912.56 |
| 2021-10-15 | 35294.76 |
| 2021-10-18 | 35258.61 |
| 2021-10-19 | 35457.31 |
| 2021-10-20 | 35609.34 |
| 2021-10-21 | 35603.08 |
| 2021-10-22 | 35677.02 |
| 2021-10-25 | 35741.15 |
| 2021-10-26 | 35756.88 |
| 2021-10-27 | 35490.69 |
| 2021-10-28 | 35730.48 |
| 2021-10-29 | 35819.56 |
| 2021-11-01 | 35913.84 |
| 2021-11-02 | 36052.63 |
| 2021-11-03 | 36157.58 |
| 2021-11-04 | 36124.23 |
| 2021-11-05 | 36327.95 |
| 2021-11-08 | 36432.22 |
| 2021-11-09 | 36319.98 |
| 2021-11-10 | 36079.94 |
| 2021-11-11 | 35921.23 |
| 2021-11-12 | 36100.31 |
| 2021-11-15 | 36087.45 |
| 2021-11-16 | 36142.22 |
| 2021-11-17 | 35931.05 |
| 2021-11-18 | 35870.95 |
| 2021-11-19 | 35601.98 |
| 2021-11-22 | 35619.25 |
| 2021-11-23 | 35813.8 |
| 2021-11-24 | 35804.38 |
| 2021-11-25 | 35804.38 |
| 2021-11-26 | 34899.34 |
| 2021-11-29 | 35135.94 |
| 2021-11-30 | 34483.72 |
| 2021-12-01 | 34022.04 |
| 2021-12-02 | 34639.79 |
| 2021-12-03 | 34580.08 |
| 2021-12-06 | 35227.03 |
| 2021-12-07 | 35719.43 |
| 2021-12-08 | 35754.75 |
| 2021-12-09 | 35754.69 |
| 2021-12-10 | 35970.99 |
| 2021-12-13 | 35650.95 |
| 2021-12-14 | 35544.18 |
| 2021-12-15 | 35927.43 |
| 2021-12-16 | 35897.64 |
| 2021-12-17 | 35365.44 |
| 2021-12-20 | 34932.16 |
| 2021-12-21 | 35492.7 |
| 2021-12-22 | 35753.89 |
| 2021-12-23 | 35950.56 |
| 2021-12-24 | 35950.56 |
| 2021-12-27 | 36302.38 |
| 2021-12-28 | 36398.21 |
| 2021-12-29 | 36488.63 |
| 2021-12-30 | 36398.08 |
| 2021-12-31 | 36338.3 |
| 2022-01-03 | 36585.06 |
| 2022-01-04 | 36799.65 |
| 2022-01-05 | 36407.11 |
| 2022-01-06 | 36236.47 |
| 2022-01-07 | 36231.66 |
| 2022-01-10 | 36068.87 |
| 2022-01-11 | 36252.02 |
| 2022-01-12 | 36290.32 |
| 2022-01-13 | 36113.62 |
| 2022-01-14 | 35911.81 |
| 2022-01-17 | 35911.81 |
| 2022-01-18 | 35368.47 |
| 2022-01-19 | 35028.65 |
| 2022-01-20 | 34715.39 |
| 2022-01-21 | 34265.37 |
| 2022-01-24 | 34364.5 |
| 2022-01-25 | 34297.73 |
| 2022-01-26 | 34168.09 |
| 2022-01-27 | 34160.78 |
| 2022-01-28 | 34725.47 |
| 2022-01-31 | 35131.86 |
| 2022-02-01 | 35405.24 |
| 2022-02-02 | 35629.33 |
| 2022-02-03 | 35111.16 |
| 2022-02-04 | 35089.74 |
| 2022-02-07 | 35091.13 |
| 2022-02-08 | 35462.78 |
| 2022-02-09 | 35768.06 |
| 2022-02-10 | 35241.59 |
| 2022-02-11 | 34738.06 |
| 2022-02-14 | 34566.17 |
| 2022-02-15 | 34988.84 |
| 2022-02-16 | 34934.27 |
| 2022-02-17 | 34312.03 |
| 2022-02-18 | 34079.18 |
| 2022-02-21 | 34079.18 |
| 2022-02-22 | 33596.61 |
| 2022-02-23 | 33131.76 |
| 2022-02-24 | 33223.83 |
| 2022-02-25 | 34058.75 |
| 2022-02-28 | 33892.6 |
| 2022-03-01 | 33294.95 |
| 2022-03-02 | 33891.35 |
| 2022-03-03 | 33794.66 |
| 2022-03-04 | 33614.8 |
| 2022-03-07 | 32817.38 |
| 2022-03-08 | 32632.64 |
| 2022-03-09 | 33286.25 |
| 2022-03-10 | 33174.07 |
| 2022-03-11 | 32944.19 |
| 2022-03-14 | 32945.24 |
| 2022-03-15 | 33544.34 |
| 2022-03-16 | 34063.1 |
| 2022-03-17 | 34480.76 |
| 2022-03-18 | 34754.93 |
| 2022-03-21 | 34552.99 |
| 2022-03-22 | 34807.46 |
| 2022-03-23 | 34358.5 |
| 2022-03-24 | 34707.94 |
| 2022-03-25 | 34861.24 |
| 2022-03-28 | 34955.89 |
| 2022-03-29 | 35294.19 |
| 2022-03-30 | 35228.81 |
| 2022-03-31 | 34678.35 |
| 2022-04-01 | 34818.27 |
| 2022-04-04 | 34921.88 |
| 2022-04-05 | 34641.18 |
| 2022-04-06 | 34496.51 |
| 2022-04-07 | 34583.57 |
| 2022-04-08 | 34721.12 |
| 2022-04-11 | 34308.08 |
| 2022-04-12 | 34220.36 |
| 2022-04-13 | 34564.59 |
| 2022-04-14 | 34451.23 |
| 2022-04-18 | 34411.69 |
| 2022-04-19 | 34911.2 |
| 2022-04-20 | 35160.79 |
| 2022-04-21 | 34792.76 |
| 2022-04-22 | 33811.4 |
| 2022-04-25 | 34049.46 |
| 2022-04-26 | 33240.18 |
| 2022-04-27 | 33301.93 |
| 2022-04-28 | 33916.39 |
| 2022-04-29 | 32977.21 |
| 2022-05-02 | 33061.5 |
| 2022-05-03 | 33128.79 |
| 2022-05-04 | 34061.06 |
| 2022-05-05 | 32997.97 |
| 2022-05-06 | 32899.37 |
| 2022-05-09 | 32245.7 |
| 2022-05-10 | 32160.74 |
| 2022-05-11 | 31834.11 |
| 2022-05-12 | 31730.3 |
| 2022-05-13 | 32196.66 |
| 2022-05-16 | 32223.42 |
| 2022-05-17 | 32654.59 |
| 2022-05-18 | 31490.07 |
| 2022-05-19 | 31253.13 |
| 2022-05-20 | 31261.9 |
| 2022-05-23 | 31880.24 |
| 2022-05-24 | 31928.62 |
| 2022-05-25 | 32120.28 |
| 2022-05-26 | 32637.19 |
| 2022-05-27 | 33212.96 |
| 2022-05-31 | 32990.12 |
| 2022-06-01 | 32813.23 |
| 2022-06-02 | 33248.28 |
| 2022-06-03 | 32899.7 |
| 2022-06-06 | 32915.78 |
| 2022-06-07 | 33180.14 |
| 2022-06-08 | 32910.9 |
| 2022-06-09 | 32272.79 |
| 2022-06-10 | 31392.79 |
| 2022-06-13 | 30516.74 |
| 2022-06-14 | 30364.83 |
| 2022-06-15 | 30668.53 |
| 2022-06-16 | 29927.07 |
| 2022-06-17 | 29888.78 |
| 2022-06-21 | 30530.25 |
| 2022-06-22 | 30483.13 |
| 2022-06-23 | 30677.36 |
| 2022-06-24 | 31500.68 |
| 2022-06-27 | 31438.26 |
| 2022-06-28 | 30946.99 |
| 2022-06-29 | 31029.31 |
| 2022-06-30 | 30775.43 |
| 2022-07-01 | 31097.26 |
| 2022-07-05 | 30967.82 |
| 2022-07-06 | 31037.68 |
| 2022-07-07 | 31384.55 |
| 2022-07-08 | 31338.15 |
| 2022-07-11 | 31173.84 |
| 2022-07-12 | 30981.33 |
| 2022-07-13 | 30772.79 |
| 2022-07-14 | 30630.17 |
| 2022-07-15 | 31288.26 |
| 2022-07-18 | 31072.61 |
| 2022-07-19 | 31827.05 |
| 2022-07-20 | 31874.84 |
| 2022-07-21 | 32036.9 |
| 2022-07-22 | 31899.29 |
| 2022-07-25 | 31990.04 |
| 2022-07-26 | 31761.54 |
| 2022-07-27 | 32197.59 |
| 2022-07-28 | 32529.63 |
| 2022-07-29 | 32845.13 |
| 2022-08-01 | 32798.4 |
| 2022-08-02 | 32396.17 |
| 2022-08-03 | 32812.5 |
| 2022-08-04 | 32726.82 |
| 2022-08-05 | 32803.47 |
| 2022-08-08 | 32832.54 |
| 2022-08-09 | 32774.41 |
| 2022-08-10 | 33309.51 |
| 2022-08-11 | 33336.67 |
| 2022-08-12 | 33761.05 |
| 2022-08-15 | 33912.44 |
| 2022-08-16 | 34152.01 |
| 2022-08-17 | 33980.32 |
| 2022-08-18 | 33999.04 |
| 2022-08-19 | 33706.74 |
| 2022-08-22 | 33063.61 |
| 2022-08-23 | 32909.59 |
| 2022-08-24 | 32969.23 |
| 2022-08-25 | 33291.78 |
| 2022-08-26 | 32283.4 |
| 2022-08-29 | 32098.99 |
| 2022-08-30 | 31790.87 |
| 2022-08-31 | 31510.43 |
| 2022-09-01 | 31656.42 |
| 2022-09-02 | 31318.44 |
| 2022-09-06 | 31145.3 |
| 2022-09-07 | 31581.28 |
| 2022-09-08 | 31774.52 |
| 2022-09-09 | 32151.71 |
| 2022-09-12 | 32381.34 |
| 2022-09-13 | 31104.97 |
| 2022-09-14 | 31135.09 |
| 2022-09-15 | 30961.82 |
| 2022-09-16 | 30822.42 |
| 2022-09-19 | 31019.68 |
| 2022-09-20 | 30706.23 |
| 2022-09-21 | 30183.78 |
| 2022-09-22 | 30076.68 |
| 2022-09-23 | 29590.41 |
| 2022-09-26 | 29260.81 |